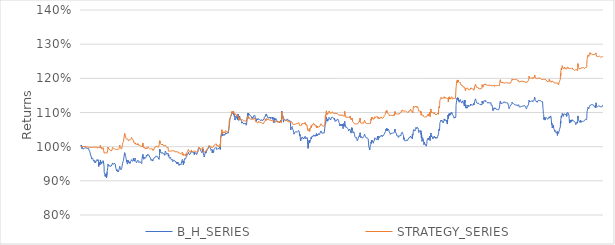
| Category | B_H_SERIES | STRATEGY_SERIES |
|---|---|---|
| 2021-06-01 09:35:00-04:00 | 1 | 1 |
| 2021-06-01 09:40:00-04:00 | 1.005 | 1 |
| 2021-06-01 09:45:00-04:00 | 1.005 | 1 |
| 2021-06-01 09:50:00-04:00 | 1.003 | 1 |
| 2021-06-01 09:55:00-04:00 | 1.004 | 1 |
| 2021-06-01 10:00:00-04:00 | 1.004 | 1 |
| 2021-06-01 10:05:00-04:00 | 1 | 1 |
| 2021-06-01 10:10:00-04:00 | 1.001 | 1 |
| 2021-06-01 10:15:00-04:00 | 0.994 | 1 |
| 2021-06-01 10:20:00-04:00 | 0.997 | 1 |
| 2021-06-01 10:25:00-04:00 | 0.998 | 1 |
| 2021-06-01 10:30:00-04:00 | 0.997 | 1 |
| 2021-06-01 10:35:00-04:00 | 0.999 | 1 |
| 2021-06-01 10:40:00-04:00 | 0.996 | 1 |
| 2021-06-01 10:45:00-04:00 | 0.996 | 1 |
| 2021-06-01 10:50:00-04:00 | 0.994 | 1 |
| 2021-06-01 10:55:00-04:00 | 0.993 | 1 |
| 2021-06-01 11:00:00-04:00 | 0.994 | 1 |
| 2021-06-01 11:05:00-04:00 | 0.993 | 1 |
| 2021-06-01 11:10:00-04:00 | 0.993 | 1 |
| 2021-06-01 11:15:00-04:00 | 0.993 | 1 |
| 2021-06-01 11:20:00-04:00 | 0.993 | 1 |
| 2021-06-01 11:25:00-04:00 | 0.995 | 1 |
| 2021-06-01 11:30:00-04:00 | 0.993 | 1 |
| 2021-06-01 11:35:00-04:00 | 0.993 | 1 |
| 2021-06-01 11:40:00-04:00 | 0.996 | 1 |
| 2021-06-01 11:45:00-04:00 | 0.996 | 1 |
| 2021-06-01 11:50:00-04:00 | 0.995 | 1 |
| 2021-06-01 11:55:00-04:00 | 0.996 | 1 |
| 2021-06-01 12:00:00-04:00 | 0.995 | 1 |
| 2021-06-01 12:05:00-04:00 | 0.995 | 0.999 |
| 2021-06-01 12:10:00-04:00 | 0.995 | 0.999 |
| 2021-06-01 12:15:00-04:00 | 0.995 | 0.999 |
| 2021-06-01 12:20:00-04:00 | 0.996 | 1.001 |
| 2021-06-01 12:25:00-04:00 | 0.997 | 1.001 |
| 2021-06-01 12:30:00-04:00 | 0.997 | 1.001 |
| 2021-06-01 12:35:00-04:00 | 0.997 | 1.002 |
| 2021-06-01 12:40:00-04:00 | 0.996 | 1.001 |
| 2021-06-01 12:45:00-04:00 | 0.998 | 1.003 |
| 2021-06-01 12:50:00-04:00 | 0.998 | 1.003 |
| 2021-06-01 12:55:00-04:00 | 0.998 | 1.002 |
| 2021-06-01 13:00:00-04:00 | 0.997 | 1.002 |
| 2021-06-01 13:05:00-04:00 | 0.996 | 1.001 |
| 2021-06-01 13:10:00-04:00 | 0.996 | 1.001 |
| 2021-06-01 13:15:00-04:00 | 0.995 | 0.999 |
| 2021-06-01 13:20:00-04:00 | 0.994 | 0.999 |
| 2021-06-01 13:25:00-04:00 | 0.995 | 0.999 |
| 2021-06-01 13:30:00-04:00 | 0.996 | 0.999 |
| 2021-06-01 13:35:00-04:00 | 0.995 | 0.999 |
| 2021-06-01 13:40:00-04:00 | 0.996 | 0.999 |
| 2021-06-01 13:45:00-04:00 | 0.996 | 0.999 |
| 2021-06-01 13:50:00-04:00 | 0.996 | 0.999 |
| 2021-06-01 13:55:00-04:00 | 0.995 | 0.999 |
| 2021-06-01 14:00:00-04:00 | 0.994 | 0.999 |
| 2021-06-01 14:05:00-04:00 | 0.994 | 0.999 |
| 2021-06-01 14:10:00-04:00 | 0.995 | 0.999 |
| 2021-06-01 14:15:00-04:00 | 0.995 | 0.999 |
| 2021-06-01 14:20:00-04:00 | 0.994 | 0.999 |
| 2021-06-01 14:25:00-04:00 | 0.995 | 0.999 |
| 2021-06-01 14:30:00-04:00 | 0.995 | 0.999 |
| 2021-06-01 14:35:00-04:00 | 0.994 | 0.999 |
| 2021-06-01 14:40:00-04:00 | 0.995 | 0.999 |
| 2021-06-01 14:45:00-04:00 | 0.996 | 0.999 |
| 2021-06-01 14:50:00-04:00 | 0.997 | 0.999 |
| 2021-06-01 14:55:00-04:00 | 0.995 | 0.999 |
| 2021-06-01 15:00:00-04:00 | 0.995 | 0.999 |
| 2021-06-01 15:05:00-04:00 | 0.994 | 0.999 |
| 2021-06-01 15:10:00-04:00 | 0.994 | 0.998 |
| 2021-06-01 15:15:00-04:00 | 0.995 | 0.999 |
| 2021-06-01 15:20:00-04:00 | 0.994 | 0.998 |
| 2021-06-01 15:25:00-04:00 | 0.994 | 0.998 |
| 2021-06-01 15:30:00-04:00 | 0.99 | 0.998 |
| 2021-06-01 15:35:00-04:00 | 0.99 | 0.998 |
| 2021-06-01 15:40:00-04:00 | 0.989 | 0.998 |
| 2021-06-01 15:45:00-04:00 | 0.989 | 0.998 |
| 2021-06-01 15:50:00-04:00 | 0.991 | 0.998 |
| 2021-06-01 15:55:00-04:00 | 0.992 | 0.998 |
| 2021-06-02 09:30:00-04:00 | 0.993 | 0.998 |
| 2021-06-02 09:35:00-04:00 | 0.988 | 0.998 |
| 2021-06-02 09:40:00-04:00 | 0.985 | 0.998 |
| 2021-06-02 09:45:00-04:00 | 0.986 | 0.998 |
| 2021-06-02 09:50:00-04:00 | 0.983 | 0.998 |
| 2021-06-02 09:55:00-04:00 | 0.981 | 0.998 |
| 2021-06-02 10:00:00-04:00 | 0.978 | 0.998 |
| 2021-06-02 10:05:00-04:00 | 0.976 | 0.998 |
| 2021-06-02 10:10:00-04:00 | 0.977 | 0.998 |
| 2021-06-02 10:15:00-04:00 | 0.977 | 0.998 |
| 2021-06-02 10:20:00-04:00 | 0.978 | 0.998 |
| 2021-06-02 10:25:00-04:00 | 0.978 | 0.998 |
| 2021-06-02 10:30:00-04:00 | 0.977 | 0.998 |
| 2021-06-02 10:35:00-04:00 | 0.973 | 0.998 |
| 2021-06-02 10:40:00-04:00 | 0.971 | 0.998 |
| 2021-06-02 10:45:00-04:00 | 0.972 | 0.998 |
| 2021-06-02 10:50:00-04:00 | 0.97 | 0.998 |
| 2021-06-02 10:55:00-04:00 | 0.964 | 0.998 |
| 2021-06-02 11:00:00-04:00 | 0.962 | 0.998 |
| 2021-06-02 11:05:00-04:00 | 0.963 | 0.998 |
| 2021-06-02 11:10:00-04:00 | 0.964 | 0.998 |
| 2021-06-02 11:15:00-04:00 | 0.965 | 0.998 |
| 2021-06-02 11:20:00-04:00 | 0.963 | 0.998 |
| 2021-06-02 11:25:00-04:00 | 0.965 | 0.998 |
| 2021-06-02 11:30:00-04:00 | 0.966 | 0.998 |
| 2021-06-02 11:35:00-04:00 | 0.964 | 0.998 |
| 2021-06-02 11:40:00-04:00 | 0.967 | 0.998 |
| 2021-06-02 11:45:00-04:00 | 0.966 | 0.998 |
| 2021-06-02 11:50:00-04:00 | 0.965 | 0.998 |
| 2021-06-02 11:55:00-04:00 | 0.965 | 0.998 |
| 2021-06-02 12:00:00-04:00 | 0.963 | 0.998 |
| 2021-06-02 12:05:00-04:00 | 0.962 | 0.998 |
| 2021-06-02 12:10:00-04:00 | 0.964 | 1 |
| 2021-06-02 12:15:00-04:00 | 0.964 | 1 |
| 2021-06-02 12:20:00-04:00 | 0.962 | 0.998 |
| 2021-06-02 12:25:00-04:00 | 0.958 | 0.998 |
| 2021-06-02 12:30:00-04:00 | 0.957 | 0.998 |
| 2021-06-02 12:35:00-04:00 | 0.957 | 0.998 |
| 2021-06-02 12:40:00-04:00 | 0.958 | 0.998 |
| 2021-06-02 12:45:00-04:00 | 0.96 | 0.998 |
| 2021-06-02 12:50:00-04:00 | 0.959 | 0.998 |
| 2021-06-02 12:55:00-04:00 | 0.959 | 0.998 |
| 2021-06-02 13:00:00-04:00 | 0.961 | 0.998 |
| 2021-06-02 13:05:00-04:00 | 0.959 | 0.998 |
| 2021-06-02 13:10:00-04:00 | 0.96 | 0.998 |
| 2021-06-02 13:15:00-04:00 | 0.958 | 0.998 |
| 2021-06-02 13:20:00-04:00 | 0.957 | 0.998 |
| 2021-06-02 13:25:00-04:00 | 0.953 | 0.998 |
| 2021-06-02 13:30:00-04:00 | 0.956 | 0.998 |
| 2021-06-02 13:35:00-04:00 | 0.957 | 0.998 |
| 2021-06-02 13:40:00-04:00 | 0.956 | 0.998 |
| 2021-06-02 13:45:00-04:00 | 0.957 | 0.998 |
| 2021-06-02 13:50:00-04:00 | 0.955 | 0.998 |
| 2021-06-02 13:55:00-04:00 | 0.954 | 0.998 |
| 2021-06-02 14:00:00-04:00 | 0.954 | 0.998 |
| 2021-06-02 14:05:00-04:00 | 0.955 | 0.998 |
| 2021-06-02 14:10:00-04:00 | 0.955 | 0.998 |
| 2021-06-02 14:15:00-04:00 | 0.954 | 0.998 |
| 2021-06-02 14:20:00-04:00 | 0.956 | 0.998 |
| 2021-06-02 14:25:00-04:00 | 0.959 | 0.998 |
| 2021-06-02 14:30:00-04:00 | 0.96 | 0.998 |
| 2021-06-02 14:35:00-04:00 | 0.961 | 0.998 |
| 2021-06-02 14:40:00-04:00 | 0.96 | 0.997 |
| 2021-06-02 14:45:00-04:00 | 0.961 | 0.998 |
| 2021-06-02 14:50:00-04:00 | 0.96 | 0.997 |
| 2021-06-02 14:55:00-04:00 | 0.961 | 0.999 |
| 2021-06-02 15:00:00-04:00 | 0.962 | 1 |
| 2021-06-02 15:05:00-04:00 | 0.962 | 0.999 |
| 2021-06-02 15:10:00-04:00 | 0.963 | 1 |
| 2021-06-02 15:15:00-04:00 | 0.963 | 1 |
| 2021-06-02 15:20:00-04:00 | 0.962 | 0.999 |
| 2021-06-02 15:25:00-04:00 | 0.958 | 0.996 |
| 2021-06-02 15:30:00-04:00 | 0.959 | 0.996 |
| 2021-06-02 15:35:00-04:00 | 0.961 | 0.998 |
| 2021-06-02 15:40:00-04:00 | 0.959 | 0.997 |
| 2021-06-02 15:45:00-04:00 | 0.96 | 0.997 |
| 2021-06-02 15:50:00-04:00 | 0.962 | 0.997 |
| 2021-06-02 15:55:00-04:00 | 0.963 | 0.997 |
| 2021-06-03 09:30:00-04:00 | 0.962 | 0.997 |
| 2021-06-03 09:35:00-04:00 | 0.954 | 0.997 |
| 2021-06-03 09:40:00-04:00 | 0.945 | 0.997 |
| 2021-06-03 09:45:00-04:00 | 0.942 | 0.997 |
| 2021-06-03 09:50:00-04:00 | 0.941 | 0.997 |
| 2021-06-03 09:55:00-04:00 | 0.951 | 0.997 |
| 2021-06-03 10:00:00-04:00 | 0.953 | 0.997 |
| 2021-06-03 10:05:00-04:00 | 0.954 | 0.997 |
| 2021-06-03 10:10:00-04:00 | 0.954 | 0.997 |
| 2021-06-03 10:15:00-04:00 | 0.951 | 0.997 |
| 2021-06-03 10:20:00-04:00 | 0.948 | 0.997 |
| 2021-06-03 10:25:00-04:00 | 0.948 | 0.997 |
| 2021-06-03 10:30:00-04:00 | 0.948 | 0.997 |
| 2021-06-03 10:35:00-04:00 | 0.951 | 0.997 |
| 2021-06-03 10:40:00-04:00 | 0.947 | 0.997 |
| 2021-06-03 10:45:00-04:00 | 0.948 | 0.997 |
| 2021-06-03 10:50:00-04:00 | 0.952 | 0.997 |
| 2021-06-03 10:55:00-04:00 | 0.954 | 0.997 |
| 2021-06-03 11:00:00-04:00 | 0.961 | 1.004 |
| 2021-06-03 11:05:00-04:00 | 0.957 | 1 |
| 2021-06-03 11:10:00-04:00 | 0.957 | 1 |
| 2021-06-03 11:15:00-04:00 | 0.955 | 0.998 |
| 2021-06-03 11:20:00-04:00 | 0.953 | 0.996 |
| 2021-06-03 11:25:00-04:00 | 0.954 | 0.997 |
| 2021-06-03 11:30:00-04:00 | 0.955 | 0.998 |
| 2021-06-03 11:35:00-04:00 | 0.952 | 0.995 |
| 2021-06-03 11:40:00-04:00 | 0.954 | 0.997 |
| 2021-06-03 11:45:00-04:00 | 0.956 | 0.999 |
| 2021-06-03 11:50:00-04:00 | 0.953 | 0.996 |
| 2021-06-03 11:55:00-04:00 | 0.951 | 0.994 |
| 2021-06-03 12:00:00-04:00 | 0.951 | 0.994 |
| 2021-06-03 12:05:00-04:00 | 0.953 | 0.994 |
| 2021-06-03 12:10:00-04:00 | 0.953 | 0.994 |
| 2021-06-03 12:15:00-04:00 | 0.951 | 0.994 |
| 2021-06-03 12:20:00-04:00 | 0.953 | 0.994 |
| 2021-06-03 12:25:00-04:00 | 0.953 | 0.994 |
| 2021-06-03 12:30:00-04:00 | 0.954 | 0.994 |
| 2021-06-03 12:35:00-04:00 | 0.954 | 0.994 |
| 2021-06-03 12:40:00-04:00 | 0.955 | 0.994 |
| 2021-06-03 12:45:00-04:00 | 0.956 | 0.995 |
| 2021-06-03 12:50:00-04:00 | 0.956 | 0.995 |
| 2021-06-03 12:55:00-04:00 | 0.956 | 0.994 |
| 2021-06-03 13:00:00-04:00 | 0.959 | 0.998 |
| 2021-06-03 13:05:00-04:00 | 0.958 | 0.997 |
| 2021-06-03 13:10:00-04:00 | 0.958 | 0.996 |
| 2021-06-03 13:15:00-04:00 | 0.956 | 0.994 |
| 2021-06-03 13:20:00-04:00 | 0.958 | 0.996 |
| 2021-06-03 13:25:00-04:00 | 0.957 | 0.996 |
| 2021-06-03 13:30:00-04:00 | 0.957 | 0.996 |
| 2021-06-03 13:35:00-04:00 | 0.956 | 0.995 |
| 2021-06-03 13:40:00-04:00 | 0.953 | 0.992 |
| 2021-06-03 13:45:00-04:00 | 0.943 | 0.982 |
| 2021-06-03 13:50:00-04:00 | 0.925 | 0.982 |
| 2021-06-03 13:55:00-04:00 | 0.926 | 0.982 |
| 2021-06-03 14:00:00-04:00 | 0.923 | 0.982 |
| 2021-06-03 14:05:00-04:00 | 0.924 | 0.982 |
| 2021-06-03 14:10:00-04:00 | 0.925 | 0.982 |
| 2021-06-03 14:15:00-04:00 | 0.924 | 0.982 |
| 2021-06-03 14:20:00-04:00 | 0.919 | 0.982 |
| 2021-06-03 14:25:00-04:00 | 0.92 | 0.982 |
| 2021-06-03 14:30:00-04:00 | 0.914 | 0.982 |
| 2021-06-03 14:35:00-04:00 | 0.913 | 0.982 |
| 2021-06-03 14:40:00-04:00 | 0.913 | 0.982 |
| 2021-06-03 14:45:00-04:00 | 0.916 | 0.982 |
| 2021-06-03 14:50:00-04:00 | 0.919 | 0.982 |
| 2021-06-03 14:55:00-04:00 | 0.919 | 0.982 |
| 2021-06-03 15:00:00-04:00 | 0.913 | 0.982 |
| 2021-06-03 15:05:00-04:00 | 0.916 | 0.982 |
| 2021-06-03 15:10:00-04:00 | 0.921 | 0.982 |
| 2021-06-03 15:15:00-04:00 | 0.918 | 0.982 |
| 2021-06-03 15:20:00-04:00 | 0.914 | 0.982 |
| 2021-06-03 15:25:00-04:00 | 0.915 | 0.982 |
| 2021-06-03 15:30:00-04:00 | 0.914 | 0.982 |
| 2021-06-03 15:35:00-04:00 | 0.909 | 0.982 |
| 2021-06-03 15:40:00-04:00 | 0.908 | 0.982 |
| 2021-06-03 15:45:00-04:00 | 0.906 | 0.982 |
| 2021-06-03 15:50:00-04:00 | 0.906 | 0.982 |
| 2021-06-03 15:55:00-04:00 | 0.909 | 0.982 |
| 2021-06-04 09:30:00-04:00 | 0.907 | 0.982 |
| 2021-06-04 09:35:00-04:00 | 0.927 | 0.982 |
| 2021-06-04 09:40:00-04:00 | 0.929 | 0.982 |
| 2021-06-04 09:45:00-04:00 | 0.931 | 0.982 |
| 2021-06-04 09:50:00-04:00 | 0.931 | 0.981 |
| 2021-06-04 09:55:00-04:00 | 0.933 | 0.983 |
| 2021-06-04 10:00:00-04:00 | 0.94 | 0.99 |
| 2021-06-04 10:05:00-04:00 | 0.944 | 0.995 |
| 2021-06-04 10:10:00-04:00 | 0.949 | 0.999 |
| 2021-06-04 10:15:00-04:00 | 0.946 | 0.996 |
| 2021-06-04 10:20:00-04:00 | 0.945 | 0.996 |
| 2021-06-04 10:25:00-04:00 | 0.948 | 0.998 |
| 2021-06-04 10:30:00-04:00 | 0.945 | 0.996 |
| 2021-06-04 10:35:00-04:00 | 0.944 | 0.994 |
| 2021-06-04 10:40:00-04:00 | 0.945 | 0.995 |
| 2021-06-04 10:45:00-04:00 | 0.946 | 0.996 |
| 2021-06-04 10:50:00-04:00 | 0.945 | 0.995 |
| 2021-06-04 10:55:00-04:00 | 0.943 | 0.993 |
| 2021-06-04 11:00:00-04:00 | 0.942 | 0.992 |
| 2021-06-04 11:05:00-04:00 | 0.941 | 0.992 |
| 2021-06-04 11:10:00-04:00 | 0.941 | 0.991 |
| 2021-06-04 11:15:00-04:00 | 0.94 | 0.991 |
| 2021-06-04 11:20:00-04:00 | 0.941 | 0.991 |
| 2021-06-04 11:25:00-04:00 | 0.944 | 0.991 |
| 2021-06-04 11:30:00-04:00 | 0.945 | 0.991 |
| 2021-06-04 11:35:00-04:00 | 0.944 | 0.991 |
| 2021-06-04 11:40:00-04:00 | 0.946 | 0.991 |
| 2021-06-04 11:45:00-04:00 | 0.946 | 0.991 |
| 2021-06-04 11:50:00-04:00 | 0.943 | 0.991 |
| 2021-06-04 11:55:00-04:00 | 0.942 | 0.99 |
| 2021-06-04 12:00:00-04:00 | 0.942 | 0.99 |
| 2021-06-04 12:05:00-04:00 | 0.941 | 0.988 |
| 2021-06-04 12:10:00-04:00 | 0.942 | 0.989 |
| 2021-06-04 12:15:00-04:00 | 0.942 | 0.99 |
| 2021-06-04 12:20:00-04:00 | 0.94 | 0.988 |
| 2021-06-04 12:25:00-04:00 | 0.942 | 0.988 |
| 2021-06-04 12:30:00-04:00 | 0.943 | 0.988 |
| 2021-06-04 12:35:00-04:00 | 0.943 | 0.988 |
| 2021-06-04 12:40:00-04:00 | 0.943 | 0.988 |
| 2021-06-04 12:45:00-04:00 | 0.942 | 0.988 |
| 2021-06-04 12:50:00-04:00 | 0.942 | 0.988 |
| 2021-06-04 12:55:00-04:00 | 0.942 | 0.988 |
| 2021-06-04 13:00:00-04:00 | 0.942 | 0.988 |
| 2021-06-04 13:05:00-04:00 | 0.943 | 0.989 |
| 2021-06-04 13:10:00-04:00 | 0.944 | 0.99 |
| 2021-06-04 13:15:00-04:00 | 0.946 | 0.992 |
| 2021-06-04 13:20:00-04:00 | 0.949 | 0.995 |
| 2021-06-04 13:25:00-04:00 | 0.948 | 0.994 |
| 2021-06-04 13:30:00-04:00 | 0.95 | 0.995 |
| 2021-06-04 13:35:00-04:00 | 0.952 | 0.998 |
| 2021-06-04 13:40:00-04:00 | 0.952 | 0.998 |
| 2021-06-04 13:45:00-04:00 | 0.953 | 0.999 |
| 2021-06-04 13:50:00-04:00 | 0.952 | 0.997 |
| 2021-06-04 13:55:00-04:00 | 0.953 | 0.999 |
| 2021-06-04 14:00:00-04:00 | 0.953 | 0.999 |
| 2021-06-04 14:05:00-04:00 | 0.951 | 0.997 |
| 2021-06-04 14:10:00-04:00 | 0.95 | 0.995 |
| 2021-06-04 14:15:00-04:00 | 0.948 | 0.994 |
| 2021-06-04 14:20:00-04:00 | 0.949 | 0.995 |
| 2021-06-04 14:25:00-04:00 | 0.949 | 0.995 |
| 2021-06-04 14:30:00-04:00 | 0.948 | 0.993 |
| 2021-06-04 14:35:00-04:00 | 0.95 | 0.993 |
| 2021-06-04 14:40:00-04:00 | 0.951 | 0.993 |
| 2021-06-04 14:45:00-04:00 | 0.951 | 0.993 |
| 2021-06-04 14:50:00-04:00 | 0.953 | 0.993 |
| 2021-06-04 14:55:00-04:00 | 0.952 | 0.993 |
| 2021-06-04 15:00:00-04:00 | 0.952 | 0.993 |
| 2021-06-04 15:05:00-04:00 | 0.951 | 0.993 |
| 2021-06-04 15:10:00-04:00 | 0.95 | 0.992 |
| 2021-06-04 15:15:00-04:00 | 0.949 | 0.992 |
| 2021-06-04 15:20:00-04:00 | 0.95 | 0.992 |
| 2021-06-04 15:25:00-04:00 | 0.95 | 0.992 |
| 2021-06-04 15:30:00-04:00 | 0.95 | 0.992 |
| 2021-06-04 15:35:00-04:00 | 0.949 | 0.992 |
| 2021-06-04 15:40:00-04:00 | 0.948 | 0.992 |
| 2021-06-04 15:45:00-04:00 | 0.947 | 0.992 |
| 2021-06-04 15:50:00-04:00 | 0.95 | 0.992 |
| 2021-06-04 15:55:00-04:00 | 0.951 | 0.992 |
| 2021-06-07 09:30:00-04:00 | 0.952 | 0.992 |
| 2021-06-07 09:35:00-04:00 | 0.937 | 0.992 |
| 2021-06-07 09:40:00-04:00 | 0.937 | 0.992 |
| 2021-06-07 09:45:00-04:00 | 0.937 | 0.992 |
| 2021-06-07 09:50:00-04:00 | 0.939 | 0.992 |
| 2021-06-07 09:55:00-04:00 | 0.932 | 0.992 |
| 2021-06-07 10:00:00-04:00 | 0.934 | 0.992 |
| 2021-06-07 10:05:00-04:00 | 0.929 | 0.992 |
| 2021-06-07 10:10:00-04:00 | 0.93 | 0.992 |
| 2021-06-07 10:15:00-04:00 | 0.93 | 0.992 |
| 2021-06-07 10:20:00-04:00 | 0.928 | 0.992 |
| 2021-06-07 10:25:00-04:00 | 0.93 | 0.992 |
| 2021-06-07 10:30:00-04:00 | 0.933 | 0.992 |
| 2021-06-07 10:35:00-04:00 | 0.932 | 0.992 |
| 2021-06-07 10:40:00-04:00 | 0.931 | 0.992 |
| 2021-06-07 10:45:00-04:00 | 0.93 | 0.992 |
| 2021-06-07 10:50:00-04:00 | 0.926 | 0.992 |
| 2021-06-07 10:55:00-04:00 | 0.926 | 0.992 |
| 2021-06-07 11:00:00-04:00 | 0.928 | 0.992 |
| 2021-06-07 11:05:00-04:00 | 0.926 | 0.992 |
| 2021-06-07 11:10:00-04:00 | 0.93 | 0.992 |
| 2021-06-07 11:15:00-04:00 | 0.93 | 0.992 |
| 2021-06-07 11:20:00-04:00 | 0.931 | 0.992 |
| 2021-06-07 11:25:00-04:00 | 0.929 | 0.992 |
| 2021-06-07 11:30:00-04:00 | 0.926 | 0.992 |
| 2021-06-07 11:35:00-04:00 | 0.927 | 0.992 |
| 2021-06-07 11:40:00-04:00 | 0.93 | 0.992 |
| 2021-06-07 11:45:00-04:00 | 0.929 | 0.992 |
| 2021-06-07 11:50:00-04:00 | 0.93 | 0.992 |
| 2021-06-07 11:55:00-04:00 | 0.933 | 0.995 |
| 2021-06-07 12:00:00-04:00 | 0.933 | 0.996 |
| 2021-06-07 12:05:00-04:00 | 0.933 | 0.995 |
| 2021-06-07 12:10:00-04:00 | 0.938 | 1 |
| 2021-06-07 12:15:00-04:00 | 0.938 | 1 |
| 2021-06-07 12:20:00-04:00 | 0.938 | 1 |
| 2021-06-07 12:25:00-04:00 | 0.942 | 1.004 |
| 2021-06-07 12:30:00-04:00 | 0.94 | 1.002 |
| 2021-06-07 12:35:00-04:00 | 0.939 | 1.001 |
| 2021-06-07 12:40:00-04:00 | 0.939 | 1.001 |
| 2021-06-07 12:45:00-04:00 | 0.939 | 1.001 |
| 2021-06-07 12:50:00-04:00 | 0.939 | 1.001 |
| 2021-06-07 12:55:00-04:00 | 0.936 | 0.998 |
| 2021-06-07 13:00:00-04:00 | 0.936 | 0.998 |
| 2021-06-07 13:05:00-04:00 | 0.936 | 0.998 |
| 2021-06-07 13:10:00-04:00 | 0.934 | 0.997 |
| 2021-06-07 13:15:00-04:00 | 0.932 | 0.994 |
| 2021-06-07 13:20:00-04:00 | 0.932 | 0.994 |
| 2021-06-07 13:25:00-04:00 | 0.932 | 0.994 |
| 2021-06-07 13:30:00-04:00 | 0.931 | 0.994 |
| 2021-06-07 13:35:00-04:00 | 0.932 | 0.994 |
| 2021-06-07 13:40:00-04:00 | 0.934 | 0.994 |
| 2021-06-07 13:45:00-04:00 | 0.936 | 0.994 |
| 2021-06-07 13:50:00-04:00 | 0.937 | 0.994 |
| 2021-06-07 13:55:00-04:00 | 0.938 | 0.994 |
| 2021-06-07 14:00:00-04:00 | 0.936 | 0.994 |
| 2021-06-07 14:05:00-04:00 | 0.938 | 0.994 |
| 2021-06-07 14:10:00-04:00 | 0.942 | 0.998 |
| 2021-06-07 14:15:00-04:00 | 0.941 | 0.997 |
| 2021-06-07 14:20:00-04:00 | 0.941 | 0.997 |
| 2021-06-07 14:25:00-04:00 | 0.95 | 1.006 |
| 2021-06-07 14:30:00-04:00 | 0.949 | 1.005 |
| 2021-06-07 14:35:00-04:00 | 0.949 | 1.005 |
| 2021-06-07 14:40:00-04:00 | 0.948 | 1.004 |
| 2021-06-07 14:45:00-04:00 | 0.947 | 1.003 |
| 2021-06-07 14:50:00-04:00 | 0.948 | 1.004 |
| 2021-06-07 14:55:00-04:00 | 0.956 | 1.013 |
| 2021-06-07 15:00:00-04:00 | 0.957 | 1.013 |
| 2021-06-07 15:05:00-04:00 | 0.958 | 1.014 |
| 2021-06-07 15:10:00-04:00 | 0.959 | 1.015 |
| 2021-06-07 15:15:00-04:00 | 0.96 | 1.016 |
| 2021-06-07 15:20:00-04:00 | 0.964 | 1.02 |
| 2021-06-07 15:25:00-04:00 | 0.966 | 1.022 |
| 2021-06-07 15:30:00-04:00 | 0.964 | 1.02 |
| 2021-06-07 15:35:00-04:00 | 0.965 | 1.021 |
| 2021-06-07 15:40:00-04:00 | 0.962 | 1.018 |
| 2021-06-07 15:45:00-04:00 | 0.963 | 1.019 |
| 2021-06-07 15:50:00-04:00 | 0.963 | 1.019 |
| 2021-06-07 15:55:00-04:00 | 0.964 | 1.02 |
| 2021-06-08 09:30:00-04:00 | 0.962 | 1.018 |
| 2021-06-08 09:35:00-04:00 | 0.982 | 1.038 |
| 2021-06-08 09:40:00-04:00 | 0.981 | 1.037 |
| 2021-06-08 09:45:00-04:00 | 0.984 | 1.04 |
| 2021-06-08 09:50:00-04:00 | 0.981 | 1.037 |
| 2021-06-08 09:55:00-04:00 | 0.976 | 1.032 |
| 2021-06-08 10:00:00-04:00 | 0.978 | 1.034 |
| 2021-06-08 10:05:00-04:00 | 0.976 | 1.032 |
| 2021-06-08 10:10:00-04:00 | 0.973 | 1.03 |
| 2021-06-08 10:15:00-04:00 | 0.976 | 1.032 |
| 2021-06-08 10:20:00-04:00 | 0.975 | 1.031 |
| 2021-06-08 10:25:00-04:00 | 0.971 | 1.027 |
| 2021-06-08 10:30:00-04:00 | 0.968 | 1.024 |
| 2021-06-08 10:35:00-04:00 | 0.966 | 1.022 |
| 2021-06-08 10:40:00-04:00 | 0.964 | 1.022 |
| 2021-06-08 10:45:00-04:00 | 0.964 | 1.022 |
| 2021-06-08 10:50:00-04:00 | 0.964 | 1.022 |
| 2021-06-08 10:55:00-04:00 | 0.959 | 1.022 |
| 2021-06-08 11:00:00-04:00 | 0.959 | 1.022 |
| 2021-06-08 11:05:00-04:00 | 0.956 | 1.022 |
| 2021-06-08 11:10:00-04:00 | 0.961 | 1.022 |
| 2021-06-08 11:15:00-04:00 | 0.957 | 1.022 |
| 2021-06-08 11:20:00-04:00 | 0.952 | 1.022 |
| 2021-06-08 11:25:00-04:00 | 0.95 | 1.022 |
| 2021-06-08 11:30:00-04:00 | 0.951 | 1.022 |
| 2021-06-08 11:35:00-04:00 | 0.953 | 1.022 |
| 2021-06-08 11:40:00-04:00 | 0.949 | 1.022 |
| 2021-06-08 11:45:00-04:00 | 0.951 | 1.022 |
| 2021-06-08 11:50:00-04:00 | 0.951 | 1.022 |
| 2021-06-08 11:55:00-04:00 | 0.954 | 1.022 |
| 2021-06-08 12:00:00-04:00 | 0.955 | 1.022 |
| 2021-06-08 12:05:00-04:00 | 0.96 | 1.022 |
| 2021-06-08 12:10:00-04:00 | 0.958 | 1.022 |
| 2021-06-08 12:15:00-04:00 | 0.958 | 1.022 |
| 2021-06-08 12:20:00-04:00 | 0.959 | 1.022 |
| 2021-06-08 12:25:00-04:00 | 0.954 | 1.017 |
| 2021-06-08 12:30:00-04:00 | 0.954 | 1.017 |
| 2021-06-08 12:35:00-04:00 | 0.955 | 1.018 |
| 2021-06-08 12:40:00-04:00 | 0.956 | 1.019 |
| 2021-06-08 12:45:00-04:00 | 0.954 | 1.017 |
| 2021-06-08 12:50:00-04:00 | 0.955 | 1.018 |
| 2021-06-08 12:55:00-04:00 | 0.955 | 1.018 |
| 2021-06-08 13:00:00-04:00 | 0.957 | 1.02 |
| 2021-06-08 13:05:00-04:00 | 0.956 | 1.02 |
| 2021-06-08 13:10:00-04:00 | 0.955 | 1.02 |
| 2021-06-08 13:15:00-04:00 | 0.952 | 1.02 |
| 2021-06-08 13:20:00-04:00 | 0.952 | 1.02 |
| 2021-06-08 13:25:00-04:00 | 0.952 | 1.02 |
| 2021-06-08 13:30:00-04:00 | 0.951 | 1.02 |
| 2021-06-08 13:35:00-04:00 | 0.952 | 1.02 |
| 2021-06-08 13:40:00-04:00 | 0.953 | 1.02 |
| 2021-06-08 13:45:00-04:00 | 0.957 | 1.02 |
| 2021-06-08 13:50:00-04:00 | 0.957 | 1.02 |
| 2021-06-08 13:55:00-04:00 | 0.957 | 1.02 |
| 2021-06-08 14:00:00-04:00 | 0.955 | 1.02 |
| 2021-06-08 14:05:00-04:00 | 0.955 | 1.02 |
| 2021-06-08 14:10:00-04:00 | 0.955 | 1.02 |
| 2021-06-08 14:15:00-04:00 | 0.954 | 1.019 |
| 2021-06-08 14:20:00-04:00 | 0.957 | 1.022 |
| 2021-06-08 14:25:00-04:00 | 0.956 | 1.021 |
| 2021-06-08 14:30:00-04:00 | 0.959 | 1.024 |
| 2021-06-08 14:35:00-04:00 | 0.962 | 1.027 |
| 2021-06-08 14:40:00-04:00 | 0.96 | 1.025 |
| 2021-06-08 14:45:00-04:00 | 0.961 | 1.026 |
| 2021-06-08 14:50:00-04:00 | 0.963 | 1.028 |
| 2021-06-08 14:55:00-04:00 | 0.96 | 1.025 |
| 2021-06-08 15:00:00-04:00 | 0.96 | 1.025 |
| 2021-06-08 15:05:00-04:00 | 0.96 | 1.025 |
| 2021-06-08 15:10:00-04:00 | 0.957 | 1.022 |
| 2021-06-08 15:15:00-04:00 | 0.957 | 1.022 |
| 2021-06-08 15:20:00-04:00 | 0.957 | 1.022 |
| 2021-06-08 15:25:00-04:00 | 0.955 | 1.019 |
| 2021-06-08 15:30:00-04:00 | 0.955 | 1.02 |
| 2021-06-08 15:35:00-04:00 | 0.957 | 1.02 |
| 2021-06-08 15:40:00-04:00 | 0.956 | 1.02 |
| 2021-06-08 15:45:00-04:00 | 0.958 | 1.02 |
| 2021-06-08 15:50:00-04:00 | 0.955 | 1.02 |
| 2021-06-08 15:55:00-04:00 | 0.959 | 1.02 |
| 2021-06-09 09:30:00-04:00 | 0.959 | 1.02 |
| 2021-06-09 09:35:00-04:00 | 0.966 | 1.02 |
| 2021-06-09 09:40:00-04:00 | 0.968 | 1.02 |
| 2021-06-09 09:45:00-04:00 | 0.967 | 1.019 |
| 2021-06-09 09:50:00-04:00 | 0.968 | 1.02 |
| 2021-06-09 09:55:00-04:00 | 0.96 | 1.013 |
| 2021-06-09 10:00:00-04:00 | 0.959 | 1.012 |
| 2021-06-09 10:05:00-04:00 | 0.958 | 1.01 |
| 2021-06-09 10:10:00-04:00 | 0.961 | 1.013 |
| 2021-06-09 10:15:00-04:00 | 0.957 | 1.01 |
| 2021-06-09 10:20:00-04:00 | 0.956 | 1.009 |
| 2021-06-09 10:25:00-04:00 | 0.959 | 1.011 |
| 2021-06-09 10:30:00-04:00 | 0.96 | 1.011 |
| 2021-06-09 10:35:00-04:00 | 0.962 | 1.011 |
| 2021-06-09 10:40:00-04:00 | 0.961 | 1.011 |
| 2021-06-09 10:45:00-04:00 | 0.964 | 1.011 |
| 2021-06-09 10:50:00-04:00 | 0.965 | 1.011 |
| 2021-06-09 10:55:00-04:00 | 0.966 | 1.011 |
| 2021-06-09 11:00:00-04:00 | 0.963 | 1.011 |
| 2021-06-09 11:05:00-04:00 | 0.965 | 1.013 |
| 2021-06-09 11:10:00-04:00 | 0.963 | 1.012 |
| 2021-06-09 11:15:00-04:00 | 0.96 | 1.009 |
| 2021-06-09 11:20:00-04:00 | 0.959 | 1.007 |
| 2021-06-09 11:25:00-04:00 | 0.959 | 1.007 |
| 2021-06-09 11:30:00-04:00 | 0.959 | 1.008 |
| 2021-06-09 11:35:00-04:00 | 0.958 | 1.007 |
| 2021-06-09 11:40:00-04:00 | 0.958 | 1.007 |
| 2021-06-09 11:45:00-04:00 | 0.956 | 1.007 |
| 2021-06-09 11:50:00-04:00 | 0.957 | 1.007 |
| 2021-06-09 11:55:00-04:00 | 0.953 | 1.007 |
| 2021-06-09 12:00:00-04:00 | 0.953 | 1.007 |
| 2021-06-09 12:05:00-04:00 | 0.955 | 1.007 |
| 2021-06-09 12:10:00-04:00 | 0.954 | 1.007 |
| 2021-06-09 12:15:00-04:00 | 0.955 | 1.007 |
| 2021-06-09 12:20:00-04:00 | 0.954 | 1.007 |
| 2021-06-09 12:25:00-04:00 | 0.956 | 1.007 |
| 2021-06-09 12:30:00-04:00 | 0.957 | 1.007 |
| 2021-06-09 12:35:00-04:00 | 0.958 | 1.007 |
| 2021-06-09 12:40:00-04:00 | 0.958 | 1.007 |
| 2021-06-09 12:45:00-04:00 | 0.958 | 1.007 |
| 2021-06-09 12:50:00-04:00 | 0.957 | 1.006 |
| 2021-06-09 12:55:00-04:00 | 0.958 | 1.007 |
| 2021-06-09 13:00:00-04:00 | 0.96 | 1.009 |
| 2021-06-09 13:05:00-04:00 | 0.96 | 1.009 |
| 2021-06-09 13:10:00-04:00 | 0.959 | 1.007 |
| 2021-06-09 13:15:00-04:00 | 0.956 | 1.005 |
| 2021-06-09 13:20:00-04:00 | 0.956 | 1.004 |
| 2021-06-09 13:25:00-04:00 | 0.956 | 1.004 |
| 2021-06-09 13:30:00-04:00 | 0.954 | 1.003 |
| 2021-06-09 13:35:00-04:00 | 0.956 | 1.004 |
| 2021-06-09 13:40:00-04:00 | 0.955 | 1.004 |
| 2021-06-09 13:45:00-04:00 | 0.953 | 1.004 |
| 2021-06-09 13:50:00-04:00 | 0.955 | 1.004 |
| 2021-06-09 13:55:00-04:00 | 0.955 | 1.004 |
| 2021-06-09 14:00:00-04:00 | 0.955 | 1.004 |
| 2021-06-09 14:05:00-04:00 | 0.955 | 1.004 |
| 2021-06-09 14:10:00-04:00 | 0.954 | 1.004 |
| 2021-06-09 14:15:00-04:00 | 0.955 | 1.004 |
| 2021-06-09 14:20:00-04:00 | 0.955 | 1.004 |
| 2021-06-09 14:25:00-04:00 | 0.956 | 1.004 |
| 2021-06-09 14:30:00-04:00 | 0.957 | 1.004 |
| 2021-06-09 14:35:00-04:00 | 0.956 | 1.004 |
| 2021-06-09 14:40:00-04:00 | 0.956 | 1.003 |
| 2021-06-09 14:45:00-04:00 | 0.955 | 1.002 |
| 2021-06-09 14:50:00-04:00 | 0.954 | 1.002 |
| 2021-06-09 14:55:00-04:00 | 0.955 | 1.002 |
| 2021-06-09 15:00:00-04:00 | 0.953 | 1.001 |
| 2021-06-09 15:05:00-04:00 | 0.953 | 1 |
| 2021-06-09 15:10:00-04:00 | 0.953 | 1 |
| 2021-06-09 15:15:00-04:00 | 0.954 | 1 |
| 2021-06-09 15:20:00-04:00 | 0.953 | 1 |
| 2021-06-09 15:25:00-04:00 | 0.951 | 1 |
| 2021-06-09 15:30:00-04:00 | 0.951 | 1 |
| 2021-06-09 15:35:00-04:00 | 0.953 | 1 |
| 2021-06-09 15:40:00-04:00 | 0.951 | 1 |
| 2021-06-09 15:45:00-04:00 | 0.95 | 1 |
| 2021-06-09 15:50:00-04:00 | 0.951 | 1 |
| 2021-06-09 15:55:00-04:00 | 0.953 | 1 |
| 2021-06-10 09:30:00-04:00 | 0.952 | 1 |
| 2021-06-10 09:35:00-04:00 | 0.965 | 1 |
| 2021-06-10 09:40:00-04:00 | 0.967 | 1 |
| 2021-06-10 09:45:00-04:00 | 0.968 | 1.001 |
| 2021-06-10 09:50:00-04:00 | 0.972 | 1.005 |
| 2021-06-10 09:55:00-04:00 | 0.969 | 1.003 |
| 2021-06-10 10:00:00-04:00 | 0.967 | 1.001 |
| 2021-06-10 10:05:00-04:00 | 0.974 | 1.007 |
| 2021-06-10 10:10:00-04:00 | 0.977 | 1.011 |
| 2021-06-10 10:15:00-04:00 | 0.974 | 1.007 |
| 2021-06-10 10:20:00-04:00 | 0.974 | 1.007 |
| 2021-06-10 10:25:00-04:00 | 0.973 | 1.006 |
| 2021-06-10 10:30:00-04:00 | 0.971 | 1.004 |
| 2021-06-10 10:35:00-04:00 | 0.973 | 1.006 |
| 2021-06-10 10:40:00-04:00 | 0.968 | 1.001 |
| 2021-06-10 10:45:00-04:00 | 0.967 | 1.001 |
| 2021-06-10 10:50:00-04:00 | 0.963 | 0.997 |
| 2021-06-10 10:55:00-04:00 | 0.965 | 0.998 |
| 2021-06-10 11:00:00-04:00 | 0.968 | 0.998 |
| 2021-06-10 11:05:00-04:00 | 0.967 | 0.998 |
| 2021-06-10 11:10:00-04:00 | 0.969 | 0.998 |
| 2021-06-10 11:15:00-04:00 | 0.968 | 0.998 |
| 2021-06-10 11:20:00-04:00 | 0.968 | 0.998 |
| 2021-06-10 11:25:00-04:00 | 0.969 | 0.998 |
| 2021-06-10 11:30:00-04:00 | 0.969 | 0.998 |
| 2021-06-10 11:35:00-04:00 | 0.969 | 0.998 |
| 2021-06-10 11:40:00-04:00 | 0.97 | 0.998 |
| 2021-06-10 11:45:00-04:00 | 0.966 | 0.994 |
| 2021-06-10 11:50:00-04:00 | 0.966 | 0.994 |
| 2021-06-10 11:55:00-04:00 | 0.966 | 0.994 |
| 2021-06-10 12:00:00-04:00 | 0.967 | 0.994 |
| 2021-06-10 12:05:00-04:00 | 0.966 | 0.994 |
| 2021-06-10 12:10:00-04:00 | 0.966 | 0.994 |
| 2021-06-10 12:15:00-04:00 | 0.965 | 0.994 |
| 2021-06-10 12:20:00-04:00 | 0.967 | 0.994 |
| 2021-06-10 12:25:00-04:00 | 0.969 | 0.994 |
| 2021-06-10 12:30:00-04:00 | 0.968 | 0.994 |
| 2021-06-10 12:35:00-04:00 | 0.97 | 0.994 |
| 2021-06-10 12:40:00-04:00 | 0.972 | 0.994 |
| 2021-06-10 12:45:00-04:00 | 0.971 | 0.992 |
| 2021-06-10 12:50:00-04:00 | 0.975 | 0.997 |
| 2021-06-10 12:55:00-04:00 | 0.977 | 0.999 |
| 2021-06-10 13:00:00-04:00 | 0.975 | 0.996 |
| 2021-06-10 13:05:00-04:00 | 0.975 | 0.996 |
| 2021-06-10 13:10:00-04:00 | 0.973 | 0.995 |
| 2021-06-10 13:15:00-04:00 | 0.972 | 0.994 |
| 2021-06-10 13:20:00-04:00 | 0.976 | 0.997 |
| 2021-06-10 13:25:00-04:00 | 0.978 | 1 |
| 2021-06-10 13:30:00-04:00 | 0.976 | 0.998 |
| 2021-06-10 13:35:00-04:00 | 0.976 | 0.998 |
| 2021-06-10 13:40:00-04:00 | 0.977 | 0.998 |
| 2021-06-10 13:45:00-04:00 | 0.977 | 0.998 |
| 2021-06-10 13:50:00-04:00 | 0.978 | 0.999 |
| 2021-06-10 13:55:00-04:00 | 0.979 | 1 |
| 2021-06-10 14:00:00-04:00 | 0.979 | 1 |
| 2021-06-10 14:05:00-04:00 | 0.978 | 1 |
| 2021-06-10 14:10:00-04:00 | 0.976 | 0.998 |
| 2021-06-10 14:15:00-04:00 | 0.975 | 0.997 |
| 2021-06-10 14:20:00-04:00 | 0.974 | 0.996 |
| 2021-06-10 14:25:00-04:00 | 0.973 | 0.994 |
| 2021-06-10 14:30:00-04:00 | 0.972 | 0.994 |
| 2021-06-10 14:35:00-04:00 | 0.974 | 0.994 |
| 2021-06-10 14:40:00-04:00 | 0.975 | 0.994 |
| 2021-06-10 14:45:00-04:00 | 0.974 | 0.994 |
| 2021-06-10 14:50:00-04:00 | 0.973 | 0.994 |
| 2021-06-10 14:55:00-04:00 | 0.975 | 0.994 |
| 2021-06-10 15:00:00-04:00 | 0.974 | 0.994 |
| 2021-06-10 15:05:00-04:00 | 0.969 | 0.994 |
| 2021-06-10 15:10:00-04:00 | 0.971 | 0.994 |
| 2021-06-10 15:15:00-04:00 | 0.969 | 0.994 |
| 2021-06-10 15:20:00-04:00 | 0.969 | 0.994 |
| 2021-06-10 15:25:00-04:00 | 0.97 | 0.994 |
| 2021-06-10 15:30:00-04:00 | 0.968 | 0.994 |
| 2021-06-10 15:35:00-04:00 | 0.968 | 0.994 |
| 2021-06-10 15:40:00-04:00 | 0.969 | 0.994 |
| 2021-06-10 15:45:00-04:00 | 0.969 | 0.994 |
| 2021-06-10 15:50:00-04:00 | 0.968 | 0.994 |
| 2021-06-10 15:55:00-04:00 | 0.97 | 0.994 |
| 2021-06-11 09:30:00-04:00 | 0.97 | 0.994 |
| 2021-06-11 09:35:00-04:00 | 0.963 | 0.994 |
| 2021-06-11 09:40:00-04:00 | 0.961 | 0.994 |
| 2021-06-11 09:45:00-04:00 | 0.964 | 0.994 |
| 2021-06-11 09:50:00-04:00 | 0.959 | 0.994 |
| 2021-06-11 09:55:00-04:00 | 0.959 | 0.994 |
| 2021-06-11 10:00:00-04:00 | 0.961 | 0.994 |
| 2021-06-11 10:05:00-04:00 | 0.959 | 0.994 |
| 2021-06-11 10:10:00-04:00 | 0.96 | 0.994 |
| 2021-06-11 10:15:00-04:00 | 0.96 | 0.994 |
| 2021-06-11 10:20:00-04:00 | 0.961 | 0.994 |
| 2021-06-11 10:25:00-04:00 | 0.963 | 0.994 |
| 2021-06-11 10:30:00-04:00 | 0.965 | 0.994 |
| 2021-06-11 10:35:00-04:00 | 0.965 | 0.994 |
| 2021-06-11 10:40:00-04:00 | 0.963 | 0.994 |
| 2021-06-11 10:45:00-04:00 | 0.963 | 0.994 |
| 2021-06-11 10:50:00-04:00 | 0.961 | 0.992 |
| 2021-06-11 10:55:00-04:00 | 0.961 | 0.992 |
| 2021-06-11 11:00:00-04:00 | 0.961 | 0.992 |
| 2021-06-11 11:05:00-04:00 | 0.958 | 0.989 |
| 2021-06-11 11:10:00-04:00 | 0.959 | 0.99 |
| 2021-06-11 11:15:00-04:00 | 0.96 | 0.991 |
| 2021-06-11 11:20:00-04:00 | 0.96 | 0.991 |
| 2021-06-11 11:25:00-04:00 | 0.962 | 0.991 |
| 2021-06-11 11:30:00-04:00 | 0.963 | 0.991 |
| 2021-06-11 11:35:00-04:00 | 0.963 | 0.991 |
| 2021-06-11 11:40:00-04:00 | 0.964 | 0.991 |
| 2021-06-11 11:45:00-04:00 | 0.961 | 0.991 |
| 2021-06-11 11:50:00-04:00 | 0.962 | 0.991 |
| 2021-06-11 11:55:00-04:00 | 0.961 | 0.99 |
| 2021-06-11 12:00:00-04:00 | 0.963 | 0.992 |
| 2021-06-11 12:05:00-04:00 | 0.964 | 0.993 |
| 2021-06-11 12:10:00-04:00 | 0.968 | 0.997 |
| 2021-06-11 12:15:00-04:00 | 0.97 | 0.999 |
| 2021-06-11 12:20:00-04:00 | 0.968 | 0.997 |
| 2021-06-11 12:25:00-04:00 | 0.969 | 0.998 |
| 2021-06-11 12:30:00-04:00 | 0.968 | 0.997 |
| 2021-06-11 12:35:00-04:00 | 0.969 | 0.998 |
| 2021-06-11 12:40:00-04:00 | 0.97 | 0.999 |
| 2021-06-11 12:45:00-04:00 | 0.969 | 0.998 |
| 2021-06-11 12:50:00-04:00 | 0.969 | 0.998 |
| 2021-06-11 12:55:00-04:00 | 0.969 | 0.998 |
| 2021-06-11 13:00:00-04:00 | 0.971 | 1 |
| 2021-06-11 13:05:00-04:00 | 0.97 | 0.999 |
| 2021-06-11 13:10:00-04:00 | 0.97 | 0.999 |
| 2021-06-11 13:15:00-04:00 | 0.972 | 1.001 |
| 2021-06-11 13:20:00-04:00 | 0.974 | 1.003 |
| 2021-06-11 13:25:00-04:00 | 0.973 | 1.002 |
| 2021-06-11 13:30:00-04:00 | 0.973 | 1.002 |
| 2021-06-11 13:35:00-04:00 | 0.972 | 1.001 |
| 2021-06-11 13:40:00-04:00 | 0.971 | 1 |
| 2021-06-11 13:45:00-04:00 | 0.972 | 1.001 |
| 2021-06-11 13:50:00-04:00 | 0.972 | 1.001 |
| 2021-06-11 13:55:00-04:00 | 0.972 | 1.001 |
| 2021-06-11 14:00:00-04:00 | 0.972 | 1.001 |
| 2021-06-11 14:05:00-04:00 | 0.971 | 1 |
| 2021-06-11 14:10:00-04:00 | 0.97 | 0.999 |
| 2021-06-11 14:15:00-04:00 | 0.97 | 0.999 |
| 2021-06-11 14:20:00-04:00 | 0.97 | 0.999 |
| 2021-06-11 14:25:00-04:00 | 0.969 | 0.999 |
| 2021-06-11 14:30:00-04:00 | 0.969 | 0.999 |
| 2021-06-11 14:35:00-04:00 | 0.97 | 0.999 |
| 2021-06-11 14:40:00-04:00 | 0.97 | 0.999 |
| 2021-06-11 14:45:00-04:00 | 0.97 | 0.999 |
| 2021-06-11 14:50:00-04:00 | 0.969 | 0.999 |
| 2021-06-11 14:55:00-04:00 | 0.968 | 0.999 |
| 2021-06-11 15:00:00-04:00 | 0.967 | 0.999 |
| 2021-06-11 15:05:00-04:00 | 0.966 | 0.999 |
| 2021-06-11 15:10:00-04:00 | 0.966 | 0.999 |
| 2021-06-11 15:15:00-04:00 | 0.964 | 0.999 |
| 2021-06-11 15:20:00-04:00 | 0.967 | 0.999 |
| 2021-06-11 15:25:00-04:00 | 0.966 | 0.999 |
| 2021-06-11 15:30:00-04:00 | 0.967 | 0.999 |
| 2021-06-11 15:35:00-04:00 | 0.966 | 0.999 |
| 2021-06-11 15:40:00-04:00 | 0.966 | 0.999 |
| 2021-06-11 15:45:00-04:00 | 0.963 | 0.999 |
| 2021-06-11 15:50:00-04:00 | 0.966 | 0.999 |
| 2021-06-11 15:55:00-04:00 | 0.97 | 0.999 |
| 2021-06-14 09:30:00-04:00 | 0.97 | 0.999 |
| 2021-06-14 09:35:00-04:00 | 0.974 | 0.999 |
| 2021-06-14 09:40:00-04:00 | 0.993 | 1.017 |
| 2021-06-14 09:45:00-04:00 | 0.988 | 1.012 |
| 2021-06-14 09:50:00-04:00 | 0.991 | 1.016 |
| 2021-06-14 09:55:00-04:00 | 0.989 | 1.014 |
| 2021-06-14 10:00:00-04:00 | 0.99 | 1.015 |
| 2021-06-14 10:05:00-04:00 | 0.985 | 1.01 |
| 2021-06-14 10:10:00-04:00 | 0.986 | 1.011 |
| 2021-06-14 10:15:00-04:00 | 0.987 | 1.012 |
| 2021-06-14 10:20:00-04:00 | 0.984 | 1.009 |
| 2021-06-14 10:25:00-04:00 | 0.986 | 1.01 |
| 2021-06-14 10:30:00-04:00 | 0.984 | 1.009 |
| 2021-06-14 10:35:00-04:00 | 0.983 | 1.008 |
| 2021-06-14 10:40:00-04:00 | 0.982 | 1.006 |
| 2021-06-14 10:45:00-04:00 | 0.981 | 1.006 |
| 2021-06-14 10:50:00-04:00 | 0.984 | 1.006 |
| 2021-06-14 10:55:00-04:00 | 0.984 | 1.006 |
| 2021-06-14 11:00:00-04:00 | 0.983 | 1.006 |
| 2021-06-14 11:05:00-04:00 | 0.979 | 1.006 |
| 2021-06-14 11:10:00-04:00 | 0.98 | 1.006 |
| 2021-06-14 11:15:00-04:00 | 0.981 | 1.006 |
| 2021-06-14 11:20:00-04:00 | 0.982 | 1.006 |
| 2021-06-14 11:25:00-04:00 | 0.982 | 1.006 |
| 2021-06-14 11:30:00-04:00 | 0.982 | 1.006 |
| 2021-06-14 11:35:00-04:00 | 0.981 | 1.006 |
| 2021-06-14 11:40:00-04:00 | 0.981 | 1.006 |
| 2021-06-14 11:45:00-04:00 | 0.98 | 1.006 |
| 2021-06-14 11:50:00-04:00 | 0.981 | 1.006 |
| 2021-06-14 11:55:00-04:00 | 0.983 | 1.006 |
| 2021-06-14 12:00:00-04:00 | 0.983 | 1.006 |
| 2021-06-14 12:05:00-04:00 | 0.984 | 1.006 |
| 2021-06-14 12:10:00-04:00 | 0.982 | 1.006 |
| 2021-06-14 12:15:00-04:00 | 0.982 | 1.006 |
| 2021-06-14 12:20:00-04:00 | 0.98 | 1.004 |
| 2021-06-14 12:25:00-04:00 | 0.979 | 1.003 |
| 2021-06-14 12:30:00-04:00 | 0.978 | 1.003 |
| 2021-06-14 12:35:00-04:00 | 0.977 | 1.002 |
| 2021-06-14 12:40:00-04:00 | 0.978 | 1.002 |
| 2021-06-14 12:45:00-04:00 | 0.978 | 1.002 |
| 2021-06-14 12:50:00-04:00 | 0.978 | 1.002 |
| 2021-06-14 12:55:00-04:00 | 0.978 | 1.002 |
| 2021-06-14 13:00:00-04:00 | 0.979 | 1.002 |
| 2021-06-14 13:05:00-04:00 | 0.979 | 1.002 |
| 2021-06-14 13:10:00-04:00 | 0.979 | 1.002 |
| 2021-06-14 13:15:00-04:00 | 0.978 | 1.002 |
| 2021-06-14 13:20:00-04:00 | 0.977 | 1.002 |
| 2021-06-14 13:25:00-04:00 | 0.975 | 1.002 |
| 2021-06-14 13:30:00-04:00 | 0.975 | 1.002 |
| 2021-06-14 13:35:00-04:00 | 0.978 | 1.002 |
| 2021-06-14 13:40:00-04:00 | 0.979 | 1.002 |
| 2021-06-14 13:45:00-04:00 | 0.984 | 1.002 |
| 2021-06-14 13:50:00-04:00 | 0.984 | 1.002 |
| 2021-06-14 13:55:00-04:00 | 0.987 | 1.005 |
| 2021-06-14 14:00:00-04:00 | 0.988 | 1.006 |
| 2021-06-14 14:05:00-04:00 | 0.987 | 1.005 |
| 2021-06-14 14:10:00-04:00 | 0.986 | 1.004 |
| 2021-06-14 14:15:00-04:00 | 0.988 | 1.005 |
| 2021-06-14 14:20:00-04:00 | 0.986 | 1.004 |
| 2021-06-14 14:25:00-04:00 | 0.984 | 1.002 |
| 2021-06-14 14:30:00-04:00 | 0.983 | 1 |
| 2021-06-14 14:35:00-04:00 | 0.984 | 1.001 |
| 2021-06-14 14:40:00-04:00 | 0.982 | 1 |
| 2021-06-14 14:45:00-04:00 | 0.981 | 0.999 |
| 2021-06-14 14:50:00-04:00 | 0.98 | 0.997 |
| 2021-06-14 14:55:00-04:00 | 0.981 | 0.997 |
| 2021-06-14 15:00:00-04:00 | 0.98 | 0.997 |
| 2021-06-14 15:05:00-04:00 | 0.98 | 0.997 |
| 2021-06-14 15:10:00-04:00 | 0.978 | 0.997 |
| 2021-06-14 15:15:00-04:00 | 0.977 | 0.997 |
| 2021-06-14 15:20:00-04:00 | 0.978 | 0.997 |
| 2021-06-14 15:25:00-04:00 | 0.979 | 0.997 |
| 2021-06-14 15:30:00-04:00 | 0.979 | 0.997 |
| 2021-06-14 15:35:00-04:00 | 0.98 | 0.997 |
| 2021-06-14 15:40:00-04:00 | 0.979 | 0.997 |
| 2021-06-14 15:45:00-04:00 | 0.979 | 0.997 |
| 2021-06-14 15:50:00-04:00 | 0.98 | 0.997 |
| 2021-06-14 15:55:00-04:00 | 0.981 | 0.997 |
| 2021-06-15 09:30:00-04:00 | 0.983 | 0.997 |
| 2021-06-15 09:35:00-04:00 | 0.975 | 0.99 |
| 2021-06-15 09:40:00-04:00 | 0.972 | 0.987 |
| 2021-06-15 09:45:00-04:00 | 0.973 | 0.987 |
| 2021-06-15 09:50:00-04:00 | 0.974 | 0.987 |
| 2021-06-15 09:55:00-04:00 | 0.976 | 0.987 |
| 2021-06-15 10:00:00-04:00 | 0.972 | 0.987 |
| 2021-06-15 10:05:00-04:00 | 0.972 | 0.987 |
| 2021-06-15 10:10:00-04:00 | 0.971 | 0.987 |
| 2021-06-15 10:15:00-04:00 | 0.969 | 0.987 |
| 2021-06-15 10:20:00-04:00 | 0.971 | 0.987 |
| 2021-06-15 10:25:00-04:00 | 0.97 | 0.987 |
| 2021-06-15 10:30:00-04:00 | 0.966 | 0.987 |
| 2021-06-15 10:35:00-04:00 | 0.966 | 0.987 |
| 2021-06-15 10:40:00-04:00 | 0.968 | 0.987 |
| 2021-06-15 10:45:00-04:00 | 0.966 | 0.987 |
| 2021-06-15 10:50:00-04:00 | 0.966 | 0.987 |
| 2021-06-15 10:55:00-04:00 | 0.967 | 0.987 |
| 2021-06-15 11:00:00-04:00 | 0.966 | 0.987 |
| 2021-06-15 11:05:00-04:00 | 0.967 | 0.987 |
| 2021-06-15 11:10:00-04:00 | 0.969 | 0.987 |
| 2021-06-15 11:15:00-04:00 | 0.97 | 0.987 |
| 2021-06-15 11:20:00-04:00 | 0.97 | 0.987 |
| 2021-06-15 11:25:00-04:00 | 0.968 | 0.987 |
| 2021-06-15 11:30:00-04:00 | 0.965 | 0.987 |
| 2021-06-15 11:35:00-04:00 | 0.965 | 0.987 |
| 2021-06-15 11:40:00-04:00 | 0.963 | 0.987 |
| 2021-06-15 11:45:00-04:00 | 0.963 | 0.987 |
| 2021-06-15 11:50:00-04:00 | 0.964 | 0.988 |
| 2021-06-15 11:55:00-04:00 | 0.961 | 0.988 |
| 2021-06-15 12:00:00-04:00 | 0.963 | 0.988 |
| 2021-06-15 12:05:00-04:00 | 0.963 | 0.988 |
| 2021-06-15 12:10:00-04:00 | 0.962 | 0.988 |
| 2021-06-15 12:15:00-04:00 | 0.963 | 0.988 |
| 2021-06-15 12:20:00-04:00 | 0.961 | 0.988 |
| 2021-06-15 12:25:00-04:00 | 0.962 | 0.988 |
| 2021-06-15 12:30:00-04:00 | 0.964 | 0.988 |
| 2021-06-15 12:35:00-04:00 | 0.963 | 0.988 |
| 2021-06-15 12:40:00-04:00 | 0.962 | 0.988 |
| 2021-06-15 12:45:00-04:00 | 0.959 | 0.988 |
| 2021-06-15 12:50:00-04:00 | 0.958 | 0.988 |
| 2021-06-15 12:55:00-04:00 | 0.958 | 0.988 |
| 2021-06-15 13:00:00-04:00 | 0.956 | 0.988 |
| 2021-06-15 13:05:00-04:00 | 0.956 | 0.988 |
| 2021-06-15 13:10:00-04:00 | 0.959 | 0.988 |
| 2021-06-15 13:15:00-04:00 | 0.96 | 0.988 |
| 2021-06-15 13:20:00-04:00 | 0.96 | 0.988 |
| 2021-06-15 13:25:00-04:00 | 0.96 | 0.988 |
| 2021-06-15 13:30:00-04:00 | 0.96 | 0.988 |
| 2021-06-15 13:35:00-04:00 | 0.96 | 0.988 |
| 2021-06-15 13:40:00-04:00 | 0.959 | 0.988 |
| 2021-06-15 13:45:00-04:00 | 0.959 | 0.988 |
| 2021-06-15 13:50:00-04:00 | 0.961 | 0.988 |
| 2021-06-15 13:55:00-04:00 | 0.96 | 0.987 |
| 2021-06-15 14:00:00-04:00 | 0.961 | 0.988 |
| 2021-06-15 14:05:00-04:00 | 0.962 | 0.989 |
| 2021-06-15 14:10:00-04:00 | 0.961 | 0.988 |
| 2021-06-15 14:15:00-04:00 | 0.958 | 0.985 |
| 2021-06-15 14:20:00-04:00 | 0.959 | 0.986 |
| 2021-06-15 14:25:00-04:00 | 0.959 | 0.986 |
| 2021-06-15 14:30:00-04:00 | 0.958 | 0.985 |
| 2021-06-15 14:35:00-04:00 | 0.957 | 0.985 |
| 2021-06-15 14:40:00-04:00 | 0.955 | 0.985 |
| 2021-06-15 14:45:00-04:00 | 0.956 | 0.985 |
| 2021-06-15 14:50:00-04:00 | 0.957 | 0.985 |
| 2021-06-15 14:55:00-04:00 | 0.957 | 0.985 |
| 2021-06-15 15:00:00-04:00 | 0.956 | 0.985 |
| 2021-06-15 15:05:00-04:00 | 0.954 | 0.985 |
| 2021-06-15 15:10:00-04:00 | 0.955 | 0.985 |
| 2021-06-15 15:15:00-04:00 | 0.955 | 0.985 |
| 2021-06-15 15:20:00-04:00 | 0.956 | 0.985 |
| 2021-06-15 15:25:00-04:00 | 0.955 | 0.985 |
| 2021-06-15 15:30:00-04:00 | 0.955 | 0.985 |
| 2021-06-15 15:35:00-04:00 | 0.954 | 0.985 |
| 2021-06-15 15:40:00-04:00 | 0.951 | 0.985 |
| 2021-06-15 15:45:00-04:00 | 0.952 | 0.985 |
| 2021-06-15 15:50:00-04:00 | 0.954 | 0.985 |
| 2021-06-15 15:55:00-04:00 | 0.952 | 0.985 |
| 2021-06-16 09:30:00-04:00 | 0.952 | 0.985 |
| 2021-06-16 09:35:00-04:00 | 0.957 | 0.985 |
| 2021-06-16 09:40:00-04:00 | 0.951 | 0.985 |
| 2021-06-16 09:45:00-04:00 | 0.954 | 0.985 |
| 2021-06-16 09:50:00-04:00 | 0.954 | 0.985 |
| 2021-06-16 09:55:00-04:00 | 0.951 | 0.985 |
| 2021-06-16 10:00:00-04:00 | 0.95 | 0.985 |
| 2021-06-16 10:05:00-04:00 | 0.949 | 0.985 |
| 2021-06-16 10:10:00-04:00 | 0.95 | 0.985 |
| 2021-06-16 10:15:00-04:00 | 0.954 | 0.985 |
| 2021-06-16 10:20:00-04:00 | 0.955 | 0.985 |
| 2021-06-16 10:25:00-04:00 | 0.953 | 0.985 |
| 2021-06-16 10:30:00-04:00 | 0.952 | 0.985 |
| 2021-06-16 10:35:00-04:00 | 0.951 | 0.985 |
| 2021-06-16 10:40:00-04:00 | 0.952 | 0.985 |
| 2021-06-16 10:45:00-04:00 | 0.952 | 0.985 |
| 2021-06-16 10:50:00-04:00 | 0.949 | 0.981 |
| 2021-06-16 10:55:00-04:00 | 0.949 | 0.982 |
| 2021-06-16 11:00:00-04:00 | 0.949 | 0.982 |
| 2021-06-16 11:05:00-04:00 | 0.949 | 0.982 |
| 2021-06-16 11:10:00-04:00 | 0.945 | 0.982 |
| 2021-06-16 11:15:00-04:00 | 0.945 | 0.982 |
| 2021-06-16 11:20:00-04:00 | 0.946 | 0.982 |
| 2021-06-16 11:25:00-04:00 | 0.945 | 0.982 |
| 2021-06-16 11:30:00-04:00 | 0.946 | 0.982 |
| 2021-06-16 11:35:00-04:00 | 0.946 | 0.982 |
| 2021-06-16 11:40:00-04:00 | 0.946 | 0.982 |
| 2021-06-16 11:45:00-04:00 | 0.95 | 0.982 |
| 2021-06-16 11:50:00-04:00 | 0.951 | 0.982 |
| 2021-06-16 11:55:00-04:00 | 0.952 | 0.982 |
| 2021-06-16 12:00:00-04:00 | 0.952 | 0.982 |
| 2021-06-16 12:05:00-04:00 | 0.953 | 0.983 |
| 2021-06-16 12:10:00-04:00 | 0.952 | 0.982 |
| 2021-06-16 12:15:00-04:00 | 0.949 | 0.979 |
| 2021-06-16 12:20:00-04:00 | 0.95 | 0.98 |
| 2021-06-16 12:25:00-04:00 | 0.948 | 0.978 |
| 2021-06-16 12:30:00-04:00 | 0.947 | 0.977 |
| 2021-06-16 12:35:00-04:00 | 0.948 | 0.978 |
| 2021-06-16 12:40:00-04:00 | 0.949 | 0.979 |
| 2021-06-16 12:45:00-04:00 | 0.949 | 0.979 |
| 2021-06-16 12:50:00-04:00 | 0.95 | 0.979 |
| 2021-06-16 12:55:00-04:00 | 0.953 | 0.979 |
| 2021-06-16 13:00:00-04:00 | 0.956 | 0.979 |
| 2021-06-16 13:05:00-04:00 | 0.958 | 0.979 |
| 2021-06-16 13:10:00-04:00 | 0.958 | 0.979 |
| 2021-06-16 13:15:00-04:00 | 0.959 | 0.981 |
| 2021-06-16 13:20:00-04:00 | 0.96 | 0.981 |
| 2021-06-16 13:25:00-04:00 | 0.96 | 0.982 |
| 2021-06-16 13:30:00-04:00 | 0.96 | 0.982 |
| 2021-06-16 13:35:00-04:00 | 0.963 | 0.984 |
| 2021-06-16 13:40:00-04:00 | 0.963 | 0.985 |
| 2021-06-16 13:45:00-04:00 | 0.963 | 0.984 |
| 2021-06-16 13:50:00-04:00 | 0.961 | 0.982 |
| 2021-06-16 13:55:00-04:00 | 0.961 | 0.983 |
| 2021-06-16 14:00:00-04:00 | 0.959 | 0.98 |
| 2021-06-16 14:05:00-04:00 | 0.953 | 0.975 |
| 2021-06-16 14:10:00-04:00 | 0.957 | 0.979 |
| 2021-06-16 14:15:00-04:00 | 0.954 | 0.976 |
| 2021-06-16 14:20:00-04:00 | 0.947 | 0.976 |
| 2021-06-16 14:25:00-04:00 | 0.951 | 0.976 |
| 2021-06-16 14:30:00-04:00 | 0.952 | 0.976 |
| 2021-06-16 14:35:00-04:00 | 0.953 | 0.976 |
| 2021-06-16 14:40:00-04:00 | 0.955 | 0.976 |
| 2021-06-16 14:45:00-04:00 | 0.952 | 0.976 |
| 2021-06-16 14:50:00-04:00 | 0.954 | 0.976 |
| 2021-06-16 14:55:00-04:00 | 0.955 | 0.976 |
| 2021-06-16 15:00:00-04:00 | 0.959 | 0.976 |
| 2021-06-16 15:05:00-04:00 | 0.959 | 0.976 |
| 2021-06-16 15:10:00-04:00 | 0.965 | 0.976 |
| 2021-06-16 15:15:00-04:00 | 0.965 | 0.975 |
| 2021-06-16 15:20:00-04:00 | 0.966 | 0.977 |
| 2021-06-16 15:25:00-04:00 | 0.966 | 0.977 |
| 2021-06-16 15:30:00-04:00 | 0.963 | 0.974 |
| 2021-06-16 15:35:00-04:00 | 0.963 | 0.974 |
| 2021-06-16 15:40:00-04:00 | 0.965 | 0.976 |
| 2021-06-16 15:45:00-04:00 | 0.965 | 0.976 |
| 2021-06-16 15:50:00-04:00 | 0.964 | 0.975 |
| 2021-06-16 15:55:00-04:00 | 0.964 | 0.975 |
| 2021-06-17 09:30:00-04:00 | 0.961 | 0.972 |
| 2021-06-17 09:35:00-04:00 | 0.961 | 0.972 |
| 2021-06-17 09:40:00-04:00 | 0.965 | 0.976 |
| 2021-06-17 09:45:00-04:00 | 0.962 | 0.973 |
| 2021-06-17 09:50:00-04:00 | 0.968 | 0.979 |
| 2021-06-17 09:55:00-04:00 | 0.97 | 0.979 |
| 2021-06-17 10:00:00-04:00 | 0.97 | 0.979 |
| 2021-06-17 10:05:00-04:00 | 0.968 | 0.977 |
| 2021-06-17 10:10:00-04:00 | 0.967 | 0.976 |
| 2021-06-17 10:15:00-04:00 | 0.97 | 0.979 |
| 2021-06-17 10:20:00-04:00 | 0.971 | 0.98 |
| 2021-06-17 10:25:00-04:00 | 0.975 | 0.984 |
| 2021-06-17 10:30:00-04:00 | 0.974 | 0.983 |
| 2021-06-17 10:35:00-04:00 | 0.973 | 0.982 |
| 2021-06-17 10:40:00-04:00 | 0.975 | 0.983 |
| 2021-06-17 10:45:00-04:00 | 0.975 | 0.983 |
| 2021-06-17 10:50:00-04:00 | 0.975 | 0.984 |
| 2021-06-17 10:55:00-04:00 | 0.974 | 0.983 |
| 2021-06-17 11:00:00-04:00 | 0.974 | 0.982 |
| 2021-06-17 11:05:00-04:00 | 0.975 | 0.984 |
| 2021-06-17 11:10:00-04:00 | 0.978 | 0.986 |
| 2021-06-17 11:15:00-04:00 | 0.978 | 0.987 |
| 2021-06-17 11:20:00-04:00 | 0.977 | 0.986 |
| 2021-06-17 11:25:00-04:00 | 0.978 | 0.986 |
| 2021-06-17 11:30:00-04:00 | 0.98 | 0.989 |
| 2021-06-17 11:35:00-04:00 | 0.983 | 0.992 |
| 2021-06-17 11:40:00-04:00 | 0.983 | 0.991 |
| 2021-06-17 11:45:00-04:00 | 0.984 | 0.993 |
| 2021-06-17 11:50:00-04:00 | 0.984 | 0.992 |
| 2021-06-17 11:55:00-04:00 | 0.98 | 0.989 |
| 2021-06-17 12:00:00-04:00 | 0.978 | 0.987 |
| 2021-06-17 12:05:00-04:00 | 0.98 | 0.988 |
| 2021-06-17 12:10:00-04:00 | 0.981 | 0.989 |
| 2021-06-17 12:15:00-04:00 | 0.982 | 0.99 |
| 2021-06-17 12:20:00-04:00 | 0.977 | 0.985 |
| 2021-06-17 12:25:00-04:00 | 0.974 | 0.982 |
| 2021-06-17 12:30:00-04:00 | 0.975 | 0.982 |
| 2021-06-17 12:35:00-04:00 | 0.976 | 0.982 |
| 2021-06-17 12:40:00-04:00 | 0.978 | 0.982 |
| 2021-06-17 12:45:00-04:00 | 0.978 | 0.982 |
| 2021-06-17 12:50:00-04:00 | 0.977 | 0.982 |
| 2021-06-17 12:55:00-04:00 | 0.977 | 0.982 |
| 2021-06-17 13:00:00-04:00 | 0.978 | 0.982 |
| 2021-06-17 13:05:00-04:00 | 0.979 | 0.982 |
| 2021-06-17 13:10:00-04:00 | 0.981 | 0.982 |
| 2021-06-17 13:15:00-04:00 | 0.981 | 0.982 |
| 2021-06-17 13:20:00-04:00 | 0.98 | 0.982 |
| 2021-06-17 13:25:00-04:00 | 0.981 | 0.983 |
| 2021-06-17 13:30:00-04:00 | 0.982 | 0.984 |
| 2021-06-17 13:35:00-04:00 | 0.985 | 0.986 |
| 2021-06-17 13:40:00-04:00 | 0.985 | 0.986 |
| 2021-06-17 13:45:00-04:00 | 0.988 | 0.99 |
| 2021-06-17 13:50:00-04:00 | 0.988 | 0.989 |
| 2021-06-17 13:55:00-04:00 | 0.986 | 0.987 |
| 2021-06-17 14:00:00-04:00 | 0.986 | 0.988 |
| 2021-06-17 14:05:00-04:00 | 0.985 | 0.987 |
| 2021-06-17 14:10:00-04:00 | 0.984 | 0.985 |
| 2021-06-17 14:15:00-04:00 | 0.985 | 0.987 |
| 2021-06-17 14:20:00-04:00 | 0.987 | 0.989 |
| 2021-06-17 14:25:00-04:00 | 0.988 | 0.989 |
| 2021-06-17 14:30:00-04:00 | 0.986 | 0.988 |
| 2021-06-17 14:35:00-04:00 | 0.986 | 0.988 |
| 2021-06-17 14:40:00-04:00 | 0.985 | 0.987 |
| 2021-06-17 14:45:00-04:00 | 0.984 | 0.986 |
| 2021-06-17 14:50:00-04:00 | 0.984 | 0.986 |
| 2021-06-17 14:55:00-04:00 | 0.985 | 0.987 |
| 2021-06-17 15:00:00-04:00 | 0.984 | 0.987 |
| 2021-06-17 15:05:00-04:00 | 0.985 | 0.987 |
| 2021-06-17 15:10:00-04:00 | 0.984 | 0.987 |
| 2021-06-17 15:15:00-04:00 | 0.986 | 0.987 |
| 2021-06-17 15:20:00-04:00 | 0.985 | 0.987 |
| 2021-06-17 15:25:00-04:00 | 0.984 | 0.987 |
| 2021-06-17 15:30:00-04:00 | 0.982 | 0.987 |
| 2021-06-17 15:35:00-04:00 | 0.983 | 0.987 |
| 2021-06-17 15:40:00-04:00 | 0.983 | 0.987 |
| 2021-06-17 15:45:00-04:00 | 0.984 | 0.987 |
| 2021-06-17 15:50:00-04:00 | 0.985 | 0.987 |
| 2021-06-17 15:55:00-04:00 | 0.983 | 0.987 |
| 2021-06-18 09:30:00-04:00 | 0.981 | 0.987 |
| 2021-06-18 09:35:00-04:00 | 0.976 | 0.987 |
| 2021-06-18 09:40:00-04:00 | 0.983 | 0.987 |
| 2021-06-18 09:45:00-04:00 | 0.982 | 0.987 |
| 2021-06-18 09:50:00-04:00 | 0.983 | 0.987 |
| 2021-06-18 09:55:00-04:00 | 0.98 | 0.987 |
| 2021-06-18 10:00:00-04:00 | 0.981 | 0.987 |
| 2021-06-18 10:05:00-04:00 | 0.979 | 0.987 |
| 2021-06-18 10:10:00-04:00 | 0.981 | 0.987 |
| 2021-06-18 10:15:00-04:00 | 0.979 | 0.987 |
| 2021-06-18 10:20:00-04:00 | 0.977 | 0.987 |
| 2021-06-18 10:25:00-04:00 | 0.979 | 0.987 |
| 2021-06-18 10:30:00-04:00 | 0.979 | 0.987 |
| 2021-06-18 10:35:00-04:00 | 0.98 | 0.987 |
| 2021-06-18 10:40:00-04:00 | 0.982 | 0.987 |
| 2021-06-18 10:45:00-04:00 | 0.982 | 0.987 |
| 2021-06-18 10:50:00-04:00 | 0.982 | 0.987 |
| 2021-06-18 10:55:00-04:00 | 0.98 | 0.987 |
| 2021-06-18 11:00:00-04:00 | 0.98 | 0.987 |
| 2021-06-18 11:05:00-04:00 | 0.982 | 0.989 |
| 2021-06-18 11:10:00-04:00 | 0.98 | 0.987 |
| 2021-06-18 11:15:00-04:00 | 0.977 | 0.983 |
| 2021-06-18 11:20:00-04:00 | 0.977 | 0.984 |
| 2021-06-18 11:25:00-04:00 | 0.978 | 0.984 |
| 2021-06-18 11:30:00-04:00 | 0.977 | 0.984 |
| 2021-06-18 11:35:00-04:00 | 0.979 | 0.984 |
| 2021-06-18 11:40:00-04:00 | 0.981 | 0.984 |
| 2021-06-18 11:45:00-04:00 | 0.98 | 0.984 |
| 2021-06-18 11:50:00-04:00 | 0.98 | 0.984 |
| 2021-06-18 11:55:00-04:00 | 0.981 | 0.984 |
| 2021-06-18 12:00:00-04:00 | 0.983 | 0.984 |
| 2021-06-18 12:05:00-04:00 | 0.985 | 0.986 |
| 2021-06-18 12:10:00-04:00 | 0.986 | 0.987 |
| 2021-06-18 12:15:00-04:00 | 0.986 | 0.987 |
| 2021-06-18 12:20:00-04:00 | 0.987 | 0.988 |
| 2021-06-18 12:25:00-04:00 | 0.992 | 0.993 |
| 2021-06-18 12:30:00-04:00 | 0.994 | 0.995 |
| 2021-06-18 12:35:00-04:00 | 0.993 | 0.994 |
| 2021-06-18 12:40:00-04:00 | 0.991 | 0.992 |
| 2021-06-18 12:45:00-04:00 | 0.993 | 0.994 |
| 2021-06-18 12:50:00-04:00 | 0.992 | 0.994 |
| 2021-06-18 12:55:00-04:00 | 0.997 | 0.998 |
| 2021-06-18 13:00:00-04:00 | 0.997 | 0.998 |
| 2021-06-18 13:05:00-04:00 | 0.998 | 0.999 |
| 2021-06-18 13:10:00-04:00 | 0.997 | 0.998 |
| 2021-06-18 13:15:00-04:00 | 0.999 | 1 |
| 2021-06-18 13:20:00-04:00 | 0.998 | 0.999 |
| 2021-06-18 13:25:00-04:00 | 0.995 | 0.996 |
| 2021-06-18 13:30:00-04:00 | 0.994 | 0.996 |
| 2021-06-18 13:35:00-04:00 | 0.994 | 0.995 |
| 2021-06-18 13:40:00-04:00 | 0.994 | 0.995 |
| 2021-06-18 13:45:00-04:00 | 0.993 | 0.995 |
| 2021-06-18 13:50:00-04:00 | 0.991 | 0.993 |
| 2021-06-18 13:55:00-04:00 | 0.991 | 0.992 |
| 2021-06-18 14:00:00-04:00 | 0.991 | 0.992 |
| 2021-06-18 14:05:00-04:00 | 0.992 | 0.992 |
| 2021-06-18 14:10:00-04:00 | 0.993 | 0.992 |
| 2021-06-18 14:15:00-04:00 | 0.993 | 0.992 |
| 2021-06-18 14:20:00-04:00 | 0.992 | 0.992 |
| 2021-06-18 14:25:00-04:00 | 0.99 | 0.992 |
| 2021-06-18 14:30:00-04:00 | 0.99 | 0.992 |
| 2021-06-18 14:35:00-04:00 | 0.989 | 0.992 |
| 2021-06-18 14:40:00-04:00 | 0.989 | 0.992 |
| 2021-06-18 14:45:00-04:00 | 0.985 | 0.992 |
| 2021-06-18 14:50:00-04:00 | 0.986 | 0.992 |
| 2021-06-18 14:55:00-04:00 | 0.985 | 0.992 |
| 2021-06-18 15:00:00-04:00 | 0.983 | 0.992 |
| 2021-06-18 15:05:00-04:00 | 0.984 | 0.992 |
| 2021-06-18 15:10:00-04:00 | 0.982 | 0.992 |
| 2021-06-18 15:15:00-04:00 | 0.984 | 0.992 |
| 2021-06-18 15:20:00-04:00 | 0.985 | 0.992 |
| 2021-06-18 15:25:00-04:00 | 0.987 | 0.992 |
| 2021-06-18 15:30:00-04:00 | 0.987 | 0.992 |
| 2021-06-18 15:35:00-04:00 | 0.986 | 0.992 |
| 2021-06-18 15:40:00-04:00 | 0.988 | 0.992 |
| 2021-06-18 15:45:00-04:00 | 0.99 | 0.992 |
| 2021-06-18 15:50:00-04:00 | 0.987 | 0.992 |
| 2021-06-18 15:55:00-04:00 | 0.993 | 0.999 |
| 2021-06-21 09:30:00-04:00 | 0.992 | 0.998 |
| 2021-06-21 09:35:00-04:00 | 0.986 | 0.992 |
| 2021-06-21 09:40:00-04:00 | 0.982 | 0.988 |
| 2021-06-21 09:45:00-04:00 | 0.979 | 0.985 |
| 2021-06-21 09:50:00-04:00 | 0.978 | 0.984 |
| 2021-06-21 09:55:00-04:00 | 0.978 | 0.984 |
| 2021-06-21 10:00:00-04:00 | 0.979 | 0.984 |
| 2021-06-21 10:05:00-04:00 | 0.981 | 0.984 |
| 2021-06-21 10:10:00-04:00 | 0.978 | 0.984 |
| 2021-06-21 10:15:00-04:00 | 0.974 | 0.984 |
| 2021-06-21 10:20:00-04:00 | 0.97 | 0.984 |
| 2021-06-21 10:25:00-04:00 | 0.971 | 0.984 |
| 2021-06-21 10:30:00-04:00 | 0.971 | 0.984 |
| 2021-06-21 10:35:00-04:00 | 0.974 | 0.984 |
| 2021-06-21 10:40:00-04:00 | 0.975 | 0.984 |
| 2021-06-21 10:45:00-04:00 | 0.976 | 0.984 |
| 2021-06-21 10:50:00-04:00 | 0.975 | 0.984 |
| 2021-06-21 10:55:00-04:00 | 0.979 | 0.984 |
| 2021-06-21 11:00:00-04:00 | 0.978 | 0.984 |
| 2021-06-21 11:05:00-04:00 | 0.982 | 0.984 |
| 2021-06-21 11:10:00-04:00 | 0.984 | 0.986 |
| 2021-06-21 11:15:00-04:00 | 0.983 | 0.985 |
| 2021-06-21 11:20:00-04:00 | 0.984 | 0.986 |
| 2021-06-21 11:25:00-04:00 | 0.986 | 0.988 |
| 2021-06-21 11:30:00-04:00 | 0.984 | 0.987 |
| 2021-06-21 11:35:00-04:00 | 0.981 | 0.983 |
| 2021-06-21 11:40:00-04:00 | 0.983 | 0.985 |
| 2021-06-21 11:45:00-04:00 | 0.986 | 0.989 |
| 2021-06-21 11:50:00-04:00 | 0.988 | 0.99 |
| 2021-06-21 11:55:00-04:00 | 0.985 | 0.987 |
| 2021-06-21 12:00:00-04:00 | 0.985 | 0.988 |
| 2021-06-21 12:05:00-04:00 | 0.987 | 0.989 |
| 2021-06-21 12:10:00-04:00 | 0.986 | 0.989 |
| 2021-06-21 12:15:00-04:00 | 0.986 | 0.988 |
| 2021-06-21 12:20:00-04:00 | 0.988 | 0.991 |
| 2021-06-21 12:25:00-04:00 | 0.987 | 0.989 |
| 2021-06-21 12:30:00-04:00 | 0.988 | 0.99 |
| 2021-06-21 12:35:00-04:00 | 0.988 | 0.99 |
| 2021-06-21 12:40:00-04:00 | 0.992 | 0.994 |
| 2021-06-21 12:45:00-04:00 | 0.993 | 0.996 |
| 2021-06-21 12:50:00-04:00 | 0.991 | 0.994 |
| 2021-06-21 12:55:00-04:00 | 0.991 | 0.994 |
| 2021-06-21 13:00:00-04:00 | 0.991 | 0.993 |
| 2021-06-21 13:05:00-04:00 | 0.989 | 0.991 |
| 2021-06-21 13:10:00-04:00 | 0.99 | 0.992 |
| 2021-06-21 13:15:00-04:00 | 0.989 | 0.992 |
| 2021-06-21 13:20:00-04:00 | 0.995 | 0.997 |
| 2021-06-21 13:25:00-04:00 | 0.995 | 0.997 |
| 2021-06-21 13:30:00-04:00 | 0.995 | 0.998 |
| 2021-06-21 13:35:00-04:00 | 0.996 | 0.998 |
| 2021-06-21 13:40:00-04:00 | 1 | 1.003 |
| 2021-06-21 13:45:00-04:00 | 0.998 | 1.001 |
| 2021-06-21 13:50:00-04:00 | 0.998 | 1 |
| 2021-06-21 13:55:00-04:00 | 0.999 | 1.002 |
| 2021-06-21 14:00:00-04:00 | 0.999 | 1.002 |
| 2021-06-21 14:05:00-04:00 | 1 | 1.003 |
| 2021-06-21 14:10:00-04:00 | 1.003 | 1.005 |
| 2021-06-21 14:15:00-04:00 | 1.001 | 1.003 |
| 2021-06-21 14:20:00-04:00 | 1.001 | 1.003 |
| 2021-06-21 14:25:00-04:00 | 1.001 | 1.003 |
| 2021-06-21 14:30:00-04:00 | 1.002 | 1.004 |
| 2021-06-21 14:35:00-04:00 | 1.002 | 1.004 |
| 2021-06-21 14:40:00-04:00 | 0.997 | 1 |
| 2021-06-21 14:45:00-04:00 | 0.998 | 1 |
| 2021-06-21 14:50:00-04:00 | 0.995 | 0.997 |
| 2021-06-21 14:55:00-04:00 | 0.996 | 0.998 |
| 2021-06-21 15:00:00-04:00 | 1 | 0.998 |
| 2021-06-21 15:05:00-04:00 | 0.999 | 0.998 |
| 2021-06-21 15:10:00-04:00 | 0.998 | 0.998 |
| 2021-06-21 15:15:00-04:00 | 0.995 | 0.998 |
| 2021-06-21 15:20:00-04:00 | 0.992 | 0.998 |
| 2021-06-21 15:25:00-04:00 | 0.989 | 0.998 |
| 2021-06-21 15:30:00-04:00 | 0.991 | 0.998 |
| 2021-06-21 15:35:00-04:00 | 0.991 | 0.998 |
| 2021-06-21 15:40:00-04:00 | 0.991 | 0.998 |
| 2021-06-21 15:45:00-04:00 | 0.989 | 0.998 |
| 2021-06-21 15:50:00-04:00 | 0.988 | 0.998 |
| 2021-06-21 15:55:00-04:00 | 0.989 | 0.998 |
| 2021-06-22 09:30:00-04:00 | 0.988 | 0.998 |
| 2021-06-22 09:35:00-04:00 | 0.987 | 0.998 |
| 2021-06-22 09:40:00-04:00 | 0.993 | 0.998 |
| 2021-06-22 09:45:00-04:00 | 0.985 | 0.998 |
| 2021-06-22 09:50:00-04:00 | 0.982 | 0.998 |
| 2021-06-22 09:55:00-04:00 | 0.981 | 0.998 |
| 2021-06-22 10:00:00-04:00 | 0.986 | 0.998 |
| 2021-06-22 10:05:00-04:00 | 0.989 | 0.998 |
| 2021-06-22 10:10:00-04:00 | 0.987 | 0.998 |
| 2021-06-22 10:15:00-04:00 | 0.983 | 0.998 |
| 2021-06-22 10:20:00-04:00 | 0.985 | 0.998 |
| 2021-06-22 10:25:00-04:00 | 0.985 | 0.998 |
| 2021-06-22 10:30:00-04:00 | 0.987 | 0.998 |
| 2021-06-22 10:35:00-04:00 | 0.985 | 0.998 |
| 2021-06-22 10:40:00-04:00 | 0.985 | 0.998 |
| 2021-06-22 10:45:00-04:00 | 0.983 | 0.998 |
| 2021-06-22 10:50:00-04:00 | 0.983 | 0.998 |
| 2021-06-22 10:55:00-04:00 | 0.986 | 0.998 |
| 2021-06-22 11:00:00-04:00 | 0.988 | 0.998 |
| 2021-06-22 11:05:00-04:00 | 0.991 | 1.002 |
| 2021-06-22 11:10:00-04:00 | 0.992 | 1.003 |
| 2021-06-22 11:15:00-04:00 | 0.991 | 1.002 |
| 2021-06-22 11:20:00-04:00 | 0.99 | 1 |
| 2021-06-22 11:25:00-04:00 | 0.993 | 1.004 |
| 2021-06-22 11:30:00-04:00 | 0.995 | 1.005 |
| 2021-06-22 11:35:00-04:00 | 0.995 | 1.005 |
| 2021-06-22 11:40:00-04:00 | 0.995 | 1.006 |
| 2021-06-22 11:45:00-04:00 | 0.993 | 1.004 |
| 2021-06-22 11:50:00-04:00 | 0.995 | 1.006 |
| 2021-06-22 11:55:00-04:00 | 0.996 | 1.007 |
| 2021-06-22 12:00:00-04:00 | 0.993 | 1.004 |
| 2021-06-22 12:05:00-04:00 | 0.994 | 1.004 |
| 2021-06-22 12:10:00-04:00 | 0.995 | 1.005 |
| 2021-06-22 12:15:00-04:00 | 0.997 | 1.007 |
| 2021-06-22 12:20:00-04:00 | 0.996 | 1.006 |
| 2021-06-22 12:25:00-04:00 | 0.998 | 1.008 |
| 2021-06-22 12:30:00-04:00 | 0.999 | 1.009 |
| 2021-06-22 12:35:00-04:00 | 0.998 | 1.008 |
| 2021-06-22 12:40:00-04:00 | 0.996 | 1.007 |
| 2021-06-22 12:45:00-04:00 | 0.997 | 1.008 |
| 2021-06-22 12:50:00-04:00 | 0.998 | 1.008 |
| 2021-06-22 12:55:00-04:00 | 0.998 | 1.009 |
| 2021-06-22 13:00:00-04:00 | 0.997 | 1.008 |
| 2021-06-22 13:05:00-04:00 | 0.997 | 1.007 |
| 2021-06-22 13:10:00-04:00 | 0.997 | 1.008 |
| 2021-06-22 13:15:00-04:00 | 0.996 | 1.006 |
| 2021-06-22 13:20:00-04:00 | 0.991 | 1.002 |
| 2021-06-22 13:25:00-04:00 | 0.992 | 1.003 |
| 2021-06-22 13:30:00-04:00 | 0.992 | 1.003 |
| 2021-06-22 13:35:00-04:00 | 0.991 | 1.003 |
| 2021-06-22 13:40:00-04:00 | 0.993 | 1.003 |
| 2021-06-22 13:45:00-04:00 | 0.992 | 1.003 |
| 2021-06-22 13:50:00-04:00 | 0.993 | 1.003 |
| 2021-06-22 13:55:00-04:00 | 0.994 | 1.003 |
| 2021-06-22 14:00:00-04:00 | 0.994 | 1.003 |
| 2021-06-22 14:05:00-04:00 | 0.995 | 1.003 |
| 2021-06-22 14:10:00-04:00 | 0.994 | 1.003 |
| 2021-06-22 14:15:00-04:00 | 0.995 | 1.003 |
| 2021-06-22 14:20:00-04:00 | 0.996 | 1.003 |
| 2021-06-22 14:25:00-04:00 | 0.995 | 1.002 |
| 2021-06-22 14:30:00-04:00 | 0.994 | 1.001 |
| 2021-06-22 14:35:00-04:00 | 0.992 | 0.999 |
| 2021-06-22 14:40:00-04:00 | 0.992 | 0.999 |
| 2021-06-22 14:45:00-04:00 | 0.994 | 1.001 |
| 2021-06-22 14:50:00-04:00 | 0.994 | 1.001 |
| 2021-06-22 14:55:00-04:00 | 0.995 | 1.002 |
| 2021-06-22 15:00:00-04:00 | 0.996 | 1.003 |
| 2021-06-22 15:05:00-04:00 | 0.995 | 1.003 |
| 2021-06-22 15:10:00-04:00 | 0.995 | 1.003 |
| 2021-06-22 15:15:00-04:00 | 0.996 | 1.003 |
| 2021-06-22 15:20:00-04:00 | 0.995 | 1.002 |
| 2021-06-22 15:25:00-04:00 | 0.996 | 1.003 |
| 2021-06-22 15:30:00-04:00 | 0.996 | 1.004 |
| 2021-06-22 15:35:00-04:00 | 0.999 | 1.006 |
| 2021-06-22 15:40:00-04:00 | 0.998 | 1.006 |
| 2021-06-22 15:45:00-04:00 | 0.995 | 1.002 |
| 2021-06-22 15:50:00-04:00 | 0.993 | 1 |
| 2021-06-22 15:55:00-04:00 | 0.992 | 0.999 |
| 2021-06-23 09:30:00-04:00 | 0.992 | 0.999 |
| 2021-06-23 09:35:00-04:00 | 1.016 | 1.023 |
| 2021-06-23 09:40:00-04:00 | 1.024 | 1.032 |
| 2021-06-23 09:45:00-04:00 | 1.023 | 1.03 |
| 2021-06-23 09:50:00-04:00 | 1.028 | 1.035 |
| 2021-06-23 09:55:00-04:00 | 1.028 | 1.035 |
| 2021-06-23 10:00:00-04:00 | 1.029 | 1.037 |
| 2021-06-23 10:05:00-04:00 | 1.028 | 1.035 |
| 2021-06-23 10:10:00-04:00 | 1.028 | 1.035 |
| 2021-06-23 10:15:00-04:00 | 1.032 | 1.039 |
| 2021-06-23 10:20:00-04:00 | 1.037 | 1.044 |
| 2021-06-23 10:25:00-04:00 | 1.037 | 1.044 |
| 2021-06-23 10:30:00-04:00 | 1.039 | 1.046 |
| 2021-06-23 10:35:00-04:00 | 1.043 | 1.05 |
| 2021-06-23 10:40:00-04:00 | 1.04 | 1.047 |
| 2021-06-23 10:45:00-04:00 | 1.037 | 1.044 |
| 2021-06-23 10:50:00-04:00 | 1.036 | 1.043 |
| 2021-06-23 10:55:00-04:00 | 1.035 | 1.042 |
| 2021-06-23 11:00:00-04:00 | 1.037 | 1.044 |
| 2021-06-23 11:05:00-04:00 | 1.032 | 1.039 |
| 2021-06-23 11:10:00-04:00 | 1.03 | 1.038 |
| 2021-06-23 11:15:00-04:00 | 1.033 | 1.041 |
| 2021-06-23 11:20:00-04:00 | 1.036 | 1.043 |
| 2021-06-23 11:25:00-04:00 | 1.035 | 1.043 |
| 2021-06-23 11:30:00-04:00 | 1.037 | 1.043 |
| 2021-06-23 11:35:00-04:00 | 1.034 | 1.043 |
| 2021-06-23 11:40:00-04:00 | 1.037 | 1.043 |
| 2021-06-23 11:45:00-04:00 | 1.036 | 1.043 |
| 2021-06-23 11:50:00-04:00 | 1.034 | 1.043 |
| 2021-06-23 11:55:00-04:00 | 1.036 | 1.043 |
| 2021-06-23 12:00:00-04:00 | 1.033 | 1.04 |
| 2021-06-23 12:05:00-04:00 | 1.033 | 1.04 |
| 2021-06-23 12:10:00-04:00 | 1.037 | 1.044 |
| 2021-06-23 12:15:00-04:00 | 1.037 | 1.044 |
| 2021-06-23 12:20:00-04:00 | 1.039 | 1.046 |
| 2021-06-23 12:25:00-04:00 | 1.038 | 1.045 |
| 2021-06-23 12:30:00-04:00 | 1.038 | 1.045 |
| 2021-06-23 12:35:00-04:00 | 1.038 | 1.045 |
| 2021-06-23 12:40:00-04:00 | 1.034 | 1.041 |
| 2021-06-23 12:45:00-04:00 | 1.035 | 1.043 |
| 2021-06-23 12:50:00-04:00 | 1.036 | 1.043 |
| 2021-06-23 12:55:00-04:00 | 1.036 | 1.043 |
| 2021-06-23 13:00:00-04:00 | 1.036 | 1.043 |
| 2021-06-23 13:05:00-04:00 | 1.037 | 1.044 |
| 2021-06-23 13:10:00-04:00 | 1.038 | 1.045 |
| 2021-06-23 13:15:00-04:00 | 1.038 | 1.045 |
| 2021-06-23 13:20:00-04:00 | 1.039 | 1.045 |
| 2021-06-23 13:25:00-04:00 | 1.041 | 1.047 |
| 2021-06-23 13:30:00-04:00 | 1.04 | 1.046 |
| 2021-06-23 13:35:00-04:00 | 1.04 | 1.046 |
| 2021-06-23 13:40:00-04:00 | 1.041 | 1.047 |
| 2021-06-23 13:45:00-04:00 | 1.039 | 1.045 |
| 2021-06-23 13:50:00-04:00 | 1.039 | 1.045 |
| 2021-06-23 13:55:00-04:00 | 1.039 | 1.045 |
| 2021-06-23 14:00:00-04:00 | 1.039 | 1.045 |
| 2021-06-23 14:05:00-04:00 | 1.037 | 1.043 |
| 2021-06-23 14:10:00-04:00 | 1.039 | 1.045 |
| 2021-06-23 14:15:00-04:00 | 1.038 | 1.044 |
| 2021-06-23 14:20:00-04:00 | 1.036 | 1.042 |
| 2021-06-23 14:25:00-04:00 | 1.036 | 1.042 |
| 2021-06-23 14:30:00-04:00 | 1.039 | 1.042 |
| 2021-06-23 14:35:00-04:00 | 1.039 | 1.042 |
| 2021-06-23 14:40:00-04:00 | 1.041 | 1.042 |
| 2021-06-23 14:45:00-04:00 | 1.041 | 1.042 |
| 2021-06-23 14:50:00-04:00 | 1.039 | 1.042 |
| 2021-06-23 14:55:00-04:00 | 1.04 | 1.042 |
| 2021-06-23 15:00:00-04:00 | 1.041 | 1.043 |
| 2021-06-23 15:05:00-04:00 | 1.04 | 1.043 |
| 2021-06-23 15:10:00-04:00 | 1.04 | 1.042 |
| 2021-06-23 15:15:00-04:00 | 1.04 | 1.042 |
| 2021-06-23 15:20:00-04:00 | 1.04 | 1.042 |
| 2021-06-23 15:25:00-04:00 | 1.04 | 1.043 |
| 2021-06-23 15:30:00-04:00 | 1.044 | 1.046 |
| 2021-06-23 15:35:00-04:00 | 1.043 | 1.045 |
| 2021-06-23 15:40:00-04:00 | 1.043 | 1.046 |
| 2021-06-23 15:45:00-04:00 | 1.041 | 1.044 |
| 2021-06-23 15:50:00-04:00 | 1.041 | 1.043 |
| 2021-06-23 15:55:00-04:00 | 1.044 | 1.046 |
| 2021-06-24 09:30:00-04:00 | 1.044 | 1.046 |
| 2021-06-24 09:35:00-04:00 | 1.064 | 1.066 |
| 2021-06-24 09:40:00-04:00 | 1.073 | 1.075 |
| 2021-06-24 09:45:00-04:00 | 1.068 | 1.07 |
| 2021-06-24 09:50:00-04:00 | 1.078 | 1.08 |
| 2021-06-24 09:55:00-04:00 | 1.078 | 1.081 |
| 2021-06-24 10:00:00-04:00 | 1.08 | 1.083 |
| 2021-06-24 10:05:00-04:00 | 1.079 | 1.082 |
| 2021-06-24 10:10:00-04:00 | 1.079 | 1.081 |
| 2021-06-24 10:15:00-04:00 | 1.082 | 1.085 |
| 2021-06-24 10:20:00-04:00 | 1.083 | 1.085 |
| 2021-06-24 10:25:00-04:00 | 1.085 | 1.088 |
| 2021-06-24 10:30:00-04:00 | 1.086 | 1.089 |
| 2021-06-24 10:35:00-04:00 | 1.083 | 1.086 |
| 2021-06-24 10:40:00-04:00 | 1.088 | 1.091 |
| 2021-06-24 10:45:00-04:00 | 1.087 | 1.09 |
| 2021-06-24 10:50:00-04:00 | 1.086 | 1.089 |
| 2021-06-24 10:55:00-04:00 | 1.086 | 1.089 |
| 2021-06-24 11:00:00-04:00 | 1.087 | 1.09 |
| 2021-06-24 11:05:00-04:00 | 1.091 | 1.093 |
| 2021-06-24 11:10:00-04:00 | 1.093 | 1.096 |
| 2021-06-24 11:15:00-04:00 | 1.092 | 1.094 |
| 2021-06-24 11:20:00-04:00 | 1.096 | 1.098 |
| 2021-06-24 11:25:00-04:00 | 1.096 | 1.099 |
| 2021-06-24 11:30:00-04:00 | 1.1 | 1.103 |
| 2021-06-24 11:35:00-04:00 | 1.099 | 1.102 |
| 2021-06-24 11:40:00-04:00 | 1.097 | 1.099 |
| 2021-06-24 11:45:00-04:00 | 1.096 | 1.099 |
| 2021-06-24 11:50:00-04:00 | 1.099 | 1.102 |
| 2021-06-24 11:55:00-04:00 | 1.096 | 1.099 |
| 2021-06-24 12:00:00-04:00 | 1.099 | 1.101 |
| 2021-06-24 12:05:00-04:00 | 1.098 | 1.101 |
| 2021-06-24 12:10:00-04:00 | 1.101 | 1.103 |
| 2021-06-24 12:15:00-04:00 | 1.102 | 1.104 |
| 2021-06-24 12:20:00-04:00 | 1.103 | 1.105 |
| 2021-06-24 12:25:00-04:00 | 1.102 | 1.104 |
| 2021-06-24 12:30:00-04:00 | 1.102 | 1.104 |
| 2021-06-24 12:35:00-04:00 | 1.1 | 1.102 |
| 2021-06-24 12:40:00-04:00 | 1.097 | 1.1 |
| 2021-06-24 12:45:00-04:00 | 1.101 | 1.103 |
| 2021-06-24 12:50:00-04:00 | 1.096 | 1.099 |
| 2021-06-24 12:55:00-04:00 | 1.095 | 1.098 |
| 2021-06-24 13:00:00-04:00 | 1.093 | 1.095 |
| 2021-06-24 13:05:00-04:00 | 1.096 | 1.095 |
| 2021-06-24 13:10:00-04:00 | 1.092 | 1.095 |
| 2021-06-24 13:15:00-04:00 | 1.093 | 1.095 |
| 2021-06-24 13:20:00-04:00 | 1.088 | 1.095 |
| 2021-06-24 13:25:00-04:00 | 1.091 | 1.095 |
| 2021-06-24 13:30:00-04:00 | 1.091 | 1.095 |
| 2021-06-24 13:35:00-04:00 | 1.089 | 1.095 |
| 2021-06-24 13:40:00-04:00 | 1.086 | 1.095 |
| 2021-06-24 13:45:00-04:00 | 1.083 | 1.095 |
| 2021-06-24 13:50:00-04:00 | 1.078 | 1.095 |
| 2021-06-24 13:55:00-04:00 | 1.081 | 1.095 |
| 2021-06-24 14:00:00-04:00 | 1.085 | 1.095 |
| 2021-06-24 14:05:00-04:00 | 1.085 | 1.095 |
| 2021-06-24 14:10:00-04:00 | 1.082 | 1.095 |
| 2021-06-24 14:15:00-04:00 | 1.088 | 1.095 |
| 2021-06-24 14:20:00-04:00 | 1.088 | 1.095 |
| 2021-06-24 14:25:00-04:00 | 1.089 | 1.095 |
| 2021-06-24 14:30:00-04:00 | 1.09 | 1.095 |
| 2021-06-24 14:35:00-04:00 | 1.09 | 1.095 |
| 2021-06-24 14:40:00-04:00 | 1.09 | 1.095 |
| 2021-06-24 14:45:00-04:00 | 1.09 | 1.095 |
| 2021-06-24 14:50:00-04:00 | 1.087 | 1.092 |
| 2021-06-24 14:55:00-04:00 | 1.088 | 1.093 |
| 2021-06-24 15:00:00-04:00 | 1.087 | 1.092 |
| 2021-06-24 15:05:00-04:00 | 1.084 | 1.089 |
| 2021-06-24 15:10:00-04:00 | 1.085 | 1.09 |
| 2021-06-24 15:15:00-04:00 | 1.088 | 1.093 |
| 2021-06-24 15:20:00-04:00 | 1.086 | 1.091 |
| 2021-06-24 15:25:00-04:00 | 1.085 | 1.091 |
| 2021-06-24 15:30:00-04:00 | 1.084 | 1.091 |
| 2021-06-24 15:35:00-04:00 | 1.082 | 1.091 |
| 2021-06-24 15:40:00-04:00 | 1.079 | 1.091 |
| 2021-06-24 15:45:00-04:00 | 1.081 | 1.091 |
| 2021-06-24 15:50:00-04:00 | 1.08 | 1.091 |
| 2021-06-24 15:55:00-04:00 | 1.081 | 1.091 |
| 2021-06-25 09:30:00-04:00 | 1.078 | 1.091 |
| 2021-06-25 09:35:00-04:00 | 1.095 | 1.091 |
| 2021-06-25 09:40:00-04:00 | 1.091 | 1.091 |
| 2021-06-25 09:45:00-04:00 | 1.091 | 1.091 |
| 2021-06-25 09:50:00-04:00 | 1.09 | 1.091 |
| 2021-06-25 09:55:00-04:00 | 1.085 | 1.086 |
| 2021-06-25 10:00:00-04:00 | 1.083 | 1.084 |
| 2021-06-25 10:05:00-04:00 | 1.081 | 1.082 |
| 2021-06-25 10:10:00-04:00 | 1.077 | 1.078 |
| 2021-06-25 10:15:00-04:00 | 1.08 | 1.081 |
| 2021-06-25 10:20:00-04:00 | 1.083 | 1.084 |
| 2021-06-25 10:25:00-04:00 | 1.083 | 1.084 |
| 2021-06-25 10:30:00-04:00 | 1.088 | 1.084 |
| 2021-06-25 10:35:00-04:00 | 1.087 | 1.084 |
| 2021-06-25 10:40:00-04:00 | 1.085 | 1.084 |
| 2021-06-25 10:45:00-04:00 | 1.089 | 1.084 |
| 2021-06-25 10:50:00-04:00 | 1.088 | 1.084 |
| 2021-06-25 10:55:00-04:00 | 1.086 | 1.084 |
| 2021-06-25 11:00:00-04:00 | 1.084 | 1.083 |
| 2021-06-25 11:05:00-04:00 | 1.084 | 1.083 |
| 2021-06-25 11:10:00-04:00 | 1.083 | 1.082 |
| 2021-06-25 11:15:00-04:00 | 1.084 | 1.083 |
| 2021-06-25 11:20:00-04:00 | 1.082 | 1.081 |
| 2021-06-25 11:25:00-04:00 | 1.08 | 1.079 |
| 2021-06-25 11:30:00-04:00 | 1.079 | 1.079 |
| 2021-06-25 11:35:00-04:00 | 1.083 | 1.079 |
| 2021-06-25 11:40:00-04:00 | 1.082 | 1.079 |
| 2021-06-25 11:45:00-04:00 | 1.081 | 1.079 |
| 2021-06-25 11:50:00-04:00 | 1.08 | 1.079 |
| 2021-06-25 11:55:00-04:00 | 1.079 | 1.079 |
| 2021-06-25 12:00:00-04:00 | 1.078 | 1.079 |
| 2021-06-25 12:05:00-04:00 | 1.076 | 1.079 |
| 2021-06-25 12:10:00-04:00 | 1.076 | 1.079 |
| 2021-06-25 12:15:00-04:00 | 1.073 | 1.079 |
| 2021-06-25 12:20:00-04:00 | 1.073 | 1.079 |
| 2021-06-25 12:25:00-04:00 | 1.069 | 1.079 |
| 2021-06-25 12:30:00-04:00 | 1.066 | 1.079 |
| 2021-06-25 12:35:00-04:00 | 1.071 | 1.079 |
| 2021-06-25 12:40:00-04:00 | 1.071 | 1.079 |
| 2021-06-25 12:45:00-04:00 | 1.072 | 1.079 |
| 2021-06-25 12:50:00-04:00 | 1.071 | 1.079 |
| 2021-06-25 12:55:00-04:00 | 1.072 | 1.079 |
| 2021-06-25 13:00:00-04:00 | 1.074 | 1.079 |
| 2021-06-25 13:05:00-04:00 | 1.073 | 1.079 |
| 2021-06-25 13:10:00-04:00 | 1.071 | 1.079 |
| 2021-06-25 13:15:00-04:00 | 1.069 | 1.079 |
| 2021-06-25 13:20:00-04:00 | 1.069 | 1.079 |
| 2021-06-25 13:25:00-04:00 | 1.071 | 1.079 |
| 2021-06-25 13:30:00-04:00 | 1.07 | 1.079 |
| 2021-06-25 13:35:00-04:00 | 1.067 | 1.076 |
| 2021-06-25 13:40:00-04:00 | 1.068 | 1.076 |
| 2021-06-25 13:45:00-04:00 | 1.068 | 1.076 |
| 2021-06-25 13:50:00-04:00 | 1.067 | 1.076 |
| 2021-06-25 13:55:00-04:00 | 1.066 | 1.076 |
| 2021-06-25 14:00:00-04:00 | 1.067 | 1.076 |
| 2021-06-25 14:05:00-04:00 | 1.067 | 1.076 |
| 2021-06-25 14:10:00-04:00 | 1.069 | 1.076 |
| 2021-06-25 14:15:00-04:00 | 1.069 | 1.076 |
| 2021-06-25 14:20:00-04:00 | 1.069 | 1.076 |
| 2021-06-25 14:25:00-04:00 | 1.069 | 1.076 |
| 2021-06-25 14:30:00-04:00 | 1.067 | 1.076 |
| 2021-06-25 14:35:00-04:00 | 1.067 | 1.076 |
| 2021-06-25 14:40:00-04:00 | 1.068 | 1.076 |
| 2021-06-25 14:45:00-04:00 | 1.069 | 1.076 |
| 2021-06-25 14:50:00-04:00 | 1.069 | 1.076 |
| 2021-06-25 14:55:00-04:00 | 1.071 | 1.078 |
| 2021-06-25 15:00:00-04:00 | 1.071 | 1.078 |
| 2021-06-25 15:05:00-04:00 | 1.071 | 1.078 |
| 2021-06-25 15:10:00-04:00 | 1.068 | 1.075 |
| 2021-06-25 15:15:00-04:00 | 1.066 | 1.074 |
| 2021-06-25 15:20:00-04:00 | 1.068 | 1.075 |
| 2021-06-25 15:25:00-04:00 | 1.067 | 1.074 |
| 2021-06-25 15:30:00-04:00 | 1.068 | 1.075 |
| 2021-06-25 15:35:00-04:00 | 1.065 | 1.072 |
| 2021-06-25 15:40:00-04:00 | 1.063 | 1.072 |
| 2021-06-25 15:45:00-04:00 | 1.062 | 1.072 |
| 2021-06-25 15:50:00-04:00 | 1.064 | 1.072 |
| 2021-06-25 15:55:00-04:00 | 1.066 | 1.072 |
| 2021-06-28 09:30:00-04:00 | 1.066 | 1.072 |
| 2021-06-28 09:35:00-04:00 | 1.072 | 1.072 |
| 2021-06-28 09:40:00-04:00 | 1.081 | 1.072 |
| 2021-06-28 09:45:00-04:00 | 1.081 | 1.072 |
| 2021-06-28 09:50:00-04:00 | 1.085 | 1.076 |
| 2021-06-28 09:55:00-04:00 | 1.083 | 1.075 |
| 2021-06-28 10:00:00-04:00 | 1.087 | 1.078 |
| 2021-06-28 10:05:00-04:00 | 1.09 | 1.081 |
| 2021-06-28 10:10:00-04:00 | 1.093 | 1.085 |
| 2021-06-28 10:15:00-04:00 | 1.093 | 1.084 |
| 2021-06-28 10:20:00-04:00 | 1.09 | 1.081 |
| 2021-06-28 10:25:00-04:00 | 1.091 | 1.083 |
| 2021-06-28 10:30:00-04:00 | 1.091 | 1.082 |
| 2021-06-28 10:35:00-04:00 | 1.099 | 1.09 |
| 2021-06-28 10:40:00-04:00 | 1.096 | 1.087 |
| 2021-06-28 10:45:00-04:00 | 1.093 | 1.084 |
| 2021-06-28 10:50:00-04:00 | 1.092 | 1.083 |
| 2021-06-28 10:55:00-04:00 | 1.095 | 1.086 |
| 2021-06-28 11:00:00-04:00 | 1.091 | 1.082 |
| 2021-06-28 11:05:00-04:00 | 1.091 | 1.082 |
| 2021-06-28 11:10:00-04:00 | 1.092 | 1.084 |
| 2021-06-28 11:15:00-04:00 | 1.095 | 1.087 |
| 2021-06-28 11:20:00-04:00 | 1.094 | 1.085 |
| 2021-06-28 11:25:00-04:00 | 1.096 | 1.085 |
| 2021-06-28 11:30:00-04:00 | 1.096 | 1.085 |
| 2021-06-28 11:35:00-04:00 | 1.096 | 1.086 |
| 2021-06-28 11:40:00-04:00 | 1.093 | 1.082 |
| 2021-06-28 11:45:00-04:00 | 1.092 | 1.082 |
| 2021-06-28 11:50:00-04:00 | 1.091 | 1.081 |
| 2021-06-28 11:55:00-04:00 | 1.092 | 1.081 |
| 2021-06-28 12:00:00-04:00 | 1.09 | 1.08 |
| 2021-06-28 12:05:00-04:00 | 1.091 | 1.08 |
| 2021-06-28 12:10:00-04:00 | 1.091 | 1.08 |
| 2021-06-28 12:15:00-04:00 | 1.09 | 1.08 |
| 2021-06-28 12:20:00-04:00 | 1.09 | 1.08 |
| 2021-06-28 12:25:00-04:00 | 1.091 | 1.08 |
| 2021-06-28 12:30:00-04:00 | 1.091 | 1.08 |
| 2021-06-28 12:35:00-04:00 | 1.09 | 1.08 |
| 2021-06-28 12:40:00-04:00 | 1.091 | 1.08 |
| 2021-06-28 12:45:00-04:00 | 1.093 | 1.08 |
| 2021-06-28 12:50:00-04:00 | 1.09 | 1.08 |
| 2021-06-28 12:55:00-04:00 | 1.09 | 1.08 |
| 2021-06-28 13:00:00-04:00 | 1.09 | 1.08 |
| 2021-06-28 13:05:00-04:00 | 1.089 | 1.08 |
| 2021-06-28 13:10:00-04:00 | 1.087 | 1.08 |
| 2021-06-28 13:15:00-04:00 | 1.086 | 1.08 |
| 2021-06-28 13:20:00-04:00 | 1.085 | 1.08 |
| 2021-06-28 13:25:00-04:00 | 1.086 | 1.08 |
| 2021-06-28 13:30:00-04:00 | 1.082 | 1.08 |
| 2021-06-28 13:35:00-04:00 | 1.083 | 1.08 |
| 2021-06-28 13:40:00-04:00 | 1.085 | 1.08 |
| 2021-06-28 13:45:00-04:00 | 1.086 | 1.08 |
| 2021-06-28 13:50:00-04:00 | 1.087 | 1.08 |
| 2021-06-28 13:55:00-04:00 | 1.086 | 1.08 |
| 2021-06-28 14:00:00-04:00 | 1.084 | 1.08 |
| 2021-06-28 14:05:00-04:00 | 1.083 | 1.08 |
| 2021-06-28 14:10:00-04:00 | 1.082 | 1.08 |
| 2021-06-28 14:15:00-04:00 | 1.083 | 1.08 |
| 2021-06-28 14:20:00-04:00 | 1.085 | 1.08 |
| 2021-06-28 14:25:00-04:00 | 1.085 | 1.08 |
| 2021-06-28 14:30:00-04:00 | 1.086 | 1.08 |
| 2021-06-28 14:35:00-04:00 | 1.085 | 1.08 |
| 2021-06-28 14:40:00-04:00 | 1.087 | 1.08 |
| 2021-06-28 14:45:00-04:00 | 1.088 | 1.08 |
| 2021-06-28 14:50:00-04:00 | 1.091 | 1.083 |
| 2021-06-28 14:55:00-04:00 | 1.091 | 1.083 |
| 2021-06-28 15:00:00-04:00 | 1.091 | 1.083 |
| 2021-06-28 15:05:00-04:00 | 1.092 | 1.084 |
| 2021-06-28 15:10:00-04:00 | 1.091 | 1.083 |
| 2021-06-28 15:15:00-04:00 | 1.09 | 1.082 |
| 2021-06-28 15:20:00-04:00 | 1.092 | 1.084 |
| 2021-06-28 15:25:00-04:00 | 1.093 | 1.085 |
| 2021-06-28 15:30:00-04:00 | 1.092 | 1.084 |
| 2021-06-28 15:35:00-04:00 | 1.092 | 1.084 |
| 2021-06-28 15:40:00-04:00 | 1.092 | 1.084 |
| 2021-06-28 15:45:00-04:00 | 1.093 | 1.085 |
| 2021-06-28 15:50:00-04:00 | 1.091 | 1.083 |
| 2021-06-28 15:55:00-04:00 | 1.092 | 1.084 |
| 2021-06-29 09:30:00-04:00 | 1.091 | 1.083 |
| 2021-06-29 09:35:00-04:00 | 1.082 | 1.073 |
| 2021-06-29 09:40:00-04:00 | 1.083 | 1.073 |
| 2021-06-29 09:45:00-04:00 | 1.083 | 1.073 |
| 2021-06-29 09:50:00-04:00 | 1.079 | 1.073 |
| 2021-06-29 09:55:00-04:00 | 1.084 | 1.073 |
| 2021-06-29 10:00:00-04:00 | 1.082 | 1.073 |
| 2021-06-29 10:05:00-04:00 | 1.078 | 1.073 |
| 2021-06-29 10:10:00-04:00 | 1.076 | 1.073 |
| 2021-06-29 10:15:00-04:00 | 1.075 | 1.073 |
| 2021-06-29 10:20:00-04:00 | 1.077 | 1.073 |
| 2021-06-29 10:25:00-04:00 | 1.079 | 1.073 |
| 2021-06-29 10:30:00-04:00 | 1.08 | 1.073 |
| 2021-06-29 10:35:00-04:00 | 1.082 | 1.073 |
| 2021-06-29 10:40:00-04:00 | 1.082 | 1.073 |
| 2021-06-29 10:45:00-04:00 | 1.082 | 1.073 |
| 2021-06-29 10:50:00-04:00 | 1.082 | 1.073 |
| 2021-06-29 10:55:00-04:00 | 1.081 | 1.073 |
| 2021-06-29 11:00:00-04:00 | 1.078 | 1.071 |
| 2021-06-29 11:05:00-04:00 | 1.076 | 1.069 |
| 2021-06-29 11:10:00-04:00 | 1.075 | 1.068 |
| 2021-06-29 11:15:00-04:00 | 1.076 | 1.069 |
| 2021-06-29 11:20:00-04:00 | 1.077 | 1.07 |
| 2021-06-29 11:25:00-04:00 | 1.079 | 1.071 |
| 2021-06-29 11:30:00-04:00 | 1.082 | 1.071 |
| 2021-06-29 11:35:00-04:00 | 1.081 | 1.071 |
| 2021-06-29 11:40:00-04:00 | 1.081 | 1.071 |
| 2021-06-29 11:45:00-04:00 | 1.081 | 1.071 |
| 2021-06-29 11:50:00-04:00 | 1.082 | 1.071 |
| 2021-06-29 11:55:00-04:00 | 1.079 | 1.071 |
| 2021-06-29 12:00:00-04:00 | 1.082 | 1.075 |
| 2021-06-29 12:05:00-04:00 | 1.081 | 1.074 |
| 2021-06-29 12:10:00-04:00 | 1.08 | 1.073 |
| 2021-06-29 12:15:00-04:00 | 1.081 | 1.073 |
| 2021-06-29 12:20:00-04:00 | 1.083 | 1.076 |
| 2021-06-29 12:25:00-04:00 | 1.082 | 1.074 |
| 2021-06-29 12:30:00-04:00 | 1.08 | 1.073 |
| 2021-06-29 12:35:00-04:00 | 1.079 | 1.072 |
| 2021-06-29 12:40:00-04:00 | 1.078 | 1.071 |
| 2021-06-29 12:45:00-04:00 | 1.078 | 1.071 |
| 2021-06-29 12:50:00-04:00 | 1.078 | 1.071 |
| 2021-06-29 12:55:00-04:00 | 1.077 | 1.071 |
| 2021-06-29 13:00:00-04:00 | 1.079 | 1.071 |
| 2021-06-29 13:05:00-04:00 | 1.08 | 1.071 |
| 2021-06-29 13:10:00-04:00 | 1.079 | 1.071 |
| 2021-06-29 13:15:00-04:00 | 1.077 | 1.071 |
| 2021-06-29 13:20:00-04:00 | 1.077 | 1.071 |
| 2021-06-29 13:25:00-04:00 | 1.077 | 1.071 |
| 2021-06-29 13:30:00-04:00 | 1.077 | 1.071 |
| 2021-06-29 13:35:00-04:00 | 1.078 | 1.071 |
| 2021-06-29 13:40:00-04:00 | 1.077 | 1.071 |
| 2021-06-29 13:45:00-04:00 | 1.078 | 1.071 |
| 2021-06-29 13:50:00-04:00 | 1.08 | 1.071 |
| 2021-06-29 13:55:00-04:00 | 1.079 | 1.071 |
| 2021-06-29 14:00:00-04:00 | 1.079 | 1.071 |
| 2021-06-29 14:05:00-04:00 | 1.078 | 1.069 |
| 2021-06-29 14:10:00-04:00 | 1.078 | 1.07 |
| 2021-06-29 14:15:00-04:00 | 1.079 | 1.071 |
| 2021-06-29 14:20:00-04:00 | 1.079 | 1.07 |
| 2021-06-29 14:25:00-04:00 | 1.079 | 1.07 |
| 2021-06-29 14:30:00-04:00 | 1.078 | 1.069 |
| 2021-06-29 14:35:00-04:00 | 1.077 | 1.069 |
| 2021-06-29 14:40:00-04:00 | 1.078 | 1.069 |
| 2021-06-29 14:45:00-04:00 | 1.076 | 1.068 |
| 2021-06-29 14:50:00-04:00 | 1.075 | 1.068 |
| 2021-06-29 14:55:00-04:00 | 1.076 | 1.068 |
| 2021-06-29 15:00:00-04:00 | 1.077 | 1.068 |
| 2021-06-29 15:05:00-04:00 | 1.078 | 1.068 |
| 2021-06-29 15:10:00-04:00 | 1.077 | 1.068 |
| 2021-06-29 15:15:00-04:00 | 1.079 | 1.068 |
| 2021-06-29 15:20:00-04:00 | 1.081 | 1.068 |
| 2021-06-29 15:25:00-04:00 | 1.081 | 1.068 |
| 2021-06-29 15:30:00-04:00 | 1.08 | 1.067 |
| 2021-06-29 15:35:00-04:00 | 1.081 | 1.068 |
| 2021-06-29 15:40:00-04:00 | 1.081 | 1.068 |
| 2021-06-29 15:45:00-04:00 | 1.082 | 1.069 |
| 2021-06-29 15:50:00-04:00 | 1.08 | 1.067 |
| 2021-06-29 15:55:00-04:00 | 1.079 | 1.066 |
| 2021-06-30 09:30:00-04:00 | 1.08 | 1.067 |
| 2021-06-30 09:35:00-04:00 | 1.08 | 1.067 |
| 2021-06-30 09:40:00-04:00 | 1.086 | 1.074 |
| 2021-06-30 09:45:00-04:00 | 1.088 | 1.075 |
| 2021-06-30 09:50:00-04:00 | 1.089 | 1.076 |
| 2021-06-30 09:55:00-04:00 | 1.085 | 1.072 |
| 2021-06-30 10:00:00-04:00 | 1.085 | 1.072 |
| 2021-06-30 10:05:00-04:00 | 1.087 | 1.074 |
| 2021-06-30 10:10:00-04:00 | 1.088 | 1.075 |
| 2021-06-30 10:15:00-04:00 | 1.086 | 1.073 |
| 2021-06-30 10:20:00-04:00 | 1.085 | 1.072 |
| 2021-06-30 10:25:00-04:00 | 1.088 | 1.075 |
| 2021-06-30 10:30:00-04:00 | 1.086 | 1.074 |
| 2021-06-30 10:35:00-04:00 | 1.093 | 1.08 |
| 2021-06-30 10:40:00-04:00 | 1.092 | 1.079 |
| 2021-06-30 10:45:00-04:00 | 1.092 | 1.079 |
| 2021-06-30 10:50:00-04:00 | 1.089 | 1.076 |
| 2021-06-30 10:55:00-04:00 | 1.091 | 1.078 |
| 2021-06-30 11:00:00-04:00 | 1.093 | 1.08 |
| 2021-06-30 11:05:00-04:00 | 1.094 | 1.081 |
| 2021-06-30 11:10:00-04:00 | 1.096 | 1.083 |
| 2021-06-30 11:15:00-04:00 | 1.095 | 1.082 |
| 2021-06-30 11:20:00-04:00 | 1.095 | 1.082 |
| 2021-06-30 11:25:00-04:00 | 1.094 | 1.081 |
| 2021-06-30 11:30:00-04:00 | 1.095 | 1.082 |
| 2021-06-30 11:35:00-04:00 | 1.092 | 1.079 |
| 2021-06-30 11:40:00-04:00 | 1.094 | 1.081 |
| 2021-06-30 11:45:00-04:00 | 1.091 | 1.078 |
| 2021-06-30 11:50:00-04:00 | 1.091 | 1.078 |
| 2021-06-30 11:55:00-04:00 | 1.091 | 1.078 |
| 2021-06-30 12:00:00-04:00 | 1.092 | 1.079 |
| 2021-06-30 12:05:00-04:00 | 1.088 | 1.079 |
| 2021-06-30 12:10:00-04:00 | 1.089 | 1.079 |
| 2021-06-30 12:15:00-04:00 | 1.089 | 1.079 |
| 2021-06-30 12:20:00-04:00 | 1.086 | 1.079 |
| 2021-06-30 12:25:00-04:00 | 1.083 | 1.079 |
| 2021-06-30 12:30:00-04:00 | 1.083 | 1.079 |
| 2021-06-30 12:35:00-04:00 | 1.084 | 1.079 |
| 2021-06-30 12:40:00-04:00 | 1.084 | 1.079 |
| 2021-06-30 12:45:00-04:00 | 1.084 | 1.079 |
| 2021-06-30 12:50:00-04:00 | 1.085 | 1.079 |
| 2021-06-30 12:55:00-04:00 | 1.085 | 1.079 |
| 2021-06-30 13:00:00-04:00 | 1.085 | 1.079 |
| 2021-06-30 13:05:00-04:00 | 1.086 | 1.079 |
| 2021-06-30 13:10:00-04:00 | 1.086 | 1.079 |
| 2021-06-30 13:15:00-04:00 | 1.087 | 1.079 |
| 2021-06-30 13:20:00-04:00 | 1.086 | 1.079 |
| 2021-06-30 13:25:00-04:00 | 1.086 | 1.079 |
| 2021-06-30 13:30:00-04:00 | 1.085 | 1.078 |
| 2021-06-30 13:35:00-04:00 | 1.085 | 1.077 |
| 2021-06-30 13:40:00-04:00 | 1.084 | 1.077 |
| 2021-06-30 13:45:00-04:00 | 1.084 | 1.077 |
| 2021-06-30 13:50:00-04:00 | 1.084 | 1.077 |
| 2021-06-30 13:55:00-04:00 | 1.085 | 1.078 |
| 2021-06-30 14:00:00-04:00 | 1.085 | 1.078 |
| 2021-06-30 14:05:00-04:00 | 1.084 | 1.078 |
| 2021-06-30 14:10:00-04:00 | 1.082 | 1.078 |
| 2021-06-30 14:15:00-04:00 | 1.083 | 1.078 |
| 2021-06-30 14:20:00-04:00 | 1.084 | 1.078 |
| 2021-06-30 14:25:00-04:00 | 1.084 | 1.078 |
| 2021-06-30 14:30:00-04:00 | 1.084 | 1.078 |
| 2021-06-30 14:35:00-04:00 | 1.087 | 1.078 |
| 2021-06-30 14:40:00-04:00 | 1.086 | 1.078 |
| 2021-06-30 14:45:00-04:00 | 1.086 | 1.078 |
| 2021-06-30 14:50:00-04:00 | 1.085 | 1.078 |
| 2021-06-30 14:55:00-04:00 | 1.085 | 1.078 |
| 2021-06-30 15:00:00-04:00 | 1.085 | 1.078 |
| 2021-06-30 15:05:00-04:00 | 1.085 | 1.078 |
| 2021-06-30 15:10:00-04:00 | 1.085 | 1.078 |
| 2021-06-30 15:15:00-04:00 | 1.084 | 1.077 |
| 2021-06-30 15:20:00-04:00 | 1.083 | 1.076 |
| 2021-06-30 15:25:00-04:00 | 1.082 | 1.075 |
| 2021-06-30 15:30:00-04:00 | 1.083 | 1.075 |
| 2021-06-30 15:35:00-04:00 | 1.081 | 1.075 |
| 2021-06-30 15:40:00-04:00 | 1.08 | 1.075 |
| 2021-06-30 15:45:00-04:00 | 1.08 | 1.075 |
| 2021-06-30 15:50:00-04:00 | 1.078 | 1.075 |
| 2021-06-30 15:55:00-04:00 | 1.081 | 1.075 |
| 2021-07-01 09:30:00-04:00 | 1.079 | 1.075 |
| 2021-07-01 09:35:00-04:00 | 1.087 | 1.075 |
| 2021-07-01 09:40:00-04:00 | 1.085 | 1.075 |
| 2021-07-01 09:45:00-04:00 | 1.08 | 1.075 |
| 2021-07-01 09:50:00-04:00 | 1.077 | 1.075 |
| 2021-07-01 09:55:00-04:00 | 1.077 | 1.075 |
| 2021-07-01 10:00:00-04:00 | 1.077 | 1.075 |
| 2021-07-01 10:05:00-04:00 | 1.079 | 1.075 |
| 2021-07-01 10:10:00-04:00 | 1.077 | 1.075 |
| 2021-07-01 10:15:00-04:00 | 1.075 | 1.075 |
| 2021-07-01 10:20:00-04:00 | 1.07 | 1.075 |
| 2021-07-01 10:25:00-04:00 | 1.076 | 1.075 |
| 2021-07-01 10:30:00-04:00 | 1.079 | 1.075 |
| 2021-07-01 10:35:00-04:00 | 1.08 | 1.075 |
| 2021-07-01 10:40:00-04:00 | 1.08 | 1.075 |
| 2021-07-01 10:45:00-04:00 | 1.084 | 1.075 |
| 2021-07-01 10:50:00-04:00 | 1.079 | 1.075 |
| 2021-07-01 10:55:00-04:00 | 1.08 | 1.075 |
| 2021-07-01 11:00:00-04:00 | 1.083 | 1.078 |
| 2021-07-01 11:05:00-04:00 | 1.08 | 1.075 |
| 2021-07-01 11:10:00-04:00 | 1.077 | 1.072 |
| 2021-07-01 11:15:00-04:00 | 1.076 | 1.071 |
| 2021-07-01 11:20:00-04:00 | 1.076 | 1.071 |
| 2021-07-01 11:25:00-04:00 | 1.076 | 1.071 |
| 2021-07-01 11:30:00-04:00 | 1.077 | 1.072 |
| 2021-07-01 11:35:00-04:00 | 1.079 | 1.074 |
| 2021-07-01 11:40:00-04:00 | 1.078 | 1.074 |
| 2021-07-01 11:45:00-04:00 | 1.079 | 1.074 |
| 2021-07-01 11:50:00-04:00 | 1.082 | 1.074 |
| 2021-07-01 11:55:00-04:00 | 1.082 | 1.074 |
| 2021-07-01 12:00:00-04:00 | 1.081 | 1.074 |
| 2021-07-01 12:05:00-04:00 | 1.079 | 1.074 |
| 2021-07-01 12:10:00-04:00 | 1.079 | 1.074 |
| 2021-07-01 12:15:00-04:00 | 1.079 | 1.074 |
| 2021-07-01 12:20:00-04:00 | 1.077 | 1.071 |
| 2021-07-01 12:25:00-04:00 | 1.077 | 1.072 |
| 2021-07-01 12:30:00-04:00 | 1.078 | 1.072 |
| 2021-07-01 12:35:00-04:00 | 1.078 | 1.072 |
| 2021-07-01 12:40:00-04:00 | 1.076 | 1.072 |
| 2021-07-01 12:45:00-04:00 | 1.076 | 1.072 |
| 2021-07-01 12:50:00-04:00 | 1.076 | 1.072 |
| 2021-07-01 12:55:00-04:00 | 1.074 | 1.072 |
| 2021-07-01 13:00:00-04:00 | 1.073 | 1.072 |
| 2021-07-01 13:05:00-04:00 | 1.074 | 1.072 |
| 2021-07-01 13:10:00-04:00 | 1.075 | 1.072 |
| 2021-07-01 13:15:00-04:00 | 1.073 | 1.072 |
| 2021-07-01 13:20:00-04:00 | 1.073 | 1.072 |
| 2021-07-01 13:25:00-04:00 | 1.075 | 1.072 |
| 2021-07-01 13:30:00-04:00 | 1.074 | 1.072 |
| 2021-07-01 13:35:00-04:00 | 1.075 | 1.072 |
| 2021-07-01 13:40:00-04:00 | 1.075 | 1.072 |
| 2021-07-01 13:45:00-04:00 | 1.073 | 1.072 |
| 2021-07-01 13:50:00-04:00 | 1.071 | 1.072 |
| 2021-07-01 13:55:00-04:00 | 1.071 | 1.072 |
| 2021-07-01 14:00:00-04:00 | 1.072 | 1.072 |
| 2021-07-01 14:05:00-04:00 | 1.072 | 1.072 |
| 2021-07-01 14:10:00-04:00 | 1.074 | 1.072 |
| 2021-07-01 14:15:00-04:00 | 1.074 | 1.072 |
| 2021-07-01 14:20:00-04:00 | 1.073 | 1.072 |
| 2021-07-01 14:25:00-04:00 | 1.074 | 1.072 |
| 2021-07-01 14:30:00-04:00 | 1.074 | 1.072 |
| 2021-07-01 14:35:00-04:00 | 1.073 | 1.072 |
| 2021-07-01 14:40:00-04:00 | 1.071 | 1.072 |
| 2021-07-01 14:45:00-04:00 | 1.071 | 1.072 |
| 2021-07-01 14:50:00-04:00 | 1.073 | 1.074 |
| 2021-07-01 14:55:00-04:00 | 1.073 | 1.074 |
| 2021-07-01 15:00:00-04:00 | 1.072 | 1.074 |
| 2021-07-01 15:05:00-04:00 | 1.074 | 1.074 |
| 2021-07-01 15:10:00-04:00 | 1.076 | 1.074 |
| 2021-07-01 15:15:00-04:00 | 1.077 | 1.074 |
| 2021-07-01 15:20:00-04:00 | 1.077 | 1.074 |
| 2021-07-01 15:25:00-04:00 | 1.076 | 1.073 |
| 2021-07-01 15:30:00-04:00 | 1.075 | 1.073 |
| 2021-07-01 15:35:00-04:00 | 1.078 | 1.075 |
| 2021-07-01 15:40:00-04:00 | 1.076 | 1.074 |
| 2021-07-01 15:45:00-04:00 | 1.072 | 1.07 |
| 2021-07-01 15:50:00-04:00 | 1.072 | 1.07 |
| 2021-07-01 15:55:00-04:00 | 1.073 | 1.071 |
| 2021-07-02 09:30:00-04:00 | 1.076 | 1.073 |
| 2021-07-02 09:35:00-04:00 | 1.089 | 1.086 |
| 2021-07-02 09:40:00-04:00 | 1.104 | 1.102 |
| 2021-07-02 09:45:00-04:00 | 1.1 | 1.098 |
| 2021-07-02 09:50:00-04:00 | 1.103 | 1.1 |
| 2021-07-02 09:55:00-04:00 | 1.094 | 1.092 |
| 2021-07-02 10:00:00-04:00 | 1.092 | 1.089 |
| 2021-07-02 10:05:00-04:00 | 1.089 | 1.087 |
| 2021-07-02 10:10:00-04:00 | 1.086 | 1.083 |
| 2021-07-02 10:15:00-04:00 | 1.085 | 1.083 |
| 2021-07-02 10:20:00-04:00 | 1.089 | 1.086 |
| 2021-07-02 10:25:00-04:00 | 1.09 | 1.087 |
| 2021-07-02 10:30:00-04:00 | 1.089 | 1.086 |
| 2021-07-02 10:35:00-04:00 | 1.084 | 1.081 |
| 2021-07-02 10:40:00-04:00 | 1.084 | 1.081 |
| 2021-07-02 10:45:00-04:00 | 1.079 | 1.081 |
| 2021-07-02 10:50:00-04:00 | 1.079 | 1.081 |
| 2021-07-02 10:55:00-04:00 | 1.075 | 1.081 |
| 2021-07-02 11:00:00-04:00 | 1.072 | 1.081 |
| 2021-07-02 11:05:00-04:00 | 1.077 | 1.081 |
| 2021-07-02 11:10:00-04:00 | 1.079 | 1.081 |
| 2021-07-02 11:15:00-04:00 | 1.078 | 1.081 |
| 2021-07-02 11:20:00-04:00 | 1.077 | 1.081 |
| 2021-07-02 11:25:00-04:00 | 1.076 | 1.081 |
| 2021-07-02 11:30:00-04:00 | 1.075 | 1.081 |
| 2021-07-02 11:35:00-04:00 | 1.076 | 1.081 |
| 2021-07-02 11:40:00-04:00 | 1.079 | 1.081 |
| 2021-07-02 11:45:00-04:00 | 1.081 | 1.081 |
| 2021-07-02 11:50:00-04:00 | 1.081 | 1.081 |
| 2021-07-02 11:55:00-04:00 | 1.08 | 1.081 |
| 2021-07-02 12:00:00-04:00 | 1.078 | 1.079 |
| 2021-07-02 12:05:00-04:00 | 1.078 | 1.079 |
| 2021-07-02 12:10:00-04:00 | 1.077 | 1.079 |
| 2021-07-02 12:15:00-04:00 | 1.078 | 1.08 |
| 2021-07-02 12:20:00-04:00 | 1.077 | 1.078 |
| 2021-07-02 12:25:00-04:00 | 1.075 | 1.076 |
| 2021-07-02 12:30:00-04:00 | 1.075 | 1.076 |
| 2021-07-02 12:35:00-04:00 | 1.075 | 1.076 |
| 2021-07-02 12:40:00-04:00 | 1.075 | 1.076 |
| 2021-07-02 12:45:00-04:00 | 1.074 | 1.076 |
| 2021-07-02 12:50:00-04:00 | 1.073 | 1.076 |
| 2021-07-02 12:55:00-04:00 | 1.073 | 1.076 |
| 2021-07-02 13:00:00-04:00 | 1.074 | 1.076 |
| 2021-07-02 13:05:00-04:00 | 1.076 | 1.076 |
| 2021-07-02 13:10:00-04:00 | 1.079 | 1.076 |
| 2021-07-02 13:15:00-04:00 | 1.08 | 1.076 |
| 2021-07-02 13:20:00-04:00 | 1.079 | 1.076 |
| 2021-07-02 13:25:00-04:00 | 1.081 | 1.076 |
| 2021-07-02 13:30:00-04:00 | 1.081 | 1.077 |
| 2021-07-02 13:35:00-04:00 | 1.08 | 1.076 |
| 2021-07-02 13:40:00-04:00 | 1.08 | 1.076 |
| 2021-07-02 13:45:00-04:00 | 1.081 | 1.077 |
| 2021-07-02 13:50:00-04:00 | 1.081 | 1.077 |
| 2021-07-02 13:55:00-04:00 | 1.08 | 1.076 |
| 2021-07-02 14:00:00-04:00 | 1.078 | 1.074 |
| 2021-07-02 14:05:00-04:00 | 1.078 | 1.073 |
| 2021-07-02 14:10:00-04:00 | 1.078 | 1.074 |
| 2021-07-02 14:15:00-04:00 | 1.077 | 1.073 |
| 2021-07-02 14:20:00-04:00 | 1.077 | 1.073 |
| 2021-07-02 14:25:00-04:00 | 1.076 | 1.073 |
| 2021-07-02 14:30:00-04:00 | 1.077 | 1.073 |
| 2021-07-02 14:35:00-04:00 | 1.074 | 1.073 |
| 2021-07-02 14:40:00-04:00 | 1.077 | 1.073 |
| 2021-07-02 14:45:00-04:00 | 1.077 | 1.073 |
| 2021-07-02 14:50:00-04:00 | 1.079 | 1.073 |
| 2021-07-02 14:55:00-04:00 | 1.077 | 1.073 |
| 2021-07-02 15:00:00-04:00 | 1.078 | 1.073 |
| 2021-07-02 15:05:00-04:00 | 1.076 | 1.073 |
| 2021-07-02 15:10:00-04:00 | 1.076 | 1.073 |
| 2021-07-02 15:15:00-04:00 | 1.076 | 1.073 |
| 2021-07-02 15:20:00-04:00 | 1.075 | 1.073 |
| 2021-07-02 15:25:00-04:00 | 1.075 | 1.073 |
| 2021-07-02 15:30:00-04:00 | 1.076 | 1.073 |
| 2021-07-02 15:35:00-04:00 | 1.078 | 1.073 |
| 2021-07-02 15:40:00-04:00 | 1.077 | 1.073 |
| 2021-07-02 15:45:00-04:00 | 1.074 | 1.073 |
| 2021-07-02 15:50:00-04:00 | 1.074 | 1.073 |
| 2021-07-02 15:55:00-04:00 | 1.076 | 1.073 |
| 2021-07-06 09:30:00-04:00 | 1.077 | 1.073 |
| 2021-07-06 09:35:00-04:00 | 1.075 | 1.073 |
| 2021-07-06 09:40:00-04:00 | 1.071 | 1.073 |
| 2021-07-06 09:45:00-04:00 | 1.058 | 1.073 |
| 2021-07-06 09:50:00-04:00 | 1.055 | 1.073 |
| 2021-07-06 09:55:00-04:00 | 1.049 | 1.073 |
| 2021-07-06 10:00:00-04:00 | 1.053 | 1.073 |
| 2021-07-06 10:05:00-04:00 | 1.051 | 1.073 |
| 2021-07-06 10:10:00-04:00 | 1.053 | 1.073 |
| 2021-07-06 10:15:00-04:00 | 1.053 | 1.073 |
| 2021-07-06 10:20:00-04:00 | 1.055 | 1.073 |
| 2021-07-06 10:25:00-04:00 | 1.056 | 1.073 |
| 2021-07-06 10:30:00-04:00 | 1.057 | 1.073 |
| 2021-07-06 10:35:00-04:00 | 1.053 | 1.073 |
| 2021-07-06 10:40:00-04:00 | 1.053 | 1.073 |
| 2021-07-06 10:45:00-04:00 | 1.056 | 1.073 |
| 2021-07-06 10:50:00-04:00 | 1.057 | 1.073 |
| 2021-07-06 10:55:00-04:00 | 1.059 | 1.073 |
| 2021-07-06 11:00:00-04:00 | 1.055 | 1.068 |
| 2021-07-06 11:05:00-04:00 | 1.054 | 1.068 |
| 2021-07-06 11:10:00-04:00 | 1.055 | 1.069 |
| 2021-07-06 11:15:00-04:00 | 1.053 | 1.066 |
| 2021-07-06 11:20:00-04:00 | 1.052 | 1.065 |
| 2021-07-06 11:25:00-04:00 | 1.053 | 1.066 |
| 2021-07-06 11:30:00-04:00 | 1.052 | 1.065 |
| 2021-07-06 11:35:00-04:00 | 1.052 | 1.065 |
| 2021-07-06 11:40:00-04:00 | 1.052 | 1.065 |
| 2021-07-06 11:45:00-04:00 | 1.048 | 1.065 |
| 2021-07-06 11:50:00-04:00 | 1.048 | 1.065 |
| 2021-07-06 11:55:00-04:00 | 1.045 | 1.065 |
| 2021-07-06 12:00:00-04:00 | 1.046 | 1.065 |
| 2021-07-06 12:05:00-04:00 | 1.041 | 1.065 |
| 2021-07-06 12:10:00-04:00 | 1.039 | 1.065 |
| 2021-07-06 12:15:00-04:00 | 1.04 | 1.065 |
| 2021-07-06 12:20:00-04:00 | 1.037 | 1.065 |
| 2021-07-06 12:25:00-04:00 | 1.04 | 1.065 |
| 2021-07-06 12:30:00-04:00 | 1.041 | 1.065 |
| 2021-07-06 12:35:00-04:00 | 1.042 | 1.065 |
| 2021-07-06 12:40:00-04:00 | 1.039 | 1.065 |
| 2021-07-06 12:45:00-04:00 | 1.039 | 1.065 |
| 2021-07-06 12:50:00-04:00 | 1.04 | 1.065 |
| 2021-07-06 12:55:00-04:00 | 1.041 | 1.065 |
| 2021-07-06 13:00:00-04:00 | 1.041 | 1.065 |
| 2021-07-06 13:05:00-04:00 | 1.04 | 1.065 |
| 2021-07-06 13:10:00-04:00 | 1.043 | 1.065 |
| 2021-07-06 13:15:00-04:00 | 1.042 | 1.065 |
| 2021-07-06 13:20:00-04:00 | 1.044 | 1.067 |
| 2021-07-06 13:25:00-04:00 | 1.043 | 1.066 |
| 2021-07-06 13:30:00-04:00 | 1.045 | 1.068 |
| 2021-07-06 13:35:00-04:00 | 1.043 | 1.066 |
| 2021-07-06 13:40:00-04:00 | 1.042 | 1.065 |
| 2021-07-06 13:45:00-04:00 | 1.046 | 1.069 |
| 2021-07-06 13:50:00-04:00 | 1.045 | 1.068 |
| 2021-07-06 13:55:00-04:00 | 1.045 | 1.068 |
| 2021-07-06 14:00:00-04:00 | 1.044 | 1.067 |
| 2021-07-06 14:05:00-04:00 | 1.043 | 1.066 |
| 2021-07-06 14:10:00-04:00 | 1.042 | 1.065 |
| 2021-07-06 14:15:00-04:00 | 1.042 | 1.066 |
| 2021-07-06 14:20:00-04:00 | 1.044 | 1.068 |
| 2021-07-06 14:25:00-04:00 | 1.045 | 1.069 |
| 2021-07-06 14:30:00-04:00 | 1.043 | 1.067 |
| 2021-07-06 14:35:00-04:00 | 1.044 | 1.067 |
| 2021-07-06 14:40:00-04:00 | 1.042 | 1.067 |
| 2021-07-06 14:45:00-04:00 | 1.042 | 1.067 |
| 2021-07-06 14:50:00-04:00 | 1.041 | 1.067 |
| 2021-07-06 14:55:00-04:00 | 1.04 | 1.067 |
| 2021-07-06 15:00:00-04:00 | 1.041 | 1.067 |
| 2021-07-06 15:05:00-04:00 | 1.041 | 1.067 |
| 2021-07-06 15:10:00-04:00 | 1.041 | 1.067 |
| 2021-07-06 15:15:00-04:00 | 1.045 | 1.067 |
| 2021-07-06 15:20:00-04:00 | 1.046 | 1.067 |
| 2021-07-06 15:25:00-04:00 | 1.044 | 1.067 |
| 2021-07-06 15:30:00-04:00 | 1.045 | 1.067 |
| 2021-07-06 15:35:00-04:00 | 1.045 | 1.067 |
| 2021-07-06 15:40:00-04:00 | 1.046 | 1.068 |
| 2021-07-06 15:45:00-04:00 | 1.048 | 1.07 |
| 2021-07-06 15:50:00-04:00 | 1.048 | 1.071 |
| 2021-07-06 15:55:00-04:00 | 1.049 | 1.071 |
| 2021-07-07 09:30:00-04:00 | 1.048 | 1.071 |
| 2021-07-07 09:35:00-04:00 | 1.046 | 1.068 |
| 2021-07-07 09:40:00-04:00 | 1.044 | 1.066 |
| 2021-07-07 09:45:00-04:00 | 1.046 | 1.069 |
| 2021-07-07 09:50:00-04:00 | 1.04 | 1.063 |
| 2021-07-07 09:55:00-04:00 | 1.042 | 1.065 |
| 2021-07-07 10:00:00-04:00 | 1.039 | 1.062 |
| 2021-07-07 10:05:00-04:00 | 1.032 | 1.062 |
| 2021-07-07 10:10:00-04:00 | 1.033 | 1.062 |
| 2021-07-07 10:15:00-04:00 | 1.035 | 1.062 |
| 2021-07-07 10:20:00-04:00 | 1.033 | 1.062 |
| 2021-07-07 10:25:00-04:00 | 1.03 | 1.062 |
| 2021-07-07 10:30:00-04:00 | 1.024 | 1.062 |
| 2021-07-07 10:35:00-04:00 | 1.026 | 1.062 |
| 2021-07-07 10:40:00-04:00 | 1.02 | 1.062 |
| 2021-07-07 10:45:00-04:00 | 1.017 | 1.062 |
| 2021-07-07 10:50:00-04:00 | 1.022 | 1.062 |
| 2021-07-07 10:55:00-04:00 | 1.023 | 1.062 |
| 2021-07-07 11:00:00-04:00 | 1.024 | 1.062 |
| 2021-07-07 11:05:00-04:00 | 1.025 | 1.062 |
| 2021-07-07 11:10:00-04:00 | 1.022 | 1.062 |
| 2021-07-07 11:15:00-04:00 | 1.025 | 1.062 |
| 2021-07-07 11:20:00-04:00 | 1.027 | 1.062 |
| 2021-07-07 11:25:00-04:00 | 1.024 | 1.062 |
| 2021-07-07 11:30:00-04:00 | 1.025 | 1.062 |
| 2021-07-07 11:35:00-04:00 | 1.022 | 1.062 |
| 2021-07-07 11:40:00-04:00 | 1.024 | 1.064 |
| 2021-07-07 11:45:00-04:00 | 1.028 | 1.068 |
| 2021-07-07 11:50:00-04:00 | 1.03 | 1.071 |
| 2021-07-07 11:55:00-04:00 | 1.03 | 1.07 |
| 2021-07-07 12:00:00-04:00 | 1.029 | 1.07 |
| 2021-07-07 12:05:00-04:00 | 1.029 | 1.069 |
| 2021-07-07 12:10:00-04:00 | 1.027 | 1.067 |
| 2021-07-07 12:15:00-04:00 | 1.027 | 1.067 |
| 2021-07-07 12:20:00-04:00 | 1.026 | 1.066 |
| 2021-07-07 12:25:00-04:00 | 1.026 | 1.066 |
| 2021-07-07 12:30:00-04:00 | 1.027 | 1.067 |
| 2021-07-07 12:35:00-04:00 | 1.025 | 1.065 |
| 2021-07-07 12:40:00-04:00 | 1.028 | 1.068 |
| 2021-07-07 12:45:00-04:00 | 1.027 | 1.067 |
| 2021-07-07 12:50:00-04:00 | 1.026 | 1.067 |
| 2021-07-07 12:55:00-04:00 | 1.024 | 1.067 |
| 2021-07-07 13:00:00-04:00 | 1.025 | 1.067 |
| 2021-07-07 13:05:00-04:00 | 1.022 | 1.067 |
| 2021-07-07 13:10:00-04:00 | 1.023 | 1.067 |
| 2021-07-07 13:15:00-04:00 | 1.023 | 1.067 |
| 2021-07-07 13:20:00-04:00 | 1.024 | 1.067 |
| 2021-07-07 13:25:00-04:00 | 1.025 | 1.067 |
| 2021-07-07 13:30:00-04:00 | 1.025 | 1.067 |
| 2021-07-07 13:35:00-04:00 | 1.024 | 1.067 |
| 2021-07-07 13:40:00-04:00 | 1.024 | 1.067 |
| 2021-07-07 13:45:00-04:00 | 1.025 | 1.067 |
| 2021-07-07 13:50:00-04:00 | 1.024 | 1.067 |
| 2021-07-07 13:55:00-04:00 | 1.025 | 1.067 |
| 2021-07-07 14:00:00-04:00 | 1.027 | 1.067 |
| 2021-07-07 14:05:00-04:00 | 1.03 | 1.07 |
| 2021-07-07 14:10:00-04:00 | 1.031 | 1.072 |
| 2021-07-07 14:15:00-04:00 | 1.028 | 1.068 |
| 2021-07-07 14:20:00-04:00 | 1.028 | 1.068 |
| 2021-07-07 14:25:00-04:00 | 1.026 | 1.067 |
| 2021-07-07 14:30:00-04:00 | 1.027 | 1.067 |
| 2021-07-07 14:35:00-04:00 | 1.025 | 1.065 |
| 2021-07-07 14:40:00-04:00 | 1.023 | 1.063 |
| 2021-07-07 14:45:00-04:00 | 1.024 | 1.064 |
| 2021-07-07 14:50:00-04:00 | 1.024 | 1.064 |
| 2021-07-07 14:55:00-04:00 | 1.024 | 1.064 |
| 2021-07-07 15:00:00-04:00 | 1.026 | 1.064 |
| 2021-07-07 15:05:00-04:00 | 1.027 | 1.064 |
| 2021-07-07 15:10:00-04:00 | 1.027 | 1.064 |
| 2021-07-07 15:15:00-04:00 | 1.027 | 1.064 |
| 2021-07-07 15:20:00-04:00 | 1.028 | 1.064 |
| 2021-07-07 15:25:00-04:00 | 1.025 | 1.064 |
| 2021-07-07 15:30:00-04:00 | 1.025 | 1.064 |
| 2021-07-07 15:35:00-04:00 | 1.026 | 1.065 |
| 2021-07-07 15:40:00-04:00 | 1.025 | 1.064 |
| 2021-07-07 15:45:00-04:00 | 1.026 | 1.065 |
| 2021-07-07 15:50:00-04:00 | 1.027 | 1.066 |
| 2021-07-07 15:55:00-04:00 | 1.027 | 1.066 |
| 2021-07-08 09:30:00-04:00 | 1.026 | 1.065 |
| 2021-07-08 09:35:00-04:00 | 1.008 | 1.047 |
| 2021-07-08 09:40:00-04:00 | 1.011 | 1.047 |
| 2021-07-08 09:45:00-04:00 | 1.009 | 1.047 |
| 2021-07-08 09:50:00-04:00 | 0.995 | 1.047 |
| 2021-07-08 09:55:00-04:00 | 1 | 1.047 |
| 2021-07-08 10:00:00-04:00 | 1.004 | 1.047 |
| 2021-07-08 10:05:00-04:00 | 1.005 | 1.047 |
| 2021-07-08 10:10:00-04:00 | 1.004 | 1.047 |
| 2021-07-08 10:15:00-04:00 | 1.008 | 1.047 |
| 2021-07-08 10:20:00-04:00 | 1.012 | 1.047 |
| 2021-07-08 10:25:00-04:00 | 1.01 | 1.047 |
| 2021-07-08 10:30:00-04:00 | 1.017 | 1.047 |
| 2021-07-08 10:35:00-04:00 | 1.015 | 1.047 |
| 2021-07-08 10:40:00-04:00 | 1.013 | 1.047 |
| 2021-07-08 10:45:00-04:00 | 1.019 | 1.053 |
| 2021-07-08 10:50:00-04:00 | 1.014 | 1.048 |
| 2021-07-08 10:55:00-04:00 | 1.015 | 1.049 |
| 2021-07-08 11:00:00-04:00 | 1.011 | 1.045 |
| 2021-07-08 11:05:00-04:00 | 1.012 | 1.046 |
| 2021-07-08 11:10:00-04:00 | 1.016 | 1.05 |
| 2021-07-08 11:15:00-04:00 | 1.017 | 1.05 |
| 2021-07-08 11:20:00-04:00 | 1.014 | 1.048 |
| 2021-07-08 11:25:00-04:00 | 1.015 | 1.049 |
| 2021-07-08 11:30:00-04:00 | 1.017 | 1.05 |
| 2021-07-08 11:35:00-04:00 | 1.015 | 1.049 |
| 2021-07-08 11:40:00-04:00 | 1.02 | 1.054 |
| 2021-07-08 11:45:00-04:00 | 1.02 | 1.053 |
| 2021-07-08 11:50:00-04:00 | 1.02 | 1.054 |
| 2021-07-08 11:55:00-04:00 | 1.023 | 1.057 |
| 2021-07-08 12:00:00-04:00 | 1.023 | 1.057 |
| 2021-07-08 12:05:00-04:00 | 1.027 | 1.061 |
| 2021-07-08 12:10:00-04:00 | 1.026 | 1.06 |
| 2021-07-08 12:15:00-04:00 | 1.022 | 1.056 |
| 2021-07-08 12:20:00-04:00 | 1.024 | 1.058 |
| 2021-07-08 12:25:00-04:00 | 1.024 | 1.058 |
| 2021-07-08 12:30:00-04:00 | 1.026 | 1.06 |
| 2021-07-08 12:35:00-04:00 | 1.03 | 1.064 |
| 2021-07-08 12:40:00-04:00 | 1.03 | 1.064 |
| 2021-07-08 12:45:00-04:00 | 1.031 | 1.065 |
| 2021-07-08 12:50:00-04:00 | 1.027 | 1.061 |
| 2021-07-08 12:55:00-04:00 | 1.03 | 1.064 |
| 2021-07-08 13:00:00-04:00 | 1.028 | 1.062 |
| 2021-07-08 13:05:00-04:00 | 1.029 | 1.063 |
| 2021-07-08 13:10:00-04:00 | 1.032 | 1.066 |
| 2021-07-08 13:15:00-04:00 | 1.03 | 1.064 |
| 2021-07-08 13:20:00-04:00 | 1.03 | 1.064 |
| 2021-07-08 13:25:00-04:00 | 1.032 | 1.065 |
| 2021-07-08 13:30:00-04:00 | 1.033 | 1.067 |
| 2021-07-08 13:35:00-04:00 | 1.035 | 1.069 |
| 2021-07-08 13:40:00-04:00 | 1.035 | 1.069 |
| 2021-07-08 13:45:00-04:00 | 1.033 | 1.067 |
| 2021-07-08 13:50:00-04:00 | 1.033 | 1.066 |
| 2021-07-08 13:55:00-04:00 | 1.031 | 1.065 |
| 2021-07-08 14:00:00-04:00 | 1.031 | 1.065 |
| 2021-07-08 14:05:00-04:00 | 1.03 | 1.064 |
| 2021-07-08 14:10:00-04:00 | 1.03 | 1.064 |
| 2021-07-08 14:15:00-04:00 | 1.033 | 1.067 |
| 2021-07-08 14:20:00-04:00 | 1.03 | 1.064 |
| 2021-07-08 14:25:00-04:00 | 1.029 | 1.064 |
| 2021-07-08 14:30:00-04:00 | 1.03 | 1.064 |
| 2021-07-08 14:35:00-04:00 | 1.031 | 1.064 |
| 2021-07-08 14:40:00-04:00 | 1.031 | 1.064 |
| 2021-07-08 14:45:00-04:00 | 1.033 | 1.064 |
| 2021-07-08 14:50:00-04:00 | 1.031 | 1.064 |
| 2021-07-08 14:55:00-04:00 | 1.03 | 1.064 |
| 2021-07-08 15:00:00-04:00 | 1.033 | 1.064 |
| 2021-07-08 15:05:00-04:00 | 1.034 | 1.064 |
| 2021-07-08 15:10:00-04:00 | 1.033 | 1.062 |
| 2021-07-08 15:15:00-04:00 | 1.03 | 1.06 |
| 2021-07-08 15:20:00-04:00 | 1.03 | 1.059 |
| 2021-07-08 15:25:00-04:00 | 1.029 | 1.059 |
| 2021-07-08 15:30:00-04:00 | 1.03 | 1.06 |
| 2021-07-08 15:35:00-04:00 | 1.031 | 1.061 |
| 2021-07-08 15:40:00-04:00 | 1.033 | 1.063 |
| 2021-07-08 15:45:00-04:00 | 1.032 | 1.062 |
| 2021-07-08 15:50:00-04:00 | 1.031 | 1.062 |
| 2021-07-08 15:55:00-04:00 | 1.035 | 1.062 |
| 2021-07-09 09:30:00-04:00 | 1.039 | 1.062 |
| 2021-07-09 09:35:00-04:00 | 1.033 | 1.056 |
| 2021-07-09 09:40:00-04:00 | 1.037 | 1.06 |
| 2021-07-09 09:45:00-04:00 | 1.039 | 1.062 |
| 2021-07-09 09:50:00-04:00 | 1.034 | 1.057 |
| 2021-07-09 09:55:00-04:00 | 1.032 | 1.055 |
| 2021-07-09 10:00:00-04:00 | 1.035 | 1.059 |
| 2021-07-09 10:05:00-04:00 | 1.035 | 1.058 |
| 2021-07-09 10:10:00-04:00 | 1.037 | 1.06 |
| 2021-07-09 10:15:00-04:00 | 1.037 | 1.06 |
| 2021-07-09 10:20:00-04:00 | 1.035 | 1.058 |
| 2021-07-09 10:25:00-04:00 | 1.037 | 1.06 |
| 2021-07-09 10:30:00-04:00 | 1.035 | 1.058 |
| 2021-07-09 10:35:00-04:00 | 1.034 | 1.057 |
| 2021-07-09 10:40:00-04:00 | 1.035 | 1.058 |
| 2021-07-09 10:45:00-04:00 | 1.035 | 1.058 |
| 2021-07-09 10:50:00-04:00 | 1.033 | 1.058 |
| 2021-07-09 10:55:00-04:00 | 1.034 | 1.058 |
| 2021-07-09 11:00:00-04:00 | 1.035 | 1.058 |
| 2021-07-09 11:05:00-04:00 | 1.035 | 1.058 |
| 2021-07-09 11:10:00-04:00 | 1.034 | 1.058 |
| 2021-07-09 11:15:00-04:00 | 1.037 | 1.058 |
| 2021-07-09 11:20:00-04:00 | 1.039 | 1.058 |
| 2021-07-09 11:25:00-04:00 | 1.037 | 1.058 |
| 2021-07-09 11:30:00-04:00 | 1.037 | 1.058 |
| 2021-07-09 11:35:00-04:00 | 1.036 | 1.057 |
| 2021-07-09 11:40:00-04:00 | 1.035 | 1.056 |
| 2021-07-09 11:45:00-04:00 | 1.035 | 1.056 |
| 2021-07-09 11:50:00-04:00 | 1.036 | 1.057 |
| 2021-07-09 11:55:00-04:00 | 1.035 | 1.056 |
| 2021-07-09 12:00:00-04:00 | 1.037 | 1.058 |
| 2021-07-09 12:05:00-04:00 | 1.036 | 1.057 |
| 2021-07-09 12:10:00-04:00 | 1.037 | 1.057 |
| 2021-07-09 12:15:00-04:00 | 1.04 | 1.06 |
| 2021-07-09 12:20:00-04:00 | 1.041 | 1.062 |
| 2021-07-09 12:25:00-04:00 | 1.043 | 1.064 |
| 2021-07-09 12:30:00-04:00 | 1.042 | 1.063 |
| 2021-07-09 12:35:00-04:00 | 1.043 | 1.064 |
| 2021-07-09 12:40:00-04:00 | 1.045 | 1.066 |
| 2021-07-09 12:45:00-04:00 | 1.046 | 1.066 |
| 2021-07-09 12:50:00-04:00 | 1.046 | 1.067 |
| 2021-07-09 12:55:00-04:00 | 1.045 | 1.066 |
| 2021-07-09 13:00:00-04:00 | 1.046 | 1.067 |
| 2021-07-09 13:05:00-04:00 | 1.045 | 1.066 |
| 2021-07-09 13:10:00-04:00 | 1.043 | 1.064 |
| 2021-07-09 13:15:00-04:00 | 1.042 | 1.063 |
| 2021-07-09 13:20:00-04:00 | 1.041 | 1.062 |
| 2021-07-09 13:25:00-04:00 | 1.04 | 1.061 |
| 2021-07-09 13:30:00-04:00 | 1.041 | 1.061 |
| 2021-07-09 13:35:00-04:00 | 1.041 | 1.061 |
| 2021-07-09 13:40:00-04:00 | 1.041 | 1.061 |
| 2021-07-09 13:45:00-04:00 | 1.039 | 1.061 |
| 2021-07-09 13:50:00-04:00 | 1.039 | 1.061 |
| 2021-07-09 13:55:00-04:00 | 1.04 | 1.061 |
| 2021-07-09 14:00:00-04:00 | 1.04 | 1.061 |
| 2021-07-09 14:05:00-04:00 | 1.039 | 1.061 |
| 2021-07-09 14:10:00-04:00 | 1.042 | 1.061 |
| 2021-07-09 14:15:00-04:00 | 1.041 | 1.061 |
| 2021-07-09 14:20:00-04:00 | 1.039 | 1.061 |
| 2021-07-09 14:25:00-04:00 | 1.039 | 1.061 |
| 2021-07-09 14:30:00-04:00 | 1.041 | 1.061 |
| 2021-07-09 14:35:00-04:00 | 1.042 | 1.061 |
| 2021-07-09 14:40:00-04:00 | 1.041 | 1.06 |
| 2021-07-09 14:45:00-04:00 | 1.041 | 1.061 |
| 2021-07-09 14:50:00-04:00 | 1.041 | 1.06 |
| 2021-07-09 14:55:00-04:00 | 1.041 | 1.061 |
| 2021-07-09 15:00:00-04:00 | 1.041 | 1.061 |
| 2021-07-09 15:05:00-04:00 | 1.04 | 1.059 |
| 2021-07-09 15:10:00-04:00 | 1.039 | 1.059 |
| 2021-07-09 15:15:00-04:00 | 1.039 | 1.059 |
| 2021-07-09 15:20:00-04:00 | 1.04 | 1.06 |
| 2021-07-09 15:25:00-04:00 | 1.043 | 1.06 |
| 2021-07-09 15:30:00-04:00 | 1.041 | 1.06 |
| 2021-07-09 15:35:00-04:00 | 1.042 | 1.061 |
| 2021-07-09 15:40:00-04:00 | 1.043 | 1.061 |
| 2021-07-09 15:45:00-04:00 | 1.042 | 1.061 |
| 2021-07-09 15:50:00-04:00 | 1.042 | 1.06 |
| 2021-07-09 15:55:00-04:00 | 1.045 | 1.063 |
| 2021-07-12 09:30:00-04:00 | 1.044 | 1.062 |
| 2021-07-12 09:35:00-04:00 | 1.067 | 1.085 |
| 2021-07-12 09:40:00-04:00 | 1.066 | 1.085 |
| 2021-07-12 09:45:00-04:00 | 1.074 | 1.092 |
| 2021-07-12 09:50:00-04:00 | 1.067 | 1.085 |
| 2021-07-12 09:55:00-04:00 | 1.07 | 1.088 |
| 2021-07-12 10:00:00-04:00 | 1.075 | 1.093 |
| 2021-07-12 10:05:00-04:00 | 1.076 | 1.095 |
| 2021-07-12 10:10:00-04:00 | 1.08 | 1.098 |
| 2021-07-12 10:15:00-04:00 | 1.083 | 1.101 |
| 2021-07-12 10:20:00-04:00 | 1.081 | 1.099 |
| 2021-07-12 10:25:00-04:00 | 1.083 | 1.101 |
| 2021-07-12 10:30:00-04:00 | 1.087 | 1.105 |
| 2021-07-12 10:35:00-04:00 | 1.085 | 1.103 |
| 2021-07-12 10:40:00-04:00 | 1.081 | 1.1 |
| 2021-07-12 10:45:00-04:00 | 1.078 | 1.097 |
| 2021-07-12 10:50:00-04:00 | 1.075 | 1.094 |
| 2021-07-12 10:55:00-04:00 | 1.077 | 1.096 |
| 2021-07-12 11:00:00-04:00 | 1.077 | 1.095 |
| 2021-07-12 11:05:00-04:00 | 1.08 | 1.098 |
| 2021-07-12 11:10:00-04:00 | 1.078 | 1.097 |
| 2021-07-12 11:15:00-04:00 | 1.077 | 1.097 |
| 2021-07-12 11:20:00-04:00 | 1.075 | 1.097 |
| 2021-07-12 11:25:00-04:00 | 1.072 | 1.097 |
| 2021-07-12 11:30:00-04:00 | 1.073 | 1.097 |
| 2021-07-12 11:35:00-04:00 | 1.077 | 1.097 |
| 2021-07-12 11:40:00-04:00 | 1.076 | 1.097 |
| 2021-07-12 11:45:00-04:00 | 1.077 | 1.097 |
| 2021-07-12 11:50:00-04:00 | 1.076 | 1.097 |
| 2021-07-12 11:55:00-04:00 | 1.077 | 1.097 |
| 2021-07-12 12:00:00-04:00 | 1.078 | 1.097 |
| 2021-07-12 12:05:00-04:00 | 1.078 | 1.097 |
| 2021-07-12 12:10:00-04:00 | 1.081 | 1.099 |
| 2021-07-12 12:15:00-04:00 | 1.082 | 1.101 |
| 2021-07-12 12:20:00-04:00 | 1.083 | 1.102 |
| 2021-07-12 12:25:00-04:00 | 1.086 | 1.104 |
| 2021-07-12 12:30:00-04:00 | 1.088 | 1.106 |
| 2021-07-12 12:35:00-04:00 | 1.087 | 1.105 |
| 2021-07-12 12:40:00-04:00 | 1.085 | 1.103 |
| 2021-07-12 12:45:00-04:00 | 1.086 | 1.104 |
| 2021-07-12 12:50:00-04:00 | 1.087 | 1.106 |
| 2021-07-12 12:55:00-04:00 | 1.083 | 1.101 |
| 2021-07-12 13:00:00-04:00 | 1.083 | 1.102 |
| 2021-07-12 13:05:00-04:00 | 1.082 | 1.1 |
| 2021-07-12 13:10:00-04:00 | 1.079 | 1.098 |
| 2021-07-12 13:15:00-04:00 | 1.079 | 1.097 |
| 2021-07-12 13:20:00-04:00 | 1.08 | 1.098 |
| 2021-07-12 13:25:00-04:00 | 1.078 | 1.098 |
| 2021-07-12 13:30:00-04:00 | 1.08 | 1.098 |
| 2021-07-12 13:35:00-04:00 | 1.079 | 1.098 |
| 2021-07-12 13:40:00-04:00 | 1.078 | 1.098 |
| 2021-07-12 13:45:00-04:00 | 1.079 | 1.098 |
| 2021-07-12 13:50:00-04:00 | 1.078 | 1.098 |
| 2021-07-12 13:55:00-04:00 | 1.08 | 1.098 |
| 2021-07-12 14:00:00-04:00 | 1.084 | 1.098 |
| 2021-07-12 14:05:00-04:00 | 1.084 | 1.098 |
| 2021-07-12 14:10:00-04:00 | 1.085 | 1.098 |
| 2021-07-12 14:15:00-04:00 | 1.084 | 1.098 |
| 2021-07-12 14:20:00-04:00 | 1.083 | 1.097 |
| 2021-07-12 14:25:00-04:00 | 1.084 | 1.098 |
| 2021-07-12 14:30:00-04:00 | 1.084 | 1.098 |
| 2021-07-12 14:35:00-04:00 | 1.084 | 1.098 |
| 2021-07-12 14:40:00-04:00 | 1.085 | 1.099 |
| 2021-07-12 14:45:00-04:00 | 1.086 | 1.1 |
| 2021-07-12 14:50:00-04:00 | 1.087 | 1.101 |
| 2021-07-12 14:55:00-04:00 | 1.087 | 1.101 |
| 2021-07-12 15:00:00-04:00 | 1.089 | 1.102 |
| 2021-07-12 15:05:00-04:00 | 1.087 | 1.101 |
| 2021-07-12 15:10:00-04:00 | 1.087 | 1.101 |
| 2021-07-12 15:15:00-04:00 | 1.087 | 1.101 |
| 2021-07-12 15:20:00-04:00 | 1.085 | 1.099 |
| 2021-07-12 15:25:00-04:00 | 1.084 | 1.098 |
| 2021-07-12 15:30:00-04:00 | 1.085 | 1.099 |
| 2021-07-12 15:35:00-04:00 | 1.085 | 1.099 |
| 2021-07-12 15:40:00-04:00 | 1.084 | 1.098 |
| 2021-07-12 15:45:00-04:00 | 1.084 | 1.098 |
| 2021-07-12 15:50:00-04:00 | 1.086 | 1.098 |
| 2021-07-12 15:55:00-04:00 | 1.087 | 1.098 |
| 2021-07-13 09:30:00-04:00 | 1.087 | 1.098 |
| 2021-07-13 09:35:00-04:00 | 1.086 | 1.098 |
| 2021-07-13 09:40:00-04:00 | 1.081 | 1.098 |
| 2021-07-13 09:45:00-04:00 | 1.081 | 1.098 |
| 2021-07-13 09:50:00-04:00 | 1.082 | 1.098 |
| 2021-07-13 09:55:00-04:00 | 1.079 | 1.098 |
| 2021-07-13 10:00:00-04:00 | 1.082 | 1.098 |
| 2021-07-13 10:05:00-04:00 | 1.083 | 1.098 |
| 2021-07-13 10:10:00-04:00 | 1.079 | 1.098 |
| 2021-07-13 10:15:00-04:00 | 1.08 | 1.098 |
| 2021-07-13 10:20:00-04:00 | 1.079 | 1.098 |
| 2021-07-13 10:25:00-04:00 | 1.077 | 1.098 |
| 2021-07-13 10:30:00-04:00 | 1.074 | 1.098 |
| 2021-07-13 10:35:00-04:00 | 1.073 | 1.098 |
| 2021-07-13 10:40:00-04:00 | 1.076 | 1.098 |
| 2021-07-13 10:45:00-04:00 | 1.073 | 1.098 |
| 2021-07-13 10:50:00-04:00 | 1.076 | 1.098 |
| 2021-07-13 10:55:00-04:00 | 1.077 | 1.098 |
| 2021-07-13 11:00:00-04:00 | 1.076 | 1.098 |
| 2021-07-13 11:05:00-04:00 | 1.079 | 1.098 |
| 2021-07-13 11:10:00-04:00 | 1.078 | 1.098 |
| 2021-07-13 11:15:00-04:00 | 1.077 | 1.098 |
| 2021-07-13 11:20:00-04:00 | 1.076 | 1.098 |
| 2021-07-13 11:25:00-04:00 | 1.077 | 1.098 |
| 2021-07-13 11:30:00-04:00 | 1.076 | 1.096 |
| 2021-07-13 11:35:00-04:00 | 1.074 | 1.095 |
| 2021-07-13 11:40:00-04:00 | 1.076 | 1.096 |
| 2021-07-13 11:45:00-04:00 | 1.076 | 1.097 |
| 2021-07-13 11:50:00-04:00 | 1.077 | 1.097 |
| 2021-07-13 11:55:00-04:00 | 1.08 | 1.097 |
| 2021-07-13 12:00:00-04:00 | 1.081 | 1.097 |
| 2021-07-13 12:05:00-04:00 | 1.081 | 1.097 |
| 2021-07-13 12:10:00-04:00 | 1.079 | 1.095 |
| 2021-07-13 12:15:00-04:00 | 1.079 | 1.095 |
| 2021-07-13 12:20:00-04:00 | 1.078 | 1.094 |
| 2021-07-13 12:25:00-04:00 | 1.08 | 1.096 |
| 2021-07-13 12:30:00-04:00 | 1.078 | 1.094 |
| 2021-07-13 12:35:00-04:00 | 1.078 | 1.095 |
| 2021-07-13 12:40:00-04:00 | 1.08 | 1.096 |
| 2021-07-13 12:45:00-04:00 | 1.08 | 1.096 |
| 2021-07-13 12:50:00-04:00 | 1.08 | 1.096 |
| 2021-07-13 12:55:00-04:00 | 1.079 | 1.095 |
| 2021-07-13 13:00:00-04:00 | 1.079 | 1.095 |
| 2021-07-13 13:05:00-04:00 | 1.076 | 1.092 |
| 2021-07-13 13:10:00-04:00 | 1.076 | 1.092 |
| 2021-07-13 13:15:00-04:00 | 1.075 | 1.092 |
| 2021-07-13 13:20:00-04:00 | 1.07 | 1.092 |
| 2021-07-13 13:25:00-04:00 | 1.071 | 1.092 |
| 2021-07-13 13:30:00-04:00 | 1.071 | 1.092 |
| 2021-07-13 13:35:00-04:00 | 1.07 | 1.092 |
| 2021-07-13 13:40:00-04:00 | 1.068 | 1.092 |
| 2021-07-13 13:45:00-04:00 | 1.068 | 1.092 |
| 2021-07-13 13:50:00-04:00 | 1.067 | 1.092 |
| 2021-07-13 13:55:00-04:00 | 1.067 | 1.092 |
| 2021-07-13 14:00:00-04:00 | 1.068 | 1.092 |
| 2021-07-13 14:05:00-04:00 | 1.061 | 1.092 |
| 2021-07-13 14:10:00-04:00 | 1.063 | 1.092 |
| 2021-07-13 14:15:00-04:00 | 1.066 | 1.092 |
| 2021-07-13 14:20:00-04:00 | 1.066 | 1.092 |
| 2021-07-13 14:25:00-04:00 | 1.066 | 1.092 |
| 2021-07-13 14:30:00-04:00 | 1.068 | 1.092 |
| 2021-07-13 14:35:00-04:00 | 1.069 | 1.092 |
| 2021-07-13 14:40:00-04:00 | 1.067 | 1.092 |
| 2021-07-13 14:45:00-04:00 | 1.065 | 1.092 |
| 2021-07-13 14:50:00-04:00 | 1.064 | 1.092 |
| 2021-07-13 14:55:00-04:00 | 1.062 | 1.092 |
| 2021-07-13 15:00:00-04:00 | 1.065 | 1.092 |
| 2021-07-13 15:05:00-04:00 | 1.063 | 1.092 |
| 2021-07-13 15:10:00-04:00 | 1.063 | 1.092 |
| 2021-07-13 15:15:00-04:00 | 1.062 | 1.092 |
| 2021-07-13 15:20:00-04:00 | 1.062 | 1.092 |
| 2021-07-13 15:25:00-04:00 | 1.062 | 1.092 |
| 2021-07-13 15:30:00-04:00 | 1.061 | 1.092 |
| 2021-07-13 15:35:00-04:00 | 1.062 | 1.092 |
| 2021-07-13 15:40:00-04:00 | 1.062 | 1.092 |
| 2021-07-13 15:45:00-04:00 | 1.062 | 1.092 |
| 2021-07-13 15:50:00-04:00 | 1.063 | 1.092 |
| 2021-07-13 15:55:00-04:00 | 1.06 | 1.092 |
| 2021-07-14 09:30:00-04:00 | 1.062 | 1.092 |
| 2021-07-14 09:35:00-04:00 | 1.066 | 1.092 |
| 2021-07-14 09:40:00-04:00 | 1.063 | 1.092 |
| 2021-07-14 09:45:00-04:00 | 1.057 | 1.092 |
| 2021-07-14 09:50:00-04:00 | 1.053 | 1.092 |
| 2021-07-14 09:55:00-04:00 | 1.056 | 1.092 |
| 2021-07-14 10:00:00-04:00 | 1.055 | 1.092 |
| 2021-07-14 10:05:00-04:00 | 1.061 | 1.092 |
| 2021-07-14 10:10:00-04:00 | 1.064 | 1.092 |
| 2021-07-14 10:15:00-04:00 | 1.067 | 1.092 |
| 2021-07-14 10:20:00-04:00 | 1.065 | 1.092 |
| 2021-07-14 10:25:00-04:00 | 1.065 | 1.092 |
| 2021-07-14 10:30:00-04:00 | 1.063 | 1.092 |
| 2021-07-14 10:35:00-04:00 | 1.059 | 1.089 |
| 2021-07-14 10:40:00-04:00 | 1.06 | 1.089 |
| 2021-07-14 10:45:00-04:00 | 1.062 | 1.092 |
| 2021-07-14 10:50:00-04:00 | 1.063 | 1.092 |
| 2021-07-14 10:55:00-04:00 | 1.065 | 1.095 |
| 2021-07-14 11:00:00-04:00 | 1.068 | 1.098 |
| 2021-07-14 11:05:00-04:00 | 1.074 | 1.104 |
| 2021-07-14 11:10:00-04:00 | 1.075 | 1.104 |
| 2021-07-14 11:15:00-04:00 | 1.071 | 1.1 |
| 2021-07-14 11:20:00-04:00 | 1.07 | 1.1 |
| 2021-07-14 11:25:00-04:00 | 1.068 | 1.098 |
| 2021-07-14 11:30:00-04:00 | 1.065 | 1.095 |
| 2021-07-14 11:35:00-04:00 | 1.066 | 1.096 |
| 2021-07-14 11:40:00-04:00 | 1.064 | 1.093 |
| 2021-07-14 11:45:00-04:00 | 1.062 | 1.092 |
| 2021-07-14 11:50:00-04:00 | 1.06 | 1.09 |
| 2021-07-14 11:55:00-04:00 | 1.056 | 1.086 |
| 2021-07-14 12:00:00-04:00 | 1.056 | 1.086 |
| 2021-07-14 12:05:00-04:00 | 1.059 | 1.086 |
| 2021-07-14 12:10:00-04:00 | 1.058 | 1.086 |
| 2021-07-14 12:15:00-04:00 | 1.058 | 1.086 |
| 2021-07-14 12:20:00-04:00 | 1.059 | 1.086 |
| 2021-07-14 12:25:00-04:00 | 1.057 | 1.086 |
| 2021-07-14 12:30:00-04:00 | 1.055 | 1.086 |
| 2021-07-14 12:35:00-04:00 | 1.057 | 1.086 |
| 2021-07-14 12:40:00-04:00 | 1.057 | 1.086 |
| 2021-07-14 12:45:00-04:00 | 1.058 | 1.086 |
| 2021-07-14 12:50:00-04:00 | 1.055 | 1.086 |
| 2021-07-14 12:55:00-04:00 | 1.056 | 1.086 |
| 2021-07-14 13:00:00-04:00 | 1.055 | 1.086 |
| 2021-07-14 13:05:00-04:00 | 1.055 | 1.086 |
| 2021-07-14 13:10:00-04:00 | 1.055 | 1.086 |
| 2021-07-14 13:15:00-04:00 | 1.054 | 1.086 |
| 2021-07-14 13:20:00-04:00 | 1.053 | 1.086 |
| 2021-07-14 13:25:00-04:00 | 1.05 | 1.086 |
| 2021-07-14 13:30:00-04:00 | 1.051 | 1.086 |
| 2021-07-14 13:35:00-04:00 | 1.051 | 1.086 |
| 2021-07-14 13:40:00-04:00 | 1.051 | 1.086 |
| 2021-07-14 13:45:00-04:00 | 1.051 | 1.086 |
| 2021-07-14 13:50:00-04:00 | 1.05 | 1.086 |
| 2021-07-14 13:55:00-04:00 | 1.048 | 1.086 |
| 2021-07-14 14:00:00-04:00 | 1.046 | 1.086 |
| 2021-07-14 14:05:00-04:00 | 1.047 | 1.086 |
| 2021-07-14 14:10:00-04:00 | 1.046 | 1.086 |
| 2021-07-14 14:15:00-04:00 | 1.048 | 1.086 |
| 2021-07-14 14:20:00-04:00 | 1.049 | 1.086 |
| 2021-07-14 14:25:00-04:00 | 1.05 | 1.086 |
| 2021-07-14 14:30:00-04:00 | 1.048 | 1.086 |
| 2021-07-14 14:35:00-04:00 | 1.048 | 1.086 |
| 2021-07-14 14:40:00-04:00 | 1.047 | 1.086 |
| 2021-07-14 14:45:00-04:00 | 1.048 | 1.086 |
| 2021-07-14 14:50:00-04:00 | 1.048 | 1.086 |
| 2021-07-14 14:55:00-04:00 | 1.049 | 1.086 |
| 2021-07-14 15:00:00-04:00 | 1.049 | 1.086 |
| 2021-07-14 15:05:00-04:00 | 1.051 | 1.088 |
| 2021-07-14 15:10:00-04:00 | 1.052 | 1.089 |
| 2021-07-14 15:15:00-04:00 | 1.051 | 1.088 |
| 2021-07-14 15:20:00-04:00 | 1.046 | 1.083 |
| 2021-07-14 15:25:00-04:00 | 1.044 | 1.081 |
| 2021-07-14 15:30:00-04:00 | 1.043 | 1.08 |
| 2021-07-14 15:35:00-04:00 | 1.042 | 1.08 |
| 2021-07-14 15:40:00-04:00 | 1.043 | 1.08 |
| 2021-07-14 15:45:00-04:00 | 1.04 | 1.08 |
| 2021-07-14 15:50:00-04:00 | 1.041 | 1.08 |
| 2021-07-14 15:55:00-04:00 | 1.039 | 1.08 |
| 2021-07-15 09:30:00-04:00 | 1.039 | 1.08 |
| 2021-07-15 09:35:00-04:00 | 1.043 | 1.08 |
| 2021-07-15 09:40:00-04:00 | 1.047 | 1.08 |
| 2021-07-15 09:45:00-04:00 | 1.049 | 1.08 |
| 2021-07-15 09:50:00-04:00 | 1.056 | 1.08 |
| 2021-07-15 09:55:00-04:00 | 1.051 | 1.08 |
| 2021-07-15 10:00:00-04:00 | 1.055 | 1.084 |
| 2021-07-15 10:05:00-04:00 | 1.053 | 1.082 |
| 2021-07-15 10:10:00-04:00 | 1.056 | 1.085 |
| 2021-07-15 10:15:00-04:00 | 1.055 | 1.084 |
| 2021-07-15 10:20:00-04:00 | 1.05 | 1.079 |
| 2021-07-15 10:25:00-04:00 | 1.048 | 1.077 |
| 2021-07-15 10:30:00-04:00 | 1.044 | 1.073 |
| 2021-07-15 10:35:00-04:00 | 1.045 | 1.074 |
| 2021-07-15 10:40:00-04:00 | 1.047 | 1.076 |
| 2021-07-15 10:45:00-04:00 | 1.041 | 1.07 |
| 2021-07-15 10:50:00-04:00 | 1.04 | 1.07 |
| 2021-07-15 10:55:00-04:00 | 1.041 | 1.07 |
| 2021-07-15 11:00:00-04:00 | 1.042 | 1.07 |
| 2021-07-15 11:05:00-04:00 | 1.038 | 1.07 |
| 2021-07-15 11:10:00-04:00 | 1.042 | 1.07 |
| 2021-07-15 11:15:00-04:00 | 1.044 | 1.07 |
| 2021-07-15 11:20:00-04:00 | 1.043 | 1.07 |
| 2021-07-15 11:25:00-04:00 | 1.043 | 1.07 |
| 2021-07-15 11:30:00-04:00 | 1.042 | 1.07 |
| 2021-07-15 11:35:00-04:00 | 1.045 | 1.07 |
| 2021-07-15 11:40:00-04:00 | 1.04 | 1.07 |
| 2021-07-15 11:45:00-04:00 | 1.04 | 1.07 |
| 2021-07-15 11:50:00-04:00 | 1.037 | 1.068 |
| 2021-07-15 11:55:00-04:00 | 1.036 | 1.067 |
| 2021-07-15 12:00:00-04:00 | 1.035 | 1.067 |
| 2021-07-15 12:05:00-04:00 | 1.031 | 1.067 |
| 2021-07-15 12:10:00-04:00 | 1.029 | 1.067 |
| 2021-07-15 12:15:00-04:00 | 1.031 | 1.067 |
| 2021-07-15 12:20:00-04:00 | 1.031 | 1.067 |
| 2021-07-15 12:25:00-04:00 | 1.031 | 1.067 |
| 2021-07-15 12:30:00-04:00 | 1.032 | 1.067 |
| 2021-07-15 12:35:00-04:00 | 1.026 | 1.067 |
| 2021-07-15 12:40:00-04:00 | 1.027 | 1.067 |
| 2021-07-15 12:45:00-04:00 | 1.028 | 1.067 |
| 2021-07-15 12:50:00-04:00 | 1.027 | 1.067 |
| 2021-07-15 12:55:00-04:00 | 1.026 | 1.067 |
| 2021-07-15 13:00:00-04:00 | 1.027 | 1.067 |
| 2021-07-15 13:05:00-04:00 | 1.024 | 1.067 |
| 2021-07-15 13:10:00-04:00 | 1.025 | 1.067 |
| 2021-07-15 13:15:00-04:00 | 1.026 | 1.067 |
| 2021-07-15 13:20:00-04:00 | 1.027 | 1.067 |
| 2021-07-15 13:25:00-04:00 | 1.027 | 1.067 |
| 2021-07-15 13:30:00-04:00 | 1.027 | 1.067 |
| 2021-07-15 13:35:00-04:00 | 1.024 | 1.067 |
| 2021-07-15 13:40:00-04:00 | 1.022 | 1.067 |
| 2021-07-15 13:45:00-04:00 | 1.022 | 1.067 |
| 2021-07-15 13:50:00-04:00 | 1.021 | 1.067 |
| 2021-07-15 13:55:00-04:00 | 1.017 | 1.067 |
| 2021-07-15 14:00:00-04:00 | 1.015 | 1.067 |
| 2021-07-15 14:05:00-04:00 | 1.018 | 1.067 |
| 2021-07-15 14:10:00-04:00 | 1.019 | 1.067 |
| 2021-07-15 14:15:00-04:00 | 1.019 | 1.067 |
| 2021-07-15 14:20:00-04:00 | 1.02 | 1.067 |
| 2021-07-15 14:25:00-04:00 | 1.02 | 1.067 |
| 2021-07-15 14:30:00-04:00 | 1.023 | 1.067 |
| 2021-07-15 14:35:00-04:00 | 1.022 | 1.067 |
| 2021-07-15 14:40:00-04:00 | 1.024 | 1.067 |
| 2021-07-15 14:45:00-04:00 | 1.024 | 1.067 |
| 2021-07-15 14:50:00-04:00 | 1.027 | 1.07 |
| 2021-07-15 14:55:00-04:00 | 1.028 | 1.071 |
| 2021-07-15 15:00:00-04:00 | 1.028 | 1.071 |
| 2021-07-15 15:05:00-04:00 | 1.028 | 1.071 |
| 2021-07-15 15:10:00-04:00 | 1.027 | 1.07 |
| 2021-07-15 15:15:00-04:00 | 1.026 | 1.069 |
| 2021-07-15 15:20:00-04:00 | 1.027 | 1.07 |
| 2021-07-15 15:25:00-04:00 | 1.026 | 1.069 |
| 2021-07-15 15:30:00-04:00 | 1.029 | 1.072 |
| 2021-07-15 15:35:00-04:00 | 1.033 | 1.076 |
| 2021-07-15 15:40:00-04:00 | 1.029 | 1.072 |
| 2021-07-15 15:45:00-04:00 | 1.03 | 1.073 |
| 2021-07-15 15:50:00-04:00 | 1.031 | 1.074 |
| 2021-07-15 15:55:00-04:00 | 1.034 | 1.077 |
| 2021-07-16 09:30:00-04:00 | 1.035 | 1.078 |
| 2021-07-16 09:35:00-04:00 | 1.041 | 1.084 |
| 2021-07-16 09:40:00-04:00 | 1.035 | 1.078 |
| 2021-07-16 09:45:00-04:00 | 1.033 | 1.076 |
| 2021-07-16 09:50:00-04:00 | 1.031 | 1.074 |
| 2021-07-16 09:55:00-04:00 | 1.032 | 1.075 |
| 2021-07-16 10:00:00-04:00 | 1.026 | 1.069 |
| 2021-07-16 10:05:00-04:00 | 1.027 | 1.07 |
| 2021-07-16 10:10:00-04:00 | 1.024 | 1.067 |
| 2021-07-16 10:15:00-04:00 | 1.026 | 1.069 |
| 2021-07-16 10:20:00-04:00 | 1.028 | 1.069 |
| 2021-07-16 10:25:00-04:00 | 1.025 | 1.069 |
| 2021-07-16 10:30:00-04:00 | 1.026 | 1.069 |
| 2021-07-16 10:35:00-04:00 | 1.03 | 1.069 |
| 2021-07-16 10:40:00-04:00 | 1.032 | 1.069 |
| 2021-07-16 10:45:00-04:00 | 1.032 | 1.069 |
| 2021-07-16 10:50:00-04:00 | 1.031 | 1.069 |
| 2021-07-16 10:55:00-04:00 | 1.028 | 1.069 |
| 2021-07-16 11:00:00-04:00 | 1.025 | 1.069 |
| 2021-07-16 11:05:00-04:00 | 1.024 | 1.068 |
| 2021-07-16 11:10:00-04:00 | 1.023 | 1.067 |
| 2021-07-16 11:15:00-04:00 | 1.024 | 1.067 |
| 2021-07-16 11:20:00-04:00 | 1.026 | 1.069 |
| 2021-07-16 11:25:00-04:00 | 1.025 | 1.069 |
| 2021-07-16 11:30:00-04:00 | 1.023 | 1.069 |
| 2021-07-16 11:35:00-04:00 | 1.024 | 1.069 |
| 2021-07-16 11:40:00-04:00 | 1.025 | 1.069 |
| 2021-07-16 11:45:00-04:00 | 1.026 | 1.069 |
| 2021-07-16 11:50:00-04:00 | 1.025 | 1.069 |
| 2021-07-16 11:55:00-04:00 | 1.028 | 1.069 |
| 2021-07-16 12:00:00-04:00 | 1.028 | 1.069 |
| 2021-07-16 12:05:00-04:00 | 1.029 | 1.069 |
| 2021-07-16 12:10:00-04:00 | 1.028 | 1.069 |
| 2021-07-16 12:15:00-04:00 | 1.028 | 1.069 |
| 2021-07-16 12:20:00-04:00 | 1.03 | 1.071 |
| 2021-07-16 12:25:00-04:00 | 1.03 | 1.071 |
| 2021-07-16 12:30:00-04:00 | 1.032 | 1.073 |
| 2021-07-16 12:35:00-04:00 | 1.033 | 1.073 |
| 2021-07-16 12:40:00-04:00 | 1.031 | 1.072 |
| 2021-07-16 12:45:00-04:00 | 1.033 | 1.073 |
| 2021-07-16 12:50:00-04:00 | 1.032 | 1.073 |
| 2021-07-16 12:55:00-04:00 | 1.036 | 1.077 |
| 2021-07-16 13:00:00-04:00 | 1.035 | 1.076 |
| 2021-07-16 13:05:00-04:00 | 1.035 | 1.076 |
| 2021-07-16 13:10:00-04:00 | 1.036 | 1.077 |
| 2021-07-16 13:15:00-04:00 | 1.036 | 1.076 |
| 2021-07-16 13:20:00-04:00 | 1.032 | 1.073 |
| 2021-07-16 13:25:00-04:00 | 1.03 | 1.071 |
| 2021-07-16 13:30:00-04:00 | 1.029 | 1.07 |
| 2021-07-16 13:35:00-04:00 | 1.029 | 1.07 |
| 2021-07-16 13:40:00-04:00 | 1.027 | 1.068 |
| 2021-07-16 13:45:00-04:00 | 1.028 | 1.068 |
| 2021-07-16 13:50:00-04:00 | 1.028 | 1.068 |
| 2021-07-16 13:55:00-04:00 | 1.029 | 1.068 |
| 2021-07-16 14:00:00-04:00 | 1.027 | 1.068 |
| 2021-07-16 14:05:00-04:00 | 1.026 | 1.068 |
| 2021-07-16 14:10:00-04:00 | 1.027 | 1.068 |
| 2021-07-16 14:15:00-04:00 | 1.025 | 1.068 |
| 2021-07-16 14:20:00-04:00 | 1.027 | 1.068 |
| 2021-07-16 14:25:00-04:00 | 1.027 | 1.068 |
| 2021-07-16 14:30:00-04:00 | 1.026 | 1.068 |
| 2021-07-16 14:35:00-04:00 | 1.026 | 1.068 |
| 2021-07-16 14:40:00-04:00 | 1.027 | 1.068 |
| 2021-07-16 14:45:00-04:00 | 1.026 | 1.068 |
| 2021-07-16 14:50:00-04:00 | 1.026 | 1.068 |
| 2021-07-16 14:55:00-04:00 | 1.025 | 1.068 |
| 2021-07-16 15:00:00-04:00 | 1.025 | 1.068 |
| 2021-07-16 15:05:00-04:00 | 1.023 | 1.068 |
| 2021-07-16 15:10:00-04:00 | 1.025 | 1.068 |
| 2021-07-16 15:15:00-04:00 | 1.026 | 1.068 |
| 2021-07-16 15:20:00-04:00 | 1.029 | 1.068 |
| 2021-07-16 15:25:00-04:00 | 1.026 | 1.068 |
| 2021-07-16 15:30:00-04:00 | 1.024 | 1.068 |
| 2021-07-16 15:35:00-04:00 | 1.023 | 1.068 |
| 2021-07-16 15:40:00-04:00 | 1.022 | 1.068 |
| 2021-07-16 15:45:00-04:00 | 1.023 | 1.068 |
| 2021-07-16 15:50:00-04:00 | 1.023 | 1.068 |
| 2021-07-16 15:55:00-04:00 | 1.024 | 1.068 |
| 2021-07-19 09:30:00-04:00 | 1.024 | 1.068 |
| 2021-07-19 09:35:00-04:00 | 1 | 1.068 |
| 2021-07-19 09:40:00-04:00 | 1.001 | 1.068 |
| 2021-07-19 09:45:00-04:00 | 1.002 | 1.068 |
| 2021-07-19 09:50:00-04:00 | 1 | 1.068 |
| 2021-07-19 09:55:00-04:00 | 1.001 | 1.068 |
| 2021-07-19 10:00:00-04:00 | 1.001 | 1.068 |
| 2021-07-19 10:05:00-04:00 | 0.994 | 1.068 |
| 2021-07-19 10:10:00-04:00 | 0.991 | 1.068 |
| 2021-07-19 10:15:00-04:00 | 0.99 | 1.068 |
| 2021-07-19 10:20:00-04:00 | 0.997 | 1.068 |
| 2021-07-19 10:25:00-04:00 | 0.999 | 1.068 |
| 2021-07-19 10:30:00-04:00 | 1 | 1.068 |
| 2021-07-19 10:35:00-04:00 | 0.995 | 1.068 |
| 2021-07-19 10:40:00-04:00 | 0.999 | 1.068 |
| 2021-07-19 10:45:00-04:00 | 1.002 | 1.068 |
| 2021-07-19 10:50:00-04:00 | 1.003 | 1.068 |
| 2021-07-19 10:55:00-04:00 | 1 | 1.068 |
| 2021-07-19 11:00:00-04:00 | 1.007 | 1.074 |
| 2021-07-19 11:05:00-04:00 | 1.01 | 1.078 |
| 2021-07-19 11:10:00-04:00 | 1.013 | 1.081 |
| 2021-07-19 11:15:00-04:00 | 1.013 | 1.081 |
| 2021-07-19 11:20:00-04:00 | 1.011 | 1.079 |
| 2021-07-19 11:25:00-04:00 | 1.01 | 1.077 |
| 2021-07-19 11:30:00-04:00 | 1.01 | 1.078 |
| 2021-07-19 11:35:00-04:00 | 1.019 | 1.086 |
| 2021-07-19 11:40:00-04:00 | 1.019 | 1.087 |
| 2021-07-19 11:45:00-04:00 | 1.02 | 1.087 |
| 2021-07-19 11:50:00-04:00 | 1.02 | 1.087 |
| 2021-07-19 11:55:00-04:00 | 1.017 | 1.084 |
| 2021-07-19 12:00:00-04:00 | 1.015 | 1.082 |
| 2021-07-19 12:05:00-04:00 | 1.014 | 1.081 |
| 2021-07-19 12:10:00-04:00 | 1.012 | 1.08 |
| 2021-07-19 12:15:00-04:00 | 1.015 | 1.083 |
| 2021-07-19 12:20:00-04:00 | 1.018 | 1.086 |
| 2021-07-19 12:25:00-04:00 | 1.02 | 1.087 |
| 2021-07-19 12:30:00-04:00 | 1.019 | 1.086 |
| 2021-07-19 12:35:00-04:00 | 1.016 | 1.084 |
| 2021-07-19 12:40:00-04:00 | 1.013 | 1.081 |
| 2021-07-19 12:45:00-04:00 | 1.012 | 1.081 |
| 2021-07-19 12:50:00-04:00 | 1.011 | 1.081 |
| 2021-07-19 12:55:00-04:00 | 1.01 | 1.081 |
| 2021-07-19 13:00:00-04:00 | 1.011 | 1.081 |
| 2021-07-19 13:05:00-04:00 | 1.012 | 1.081 |
| 2021-07-19 13:10:00-04:00 | 1.014 | 1.081 |
| 2021-07-19 13:15:00-04:00 | 1.013 | 1.081 |
| 2021-07-19 13:20:00-04:00 | 1.013 | 1.081 |
| 2021-07-19 13:25:00-04:00 | 1.014 | 1.081 |
| 2021-07-19 13:30:00-04:00 | 1.013 | 1.081 |
| 2021-07-19 13:35:00-04:00 | 1.014 | 1.081 |
| 2021-07-19 13:40:00-04:00 | 1.019 | 1.081 |
| 2021-07-19 13:45:00-04:00 | 1.018 | 1.08 |
| 2021-07-19 13:50:00-04:00 | 1.019 | 1.081 |
| 2021-07-19 13:55:00-04:00 | 1.021 | 1.082 |
| 2021-07-19 14:00:00-04:00 | 1.021 | 1.083 |
| 2021-07-19 14:05:00-04:00 | 1.026 | 1.088 |
| 2021-07-19 14:10:00-04:00 | 1.025 | 1.087 |
| 2021-07-19 14:15:00-04:00 | 1.025 | 1.087 |
| 2021-07-19 14:20:00-04:00 | 1.028 | 1.09 |
| 2021-07-19 14:25:00-04:00 | 1.027 | 1.089 |
| 2021-07-19 14:30:00-04:00 | 1.028 | 1.09 |
| 2021-07-19 14:35:00-04:00 | 1.026 | 1.087 |
| 2021-07-19 14:40:00-04:00 | 1.023 | 1.085 |
| 2021-07-19 14:45:00-04:00 | 1.022 | 1.084 |
| 2021-07-19 14:50:00-04:00 | 1.025 | 1.087 |
| 2021-07-19 14:55:00-04:00 | 1.024 | 1.085 |
| 2021-07-19 15:00:00-04:00 | 1.025 | 1.086 |
| 2021-07-19 15:05:00-04:00 | 1.025 | 1.087 |
| 2021-07-19 15:10:00-04:00 | 1.026 | 1.088 |
| 2021-07-19 15:15:00-04:00 | 1.025 | 1.088 |
| 2021-07-19 15:20:00-04:00 | 1.02 | 1.088 |
| 2021-07-19 15:25:00-04:00 | 1.02 | 1.088 |
| 2021-07-19 15:30:00-04:00 | 1.019 | 1.088 |
| 2021-07-19 15:35:00-04:00 | 1.018 | 1.088 |
| 2021-07-19 15:40:00-04:00 | 1.021 | 1.088 |
| 2021-07-19 15:45:00-04:00 | 1.021 | 1.088 |
| 2021-07-19 15:50:00-04:00 | 1.023 | 1.088 |
| 2021-07-19 15:55:00-04:00 | 1.027 | 1.088 |
| 2021-07-20 09:30:00-04:00 | 1.028 | 1.088 |
| 2021-07-20 09:35:00-04:00 | 1.031 | 1.088 |
| 2021-07-20 09:40:00-04:00 | 1.025 | 1.088 |
| 2021-07-20 09:45:00-04:00 | 1.024 | 1.087 |
| 2021-07-20 09:50:00-04:00 | 1.024 | 1.086 |
| 2021-07-20 09:55:00-04:00 | 1.025 | 1.088 |
| 2021-07-20 10:00:00-04:00 | 1.024 | 1.087 |
| 2021-07-20 10:05:00-04:00 | 1.019 | 1.082 |
| 2021-07-20 10:10:00-04:00 | 1.02 | 1.083 |
| 2021-07-20 10:15:00-04:00 | 1.023 | 1.086 |
| 2021-07-20 10:20:00-04:00 | 1.028 | 1.086 |
| 2021-07-20 10:25:00-04:00 | 1.031 | 1.086 |
| 2021-07-20 10:30:00-04:00 | 1.028 | 1.086 |
| 2021-07-20 10:35:00-04:00 | 1.028 | 1.086 |
| 2021-07-20 10:40:00-04:00 | 1.031 | 1.086 |
| 2021-07-20 10:45:00-04:00 | 1.031 | 1.086 |
| 2021-07-20 10:50:00-04:00 | 1.032 | 1.088 |
| 2021-07-20 10:55:00-04:00 | 1.031 | 1.086 |
| 2021-07-20 11:00:00-04:00 | 1.026 | 1.081 |
| 2021-07-20 11:05:00-04:00 | 1.026 | 1.082 |
| 2021-07-20 11:10:00-04:00 | 1.028 | 1.083 |
| 2021-07-20 11:15:00-04:00 | 1.03 | 1.085 |
| 2021-07-20 11:20:00-04:00 | 1.031 | 1.086 |
| 2021-07-20 11:25:00-04:00 | 1.032 | 1.087 |
| 2021-07-20 11:30:00-04:00 | 1.031 | 1.086 |
| 2021-07-20 11:35:00-04:00 | 1.03 | 1.085 |
| 2021-07-20 11:40:00-04:00 | 1.03 | 1.085 |
| 2021-07-20 11:45:00-04:00 | 1.031 | 1.085 |
| 2021-07-20 11:50:00-04:00 | 1.03 | 1.083 |
| 2021-07-20 11:55:00-04:00 | 1.03 | 1.084 |
| 2021-07-20 12:00:00-04:00 | 1.031 | 1.084 |
| 2021-07-20 12:05:00-04:00 | 1.033 | 1.086 |
| 2021-07-20 12:10:00-04:00 | 1.033 | 1.086 |
| 2021-07-20 12:15:00-04:00 | 1.032 | 1.086 |
| 2021-07-20 12:20:00-04:00 | 1.032 | 1.085 |
| 2021-07-20 12:25:00-04:00 | 1.031 | 1.085 |
| 2021-07-20 12:30:00-04:00 | 1.034 | 1.087 |
| 2021-07-20 12:35:00-04:00 | 1.035 | 1.088 |
| 2021-07-20 12:40:00-04:00 | 1.036 | 1.089 |
| 2021-07-20 12:45:00-04:00 | 1.035 | 1.088 |
| 2021-07-20 12:50:00-04:00 | 1.035 | 1.089 |
| 2021-07-20 12:55:00-04:00 | 1.032 | 1.086 |
| 2021-07-20 13:00:00-04:00 | 1.031 | 1.084 |
| 2021-07-20 13:05:00-04:00 | 1.029 | 1.082 |
| 2021-07-20 13:10:00-04:00 | 1.029 | 1.082 |
| 2021-07-20 13:15:00-04:00 | 1.031 | 1.085 |
| 2021-07-20 13:20:00-04:00 | 1.033 | 1.085 |
| 2021-07-20 13:25:00-04:00 | 1.032 | 1.085 |
| 2021-07-20 13:30:00-04:00 | 1.033 | 1.085 |
| 2021-07-20 13:35:00-04:00 | 1.034 | 1.085 |
| 2021-07-20 13:40:00-04:00 | 1.033 | 1.085 |
| 2021-07-20 13:45:00-04:00 | 1.032 | 1.085 |
| 2021-07-20 13:50:00-04:00 | 1.031 | 1.085 |
| 2021-07-20 13:55:00-04:00 | 1.032 | 1.085 |
| 2021-07-20 14:00:00-04:00 | 1.033 | 1.085 |
| 2021-07-20 14:05:00-04:00 | 1.033 | 1.085 |
| 2021-07-20 14:10:00-04:00 | 1.035 | 1.087 |
| 2021-07-20 14:15:00-04:00 | 1.035 | 1.087 |
| 2021-07-20 14:20:00-04:00 | 1.035 | 1.088 |
| 2021-07-20 14:25:00-04:00 | 1.036 | 1.088 |
| 2021-07-20 14:30:00-04:00 | 1.037 | 1.089 |
| 2021-07-20 14:35:00-04:00 | 1.039 | 1.091 |
| 2021-07-20 14:40:00-04:00 | 1.039 | 1.091 |
| 2021-07-20 14:45:00-04:00 | 1.037 | 1.089 |
| 2021-07-20 14:50:00-04:00 | 1.038 | 1.091 |
| 2021-07-20 14:55:00-04:00 | 1.04 | 1.092 |
| 2021-07-20 15:00:00-04:00 | 1.04 | 1.092 |
| 2021-07-20 15:05:00-04:00 | 1.041 | 1.093 |
| 2021-07-20 15:10:00-04:00 | 1.04 | 1.092 |
| 2021-07-20 15:15:00-04:00 | 1.042 | 1.094 |
| 2021-07-20 15:20:00-04:00 | 1.042 | 1.094 |
| 2021-07-20 15:25:00-04:00 | 1.044 | 1.096 |
| 2021-07-20 15:30:00-04:00 | 1.048 | 1.1 |
| 2021-07-20 15:35:00-04:00 | 1.048 | 1.1 |
| 2021-07-20 15:40:00-04:00 | 1.049 | 1.101 |
| 2021-07-20 15:45:00-04:00 | 1.049 | 1.102 |
| 2021-07-20 15:50:00-04:00 | 1.052 | 1.104 |
| 2021-07-20 15:55:00-04:00 | 1.05 | 1.103 |
| 2021-07-21 09:30:00-04:00 | 1.049 | 1.102 |
| 2021-07-21 09:35:00-04:00 | 1.054 | 1.106 |
| 2021-07-21 09:40:00-04:00 | 1.05 | 1.102 |
| 2021-07-21 09:45:00-04:00 | 1.048 | 1.1 |
| 2021-07-21 09:50:00-04:00 | 1.047 | 1.099 |
| 2021-07-21 09:55:00-04:00 | 1.048 | 1.101 |
| 2021-07-21 10:00:00-04:00 | 1.054 | 1.106 |
| 2021-07-21 10:05:00-04:00 | 1.054 | 1.106 |
| 2021-07-21 10:10:00-04:00 | 1.048 | 1.1 |
| 2021-07-21 10:15:00-04:00 | 1.046 | 1.098 |
| 2021-07-21 10:20:00-04:00 | 1.049 | 1.098 |
| 2021-07-21 10:25:00-04:00 | 1.051 | 1.098 |
| 2021-07-21 10:30:00-04:00 | 1.049 | 1.098 |
| 2021-07-21 10:35:00-04:00 | 1.047 | 1.098 |
| 2021-07-21 10:40:00-04:00 | 1.049 | 1.098 |
| 2021-07-21 10:45:00-04:00 | 1.047 | 1.098 |
| 2021-07-21 10:50:00-04:00 | 1.047 | 1.098 |
| 2021-07-21 10:55:00-04:00 | 1.046 | 1.098 |
| 2021-07-21 11:00:00-04:00 | 1.049 | 1.098 |
| 2021-07-21 11:05:00-04:00 | 1.051 | 1.098 |
| 2021-07-21 11:10:00-04:00 | 1.053 | 1.098 |
| 2021-07-21 11:15:00-04:00 | 1.052 | 1.098 |
| 2021-07-21 11:20:00-04:00 | 1.051 | 1.098 |
| 2021-07-21 11:25:00-04:00 | 1.049 | 1.097 |
| 2021-07-21 11:30:00-04:00 | 1.048 | 1.095 |
| 2021-07-21 11:35:00-04:00 | 1.047 | 1.094 |
| 2021-07-21 11:40:00-04:00 | 1.046 | 1.093 |
| 2021-07-21 11:45:00-04:00 | 1.043 | 1.091 |
| 2021-07-21 11:50:00-04:00 | 1.045 | 1.092 |
| 2021-07-21 11:55:00-04:00 | 1.041 | 1.092 |
| 2021-07-21 12:00:00-04:00 | 1.041 | 1.092 |
| 2021-07-21 12:05:00-04:00 | 1.042 | 1.092 |
| 2021-07-21 12:10:00-04:00 | 1.042 | 1.092 |
| 2021-07-21 12:15:00-04:00 | 1.042 | 1.092 |
| 2021-07-21 12:20:00-04:00 | 1.04 | 1.092 |
| 2021-07-21 12:25:00-04:00 | 1.039 | 1.092 |
| 2021-07-21 12:30:00-04:00 | 1.041 | 1.092 |
| 2021-07-21 12:35:00-04:00 | 1.039 | 1.092 |
| 2021-07-21 12:40:00-04:00 | 1.036 | 1.092 |
| 2021-07-21 12:45:00-04:00 | 1.038 | 1.092 |
| 2021-07-21 12:50:00-04:00 | 1.037 | 1.092 |
| 2021-07-21 12:55:00-04:00 | 1.038 | 1.092 |
| 2021-07-21 13:00:00-04:00 | 1.035 | 1.092 |
| 2021-07-21 13:05:00-04:00 | 1.036 | 1.092 |
| 2021-07-21 13:10:00-04:00 | 1.037 | 1.092 |
| 2021-07-21 13:15:00-04:00 | 1.038 | 1.092 |
| 2021-07-21 13:20:00-04:00 | 1.039 | 1.092 |
| 2021-07-21 13:25:00-04:00 | 1.041 | 1.092 |
| 2021-07-21 13:30:00-04:00 | 1.04 | 1.092 |
| 2021-07-21 13:35:00-04:00 | 1.039 | 1.092 |
| 2021-07-21 13:40:00-04:00 | 1.041 | 1.092 |
| 2021-07-21 13:45:00-04:00 | 1.042 | 1.093 |
| 2021-07-21 13:50:00-04:00 | 1.042 | 1.093 |
| 2021-07-21 13:55:00-04:00 | 1.04 | 1.091 |
| 2021-07-21 14:00:00-04:00 | 1.04 | 1.091 |
| 2021-07-21 14:05:00-04:00 | 1.039 | 1.091 |
| 2021-07-21 14:10:00-04:00 | 1.038 | 1.09 |
| 2021-07-21 14:15:00-04:00 | 1.038 | 1.089 |
| 2021-07-21 14:20:00-04:00 | 1.038 | 1.089 |
| 2021-07-21 14:25:00-04:00 | 1.04 | 1.091 |
| 2021-07-21 14:30:00-04:00 | 1.041 | 1.091 |
| 2021-07-21 14:35:00-04:00 | 1.041 | 1.091 |
| 2021-07-21 14:40:00-04:00 | 1.039 | 1.091 |
| 2021-07-21 14:45:00-04:00 | 1.039 | 1.091 |
| 2021-07-21 14:50:00-04:00 | 1.04 | 1.091 |
| 2021-07-21 14:55:00-04:00 | 1.039 | 1.091 |
| 2021-07-21 15:00:00-04:00 | 1.039 | 1.091 |
| 2021-07-21 15:05:00-04:00 | 1.04 | 1.092 |
| 2021-07-21 15:10:00-04:00 | 1.04 | 1.092 |
| 2021-07-21 15:15:00-04:00 | 1.04 | 1.092 |
| 2021-07-21 15:20:00-04:00 | 1.043 | 1.094 |
| 2021-07-21 15:25:00-04:00 | 1.04 | 1.092 |
| 2021-07-21 15:30:00-04:00 | 1.039 | 1.091 |
| 2021-07-21 15:35:00-04:00 | 1.042 | 1.093 |
| 2021-07-21 15:40:00-04:00 | 1.043 | 1.094 |
| 2021-07-21 15:45:00-04:00 | 1.043 | 1.095 |
| 2021-07-21 15:50:00-04:00 | 1.041 | 1.093 |
| 2021-07-21 15:55:00-04:00 | 1.042 | 1.094 |
| 2021-07-22 09:30:00-04:00 | 1.042 | 1.093 |
| 2021-07-22 09:35:00-04:00 | 1.051 | 1.103 |
| 2021-07-22 09:40:00-04:00 | 1.049 | 1.1 |
| 2021-07-22 09:45:00-04:00 | 1.045 | 1.096 |
| 2021-07-22 09:50:00-04:00 | 1.043 | 1.095 |
| 2021-07-22 09:55:00-04:00 | 1.044 | 1.095 |
| 2021-07-22 10:00:00-04:00 | 1.044 | 1.096 |
| 2021-07-22 10:05:00-04:00 | 1.045 | 1.096 |
| 2021-07-22 10:10:00-04:00 | 1.043 | 1.094 |
| 2021-07-22 10:15:00-04:00 | 1.043 | 1.095 |
| 2021-07-22 10:20:00-04:00 | 1.044 | 1.096 |
| 2021-07-22 10:25:00-04:00 | 1.039 | 1.096 |
| 2021-07-22 10:30:00-04:00 | 1.041 | 1.096 |
| 2021-07-22 10:35:00-04:00 | 1.041 | 1.096 |
| 2021-07-22 10:40:00-04:00 | 1.04 | 1.096 |
| 2021-07-22 10:45:00-04:00 | 1.039 | 1.096 |
| 2021-07-22 10:50:00-04:00 | 1.038 | 1.096 |
| 2021-07-22 10:55:00-04:00 | 1.034 | 1.096 |
| 2021-07-22 11:00:00-04:00 | 1.033 | 1.096 |
| 2021-07-22 11:05:00-04:00 | 1.035 | 1.096 |
| 2021-07-22 11:10:00-04:00 | 1.031 | 1.096 |
| 2021-07-22 11:15:00-04:00 | 1.031 | 1.096 |
| 2021-07-22 11:20:00-04:00 | 1.03 | 1.096 |
| 2021-07-22 11:25:00-04:00 | 1.031 | 1.096 |
| 2021-07-22 11:30:00-04:00 | 1.031 | 1.096 |
| 2021-07-22 11:35:00-04:00 | 1.032 | 1.096 |
| 2021-07-22 11:40:00-04:00 | 1.033 | 1.096 |
| 2021-07-22 11:45:00-04:00 | 1.03 | 1.096 |
| 2021-07-22 11:50:00-04:00 | 1.031 | 1.096 |
| 2021-07-22 11:55:00-04:00 | 1.033 | 1.096 |
| 2021-07-22 12:00:00-04:00 | 1.03 | 1.096 |
| 2021-07-22 12:05:00-04:00 | 1.027 | 1.096 |
| 2021-07-22 12:10:00-04:00 | 1.025 | 1.096 |
| 2021-07-22 12:15:00-04:00 | 1.026 | 1.096 |
| 2021-07-22 12:20:00-04:00 | 1.026 | 1.096 |
| 2021-07-22 12:25:00-04:00 | 1.027 | 1.096 |
| 2021-07-22 12:30:00-04:00 | 1.029 | 1.096 |
| 2021-07-22 12:35:00-04:00 | 1.028 | 1.096 |
| 2021-07-22 12:40:00-04:00 | 1.029 | 1.096 |
| 2021-07-22 12:45:00-04:00 | 1.029 | 1.096 |
| 2021-07-22 12:50:00-04:00 | 1.03 | 1.096 |
| 2021-07-22 12:55:00-04:00 | 1.031 | 1.096 |
| 2021-07-22 13:00:00-04:00 | 1.031 | 1.096 |
| 2021-07-22 13:05:00-04:00 | 1.032 | 1.097 |
| 2021-07-22 13:10:00-04:00 | 1.032 | 1.097 |
| 2021-07-22 13:15:00-04:00 | 1.033 | 1.098 |
| 2021-07-22 13:20:00-04:00 | 1.033 | 1.098 |
| 2021-07-22 13:25:00-04:00 | 1.034 | 1.099 |
| 2021-07-22 13:30:00-04:00 | 1.033 | 1.098 |
| 2021-07-22 13:35:00-04:00 | 1.033 | 1.098 |
| 2021-07-22 13:40:00-04:00 | 1.032 | 1.097 |
| 2021-07-22 13:45:00-04:00 | 1.032 | 1.097 |
| 2021-07-22 13:50:00-04:00 | 1.032 | 1.097 |
| 2021-07-22 13:55:00-04:00 | 1.033 | 1.098 |
| 2021-07-22 14:00:00-04:00 | 1.032 | 1.097 |
| 2021-07-22 14:05:00-04:00 | 1.033 | 1.098 |
| 2021-07-22 14:10:00-04:00 | 1.035 | 1.1 |
| 2021-07-22 14:15:00-04:00 | 1.04 | 1.105 |
| 2021-07-22 14:20:00-04:00 | 1.041 | 1.106 |
| 2021-07-22 14:25:00-04:00 | 1.041 | 1.106 |
| 2021-07-22 14:30:00-04:00 | 1.041 | 1.106 |
| 2021-07-22 14:35:00-04:00 | 1.041 | 1.106 |
| 2021-07-22 14:40:00-04:00 | 1.041 | 1.106 |
| 2021-07-22 14:45:00-04:00 | 1.04 | 1.105 |
| 2021-07-22 14:50:00-04:00 | 1.04 | 1.105 |
| 2021-07-22 14:55:00-04:00 | 1.041 | 1.106 |
| 2021-07-22 15:00:00-04:00 | 1.042 | 1.107 |
| 2021-07-22 15:05:00-04:00 | 1.042 | 1.107 |
| 2021-07-22 15:10:00-04:00 | 1.041 | 1.106 |
| 2021-07-22 15:15:00-04:00 | 1.039 | 1.104 |
| 2021-07-22 15:20:00-04:00 | 1.039 | 1.104 |
| 2021-07-22 15:25:00-04:00 | 1.038 | 1.103 |
| 2021-07-22 15:30:00-04:00 | 1.039 | 1.104 |
| 2021-07-22 15:35:00-04:00 | 1.037 | 1.104 |
| 2021-07-22 15:40:00-04:00 | 1.036 | 1.104 |
| 2021-07-22 15:45:00-04:00 | 1.036 | 1.104 |
| 2021-07-22 15:50:00-04:00 | 1.035 | 1.104 |
| 2021-07-22 15:55:00-04:00 | 1.032 | 1.104 |
| 2021-07-23 09:30:00-04:00 | 1.032 | 1.104 |
| 2021-07-23 09:35:00-04:00 | 1.022 | 1.104 |
| 2021-07-23 09:40:00-04:00 | 1.023 | 1.104 |
| 2021-07-23 09:45:00-04:00 | 1.026 | 1.104 |
| 2021-07-23 09:50:00-04:00 | 1.024 | 1.104 |
| 2021-07-23 09:55:00-04:00 | 1.022 | 1.104 |
| 2021-07-23 10:00:00-04:00 | 1.023 | 1.104 |
| 2021-07-23 10:05:00-04:00 | 1.024 | 1.104 |
| 2021-07-23 10:10:00-04:00 | 1.022 | 1.104 |
| 2021-07-23 10:15:00-04:00 | 1.018 | 1.104 |
| 2021-07-23 10:20:00-04:00 | 1.02 | 1.104 |
| 2021-07-23 10:25:00-04:00 | 1.019 | 1.104 |
| 2021-07-23 10:30:00-04:00 | 1.019 | 1.104 |
| 2021-07-23 10:35:00-04:00 | 1.018 | 1.104 |
| 2021-07-23 10:40:00-04:00 | 1.02 | 1.104 |
| 2021-07-23 10:45:00-04:00 | 1.015 | 1.104 |
| 2021-07-23 10:50:00-04:00 | 1.016 | 1.104 |
| 2021-07-23 10:55:00-04:00 | 1.016 | 1.104 |
| 2021-07-23 11:00:00-04:00 | 1.017 | 1.104 |
| 2021-07-23 11:05:00-04:00 | 1.016 | 1.104 |
| 2021-07-23 11:10:00-04:00 | 1.016 | 1.104 |
| 2021-07-23 11:15:00-04:00 | 1.02 | 1.104 |
| 2021-07-23 11:20:00-04:00 | 1.019 | 1.104 |
| 2021-07-23 11:25:00-04:00 | 1.019 | 1.104 |
| 2021-07-23 11:30:00-04:00 | 1.019 | 1.104 |
| 2021-07-23 11:35:00-04:00 | 1.019 | 1.104 |
| 2021-07-23 11:40:00-04:00 | 1.02 | 1.105 |
| 2021-07-23 11:45:00-04:00 | 1.018 | 1.102 |
| 2021-07-23 11:50:00-04:00 | 1.018 | 1.102 |
| 2021-07-23 11:55:00-04:00 | 1.017 | 1.102 |
| 2021-07-23 12:00:00-04:00 | 1.017 | 1.102 |
| 2021-07-23 12:05:00-04:00 | 1.016 | 1.1 |
| 2021-07-23 12:10:00-04:00 | 1.016 | 1.1 |
| 2021-07-23 12:15:00-04:00 | 1.016 | 1.1 |
| 2021-07-23 12:20:00-04:00 | 1.017 | 1.1 |
| 2021-07-23 12:25:00-04:00 | 1.015 | 1.1 |
| 2021-07-23 12:30:00-04:00 | 1.015 | 1.1 |
| 2021-07-23 12:35:00-04:00 | 1.015 | 1.1 |
| 2021-07-23 12:40:00-04:00 | 1.017 | 1.1 |
| 2021-07-23 12:45:00-04:00 | 1.02 | 1.1 |
| 2021-07-23 12:50:00-04:00 | 1.021 | 1.1 |
| 2021-07-23 12:55:00-04:00 | 1.022 | 1.1 |
| 2021-07-23 13:00:00-04:00 | 1.023 | 1.101 |
| 2021-07-23 13:05:00-04:00 | 1.023 | 1.101 |
| 2021-07-23 13:10:00-04:00 | 1.024 | 1.102 |
| 2021-07-23 13:15:00-04:00 | 1.023 | 1.101 |
| 2021-07-23 13:20:00-04:00 | 1.024 | 1.103 |
| 2021-07-23 13:25:00-04:00 | 1.026 | 1.104 |
| 2021-07-23 13:30:00-04:00 | 1.026 | 1.104 |
| 2021-07-23 13:35:00-04:00 | 1.026 | 1.104 |
| 2021-07-23 13:40:00-04:00 | 1.027 | 1.105 |
| 2021-07-23 13:45:00-04:00 | 1.026 | 1.105 |
| 2021-07-23 13:50:00-04:00 | 1.026 | 1.105 |
| 2021-07-23 13:55:00-04:00 | 1.024 | 1.103 |
| 2021-07-23 14:00:00-04:00 | 1.024 | 1.103 |
| 2021-07-23 14:05:00-04:00 | 1.026 | 1.104 |
| 2021-07-23 14:10:00-04:00 | 1.027 | 1.105 |
| 2021-07-23 14:15:00-04:00 | 1.026 | 1.105 |
| 2021-07-23 14:20:00-04:00 | 1.027 | 1.105 |
| 2021-07-23 14:25:00-04:00 | 1.028 | 1.106 |
| 2021-07-23 14:30:00-04:00 | 1.029 | 1.107 |
| 2021-07-23 14:35:00-04:00 | 1.03 | 1.108 |
| 2021-07-23 14:40:00-04:00 | 1.031 | 1.109 |
| 2021-07-23 14:45:00-04:00 | 1.031 | 1.109 |
| 2021-07-23 14:50:00-04:00 | 1.03 | 1.108 |
| 2021-07-23 14:55:00-04:00 | 1.03 | 1.108 |
| 2021-07-23 15:00:00-04:00 | 1.029 | 1.107 |
| 2021-07-23 15:05:00-04:00 | 1.026 | 1.105 |
| 2021-07-23 15:10:00-04:00 | 1.026 | 1.104 |
| 2021-07-23 15:15:00-04:00 | 1.026 | 1.104 |
| 2021-07-23 15:20:00-04:00 | 1.025 | 1.104 |
| 2021-07-23 15:25:00-04:00 | 1.025 | 1.104 |
| 2021-07-23 15:30:00-04:00 | 1.025 | 1.104 |
| 2021-07-23 15:35:00-04:00 | 1.025 | 1.104 |
| 2021-07-23 15:40:00-04:00 | 1.026 | 1.104 |
| 2021-07-23 15:45:00-04:00 | 1.026 | 1.104 |
| 2021-07-23 15:50:00-04:00 | 1.027 | 1.104 |
| 2021-07-23 15:55:00-04:00 | 1.024 | 1.104 |
| 2021-07-26 09:30:00-04:00 | 1.023 | 1.104 |
| 2021-07-26 09:35:00-04:00 | 1.037 | 1.104 |
| 2021-07-26 09:40:00-04:00 | 1.035 | 1.104 |
| 2021-07-26 09:45:00-04:00 | 1.033 | 1.101 |
| 2021-07-26 09:50:00-04:00 | 1.031 | 1.099 |
| 2021-07-26 09:55:00-04:00 | 1.034 | 1.102 |
| 2021-07-26 10:00:00-04:00 | 1.036 | 1.104 |
| 2021-07-26 10:05:00-04:00 | 1.038 | 1.106 |
| 2021-07-26 10:10:00-04:00 | 1.045 | 1.113 |
| 2021-07-26 10:15:00-04:00 | 1.045 | 1.114 |
| 2021-07-26 10:20:00-04:00 | 1.045 | 1.114 |
| 2021-07-26 10:25:00-04:00 | 1.046 | 1.115 |
| 2021-07-26 10:30:00-04:00 | 1.05 | 1.119 |
| 2021-07-26 10:35:00-04:00 | 1.049 | 1.118 |
| 2021-07-26 10:40:00-04:00 | 1.05 | 1.118 |
| 2021-07-26 10:45:00-04:00 | 1.048 | 1.117 |
| 2021-07-26 10:50:00-04:00 | 1.047 | 1.115 |
| 2021-07-26 10:55:00-04:00 | 1.044 | 1.113 |
| 2021-07-26 11:00:00-04:00 | 1.045 | 1.114 |
| 2021-07-26 11:05:00-04:00 | 1.048 | 1.117 |
| 2021-07-26 11:10:00-04:00 | 1.049 | 1.117 |
| 2021-07-26 11:15:00-04:00 | 1.048 | 1.116 |
| 2021-07-26 11:20:00-04:00 | 1.047 | 1.115 |
| 2021-07-26 11:25:00-04:00 | 1.047 | 1.116 |
| 2021-07-26 11:30:00-04:00 | 1.046 | 1.116 |
| 2021-07-26 11:35:00-04:00 | 1.046 | 1.116 |
| 2021-07-26 11:40:00-04:00 | 1.049 | 1.116 |
| 2021-07-26 11:45:00-04:00 | 1.048 | 1.116 |
| 2021-07-26 11:50:00-04:00 | 1.054 | 1.116 |
| 2021-07-26 11:55:00-04:00 | 1.054 | 1.116 |
| 2021-07-26 12:00:00-04:00 | 1.055 | 1.117 |
| 2021-07-26 12:05:00-04:00 | 1.055 | 1.117 |
| 2021-07-26 12:10:00-04:00 | 1.057 | 1.119 |
| 2021-07-26 12:15:00-04:00 | 1.056 | 1.119 |
| 2021-07-26 12:20:00-04:00 | 1.057 | 1.119 |
| 2021-07-26 12:25:00-04:00 | 1.059 | 1.121 |
| 2021-07-26 12:30:00-04:00 | 1.059 | 1.122 |
| 2021-07-26 12:35:00-04:00 | 1.057 | 1.119 |
| 2021-07-26 12:40:00-04:00 | 1.057 | 1.119 |
| 2021-07-26 12:45:00-04:00 | 1.056 | 1.118 |
| 2021-07-26 12:50:00-04:00 | 1.052 | 1.114 |
| 2021-07-26 12:55:00-04:00 | 1.053 | 1.115 |
| 2021-07-26 13:00:00-04:00 | 1.054 | 1.116 |
| 2021-07-26 13:05:00-04:00 | 1.055 | 1.117 |
| 2021-07-26 13:10:00-04:00 | 1.056 | 1.117 |
| 2021-07-26 13:15:00-04:00 | 1.056 | 1.117 |
| 2021-07-26 13:20:00-04:00 | 1.057 | 1.117 |
| 2021-07-26 13:25:00-04:00 | 1.058 | 1.117 |
| 2021-07-26 13:30:00-04:00 | 1.058 | 1.117 |
| 2021-07-26 13:35:00-04:00 | 1.058 | 1.117 |
| 2021-07-26 13:40:00-04:00 | 1.055 | 1.114 |
| 2021-07-26 13:45:00-04:00 | 1.054 | 1.113 |
| 2021-07-26 13:50:00-04:00 | 1.054 | 1.112 |
| 2021-07-26 13:55:00-04:00 | 1.054 | 1.112 |
| 2021-07-26 14:00:00-04:00 | 1.05 | 1.109 |
| 2021-07-26 14:05:00-04:00 | 1.046 | 1.104 |
| 2021-07-26 14:10:00-04:00 | 1.044 | 1.104 |
| 2021-07-26 14:15:00-04:00 | 1.045 | 1.104 |
| 2021-07-26 14:20:00-04:00 | 1.041 | 1.104 |
| 2021-07-26 14:25:00-04:00 | 1.042 | 1.104 |
| 2021-07-26 14:30:00-04:00 | 1.042 | 1.104 |
| 2021-07-26 14:35:00-04:00 | 1.043 | 1.104 |
| 2021-07-26 14:40:00-04:00 | 1.044 | 1.104 |
| 2021-07-26 14:45:00-04:00 | 1.045 | 1.104 |
| 2021-07-26 14:50:00-04:00 | 1.046 | 1.104 |
| 2021-07-26 14:55:00-04:00 | 1.044 | 1.104 |
| 2021-07-26 15:00:00-04:00 | 1.043 | 1.104 |
| 2021-07-26 15:05:00-04:00 | 1.044 | 1.104 |
| 2021-07-26 15:10:00-04:00 | 1.044 | 1.104 |
| 2021-07-26 15:15:00-04:00 | 1.048 | 1.104 |
| 2021-07-26 15:20:00-04:00 | 1.046 | 1.103 |
| 2021-07-26 15:25:00-04:00 | 1.047 | 1.104 |
| 2021-07-26 15:30:00-04:00 | 1.048 | 1.104 |
| 2021-07-26 15:35:00-04:00 | 1.047 | 1.104 |
| 2021-07-26 15:40:00-04:00 | 1.047 | 1.103 |
| 2021-07-26 15:45:00-04:00 | 1.048 | 1.104 |
| 2021-07-26 15:50:00-04:00 | 1.042 | 1.099 |
| 2021-07-26 15:55:00-04:00 | 1.043 | 1.1 |
| 2021-07-27 09:30:00-04:00 | 1.046 | 1.103 |
| 2021-07-27 09:35:00-04:00 | 1.036 | 1.092 |
| 2021-07-27 09:40:00-04:00 | 1.039 | 1.092 |
| 2021-07-27 09:45:00-04:00 | 1.026 | 1.092 |
| 2021-07-27 09:50:00-04:00 | 1.028 | 1.092 |
| 2021-07-27 09:55:00-04:00 | 1.033 | 1.092 |
| 2021-07-27 10:00:00-04:00 | 1.026 | 1.092 |
| 2021-07-27 10:05:00-04:00 | 1.025 | 1.092 |
| 2021-07-27 10:10:00-04:00 | 1.022 | 1.092 |
| 2021-07-27 10:15:00-04:00 | 1.016 | 1.092 |
| 2021-07-27 10:20:00-04:00 | 1.02 | 1.092 |
| 2021-07-27 10:25:00-04:00 | 1.02 | 1.092 |
| 2021-07-27 10:30:00-04:00 | 1.023 | 1.092 |
| 2021-07-27 10:35:00-04:00 | 1.022 | 1.092 |
| 2021-07-27 10:40:00-04:00 | 1.027 | 1.092 |
| 2021-07-27 10:45:00-04:00 | 1.025 | 1.092 |
| 2021-07-27 10:50:00-04:00 | 1.029 | 1.092 |
| 2021-07-27 10:55:00-04:00 | 1.026 | 1.092 |
| 2021-07-27 11:00:00-04:00 | 1.023 | 1.092 |
| 2021-07-27 11:05:00-04:00 | 1.023 | 1.092 |
| 2021-07-27 11:10:00-04:00 | 1.022 | 1.091 |
| 2021-07-27 11:15:00-04:00 | 1.024 | 1.093 |
| 2021-07-27 11:20:00-04:00 | 1.019 | 1.089 |
| 2021-07-27 11:25:00-04:00 | 1.021 | 1.09 |
| 2021-07-27 11:30:00-04:00 | 1.017 | 1.087 |
| 2021-07-27 11:35:00-04:00 | 1.01 | 1.087 |
| 2021-07-27 11:40:00-04:00 | 1.006 | 1.087 |
| 2021-07-27 11:45:00-04:00 | 1.009 | 1.087 |
| 2021-07-27 11:50:00-04:00 | 1.01 | 1.087 |
| 2021-07-27 11:55:00-04:00 | 1.012 | 1.087 |
| 2021-07-27 12:00:00-04:00 | 1.013 | 1.087 |
| 2021-07-27 12:05:00-04:00 | 1.012 | 1.087 |
| 2021-07-27 12:10:00-04:00 | 1.013 | 1.087 |
| 2021-07-27 12:15:00-04:00 | 1.009 | 1.087 |
| 2021-07-27 12:20:00-04:00 | 1.009 | 1.087 |
| 2021-07-27 12:25:00-04:00 | 1.01 | 1.087 |
| 2021-07-27 12:30:00-04:00 | 1.01 | 1.087 |
| 2021-07-27 12:35:00-04:00 | 1.007 | 1.087 |
| 2021-07-27 12:40:00-04:00 | 1.008 | 1.087 |
| 2021-07-27 12:45:00-04:00 | 1.01 | 1.087 |
| 2021-07-27 12:50:00-04:00 | 1.008 | 1.087 |
| 2021-07-27 12:55:00-04:00 | 1.005 | 1.087 |
| 2021-07-27 13:00:00-04:00 | 1.003 | 1.087 |
| 2021-07-27 13:05:00-04:00 | 1.004 | 1.087 |
| 2021-07-27 13:10:00-04:00 | 1.007 | 1.087 |
| 2021-07-27 13:15:00-04:00 | 1.005 | 1.087 |
| 2021-07-27 13:20:00-04:00 | 1.001 | 1.087 |
| 2021-07-27 13:25:00-04:00 | 1 | 1.087 |
| 2021-07-27 13:30:00-04:00 | 1.001 | 1.087 |
| 2021-07-27 13:35:00-04:00 | 1.002 | 1.087 |
| 2021-07-27 13:40:00-04:00 | 1.002 | 1.087 |
| 2021-07-27 13:45:00-04:00 | 1.004 | 1.087 |
| 2021-07-27 13:50:00-04:00 | 1.009 | 1.087 |
| 2021-07-27 13:55:00-04:00 | 1.016 | 1.087 |
| 2021-07-27 14:00:00-04:00 | 1.017 | 1.087 |
| 2021-07-27 14:05:00-04:00 | 1.017 | 1.087 |
| 2021-07-27 14:10:00-04:00 | 1.021 | 1.091 |
| 2021-07-27 14:15:00-04:00 | 1.018 | 1.088 |
| 2021-07-27 14:20:00-04:00 | 1.023 | 1.093 |
| 2021-07-27 14:25:00-04:00 | 1.022 | 1.093 |
| 2021-07-27 14:30:00-04:00 | 1.021 | 1.091 |
| 2021-07-27 14:35:00-04:00 | 1.024 | 1.095 |
| 2021-07-27 14:40:00-04:00 | 1.023 | 1.093 |
| 2021-07-27 14:45:00-04:00 | 1.023 | 1.093 |
| 2021-07-27 14:50:00-04:00 | 1.021 | 1.091 |
| 2021-07-27 14:55:00-04:00 | 1.019 | 1.089 |
| 2021-07-27 15:00:00-04:00 | 1.023 | 1.094 |
| 2021-07-27 15:05:00-04:00 | 1.025 | 1.095 |
| 2021-07-27 15:10:00-04:00 | 1.027 | 1.097 |
| 2021-07-27 15:15:00-04:00 | 1.02 | 1.09 |
| 2021-07-27 15:20:00-04:00 | 1.022 | 1.092 |
| 2021-07-27 15:25:00-04:00 | 1.021 | 1.091 |
| 2021-07-27 15:30:00-04:00 | 1.024 | 1.094 |
| 2021-07-27 15:35:00-04:00 | 1.026 | 1.096 |
| 2021-07-27 15:40:00-04:00 | 1.025 | 1.096 |
| 2021-07-27 15:45:00-04:00 | 1.025 | 1.095 |
| 2021-07-27 15:50:00-04:00 | 1.024 | 1.094 |
| 2021-07-27 15:55:00-04:00 | 1.025 | 1.096 |
| 2021-07-28 09:30:00-04:00 | 1.026 | 1.096 |
| 2021-07-28 09:35:00-04:00 | 1.031 | 1.101 |
| 2021-07-28 09:40:00-04:00 | 1.026 | 1.097 |
| 2021-07-28 09:45:00-04:00 | 1.018 | 1.088 |
| 2021-07-28 09:50:00-04:00 | 1.023 | 1.094 |
| 2021-07-28 09:55:00-04:00 | 1.025 | 1.095 |
| 2021-07-28 10:00:00-04:00 | 1.03 | 1.1 |
| 2021-07-28 10:05:00-04:00 | 1.027 | 1.097 |
| 2021-07-28 10:10:00-04:00 | 1.034 | 1.105 |
| 2021-07-28 10:15:00-04:00 | 1.034 | 1.104 |
| 2021-07-28 10:20:00-04:00 | 1.04 | 1.11 |
| 2021-07-28 10:25:00-04:00 | 1.04 | 1.11 |
| 2021-07-28 10:30:00-04:00 | 1.036 | 1.106 |
| 2021-07-28 10:35:00-04:00 | 1.034 | 1.104 |
| 2021-07-28 10:40:00-04:00 | 1.032 | 1.102 |
| 2021-07-28 10:45:00-04:00 | 1.029 | 1.099 |
| 2021-07-28 10:50:00-04:00 | 1.032 | 1.102 |
| 2021-07-28 10:55:00-04:00 | 1.032 | 1.102 |
| 2021-07-28 11:00:00-04:00 | 1.03 | 1.101 |
| 2021-07-28 11:05:00-04:00 | 1.029 | 1.099 |
| 2021-07-28 11:10:00-04:00 | 1.03 | 1.099 |
| 2021-07-28 11:15:00-04:00 | 1.031 | 1.099 |
| 2021-07-28 11:20:00-04:00 | 1.033 | 1.099 |
| 2021-07-28 11:25:00-04:00 | 1.033 | 1.099 |
| 2021-07-28 11:30:00-04:00 | 1.029 | 1.099 |
| 2021-07-28 11:35:00-04:00 | 1.027 | 1.099 |
| 2021-07-28 11:40:00-04:00 | 1.026 | 1.099 |
| 2021-07-28 11:45:00-04:00 | 1.023 | 1.099 |
| 2021-07-28 11:50:00-04:00 | 1.024 | 1.099 |
| 2021-07-28 11:55:00-04:00 | 1.022 | 1.099 |
| 2021-07-28 12:00:00-04:00 | 1.026 | 1.099 |
| 2021-07-28 12:05:00-04:00 | 1.025 | 1.099 |
| 2021-07-28 12:10:00-04:00 | 1.027 | 1.099 |
| 2021-07-28 12:15:00-04:00 | 1.028 | 1.099 |
| 2021-07-28 12:20:00-04:00 | 1.026 | 1.099 |
| 2021-07-28 12:25:00-04:00 | 1.028 | 1.099 |
| 2021-07-28 12:30:00-04:00 | 1.028 | 1.099 |
| 2021-07-28 12:35:00-04:00 | 1.029 | 1.099 |
| 2021-07-28 12:40:00-04:00 | 1.026 | 1.096 |
| 2021-07-28 12:45:00-04:00 | 1.029 | 1.098 |
| 2021-07-28 12:50:00-04:00 | 1.028 | 1.098 |
| 2021-07-28 12:55:00-04:00 | 1.027 | 1.097 |
| 2021-07-28 13:00:00-04:00 | 1.029 | 1.098 |
| 2021-07-28 13:05:00-04:00 | 1.03 | 1.1 |
| 2021-07-28 13:10:00-04:00 | 1.03 | 1.1 |
| 2021-07-28 13:15:00-04:00 | 1.03 | 1.1 |
| 2021-07-28 13:20:00-04:00 | 1.026 | 1.096 |
| 2021-07-28 13:25:00-04:00 | 1.026 | 1.096 |
| 2021-07-28 13:30:00-04:00 | 1.026 | 1.096 |
| 2021-07-28 13:35:00-04:00 | 1.024 | 1.094 |
| 2021-07-28 13:40:00-04:00 | 1.026 | 1.094 |
| 2021-07-28 13:45:00-04:00 | 1.025 | 1.094 |
| 2021-07-28 13:50:00-04:00 | 1.027 | 1.094 |
| 2021-07-28 13:55:00-04:00 | 1.026 | 1.094 |
| 2021-07-28 14:00:00-04:00 | 1.027 | 1.094 |
| 2021-07-28 14:05:00-04:00 | 1.027 | 1.094 |
| 2021-07-28 14:10:00-04:00 | 1.024 | 1.094 |
| 2021-07-28 14:15:00-04:00 | 1.026 | 1.094 |
| 2021-07-28 14:20:00-04:00 | 1.025 | 1.094 |
| 2021-07-28 14:25:00-04:00 | 1.027 | 1.094 |
| 2021-07-28 14:30:00-04:00 | 1.027 | 1.094 |
| 2021-07-28 14:35:00-04:00 | 1.028 | 1.094 |
| 2021-07-28 14:40:00-04:00 | 1.027 | 1.093 |
| 2021-07-28 14:45:00-04:00 | 1.028 | 1.094 |
| 2021-07-28 14:50:00-04:00 | 1.028 | 1.094 |
| 2021-07-28 14:55:00-04:00 | 1.026 | 1.092 |
| 2021-07-28 15:00:00-04:00 | 1.026 | 1.092 |
| 2021-07-28 15:05:00-04:00 | 1.026 | 1.092 |
| 2021-07-28 15:10:00-04:00 | 1.026 | 1.092 |
| 2021-07-28 15:15:00-04:00 | 1.026 | 1.092 |
| 2021-07-28 15:20:00-04:00 | 1.028 | 1.094 |
| 2021-07-28 15:25:00-04:00 | 1.027 | 1.093 |
| 2021-07-28 15:30:00-04:00 | 1.03 | 1.096 |
| 2021-07-28 15:35:00-04:00 | 1.033 | 1.099 |
| 2021-07-28 15:40:00-04:00 | 1.032 | 1.098 |
| 2021-07-28 15:45:00-04:00 | 1.033 | 1.099 |
| 2021-07-28 15:50:00-04:00 | 1.032 | 1.098 |
| 2021-07-28 15:55:00-04:00 | 1.03 | 1.096 |
| 2021-07-29 09:30:00-04:00 | 1.029 | 1.095 |
| 2021-07-29 09:35:00-04:00 | 1.039 | 1.105 |
| 2021-07-29 09:40:00-04:00 | 1.045 | 1.111 |
| 2021-07-29 09:45:00-04:00 | 1.047 | 1.113 |
| 2021-07-29 09:50:00-04:00 | 1.051 | 1.117 |
| 2021-07-29 09:55:00-04:00 | 1.051 | 1.116 |
| 2021-07-29 10:00:00-04:00 | 1.049 | 1.115 |
| 2021-07-29 10:05:00-04:00 | 1.048 | 1.114 |
| 2021-07-29 10:10:00-04:00 | 1.046 | 1.112 |
| 2021-07-29 10:15:00-04:00 | 1.048 | 1.114 |
| 2021-07-29 10:20:00-04:00 | 1.054 | 1.12 |
| 2021-07-29 10:25:00-04:00 | 1.058 | 1.124 |
| 2021-07-29 10:30:00-04:00 | 1.067 | 1.133 |
| 2021-07-29 10:35:00-04:00 | 1.065 | 1.131 |
| 2021-07-29 10:40:00-04:00 | 1.071 | 1.137 |
| 2021-07-29 10:45:00-04:00 | 1.071 | 1.137 |
| 2021-07-29 10:50:00-04:00 | 1.069 | 1.135 |
| 2021-07-29 10:55:00-04:00 | 1.069 | 1.135 |
| 2021-07-29 11:00:00-04:00 | 1.072 | 1.138 |
| 2021-07-29 11:05:00-04:00 | 1.074 | 1.14 |
| 2021-07-29 11:10:00-04:00 | 1.072 | 1.138 |
| 2021-07-29 11:15:00-04:00 | 1.075 | 1.141 |
| 2021-07-29 11:20:00-04:00 | 1.077 | 1.143 |
| 2021-07-29 11:25:00-04:00 | 1.078 | 1.144 |
| 2021-07-29 11:30:00-04:00 | 1.078 | 1.144 |
| 2021-07-29 11:35:00-04:00 | 1.076 | 1.142 |
| 2021-07-29 11:40:00-04:00 | 1.075 | 1.141 |
| 2021-07-29 11:45:00-04:00 | 1.077 | 1.142 |
| 2021-07-29 11:50:00-04:00 | 1.077 | 1.143 |
| 2021-07-29 11:55:00-04:00 | 1.076 | 1.142 |
| 2021-07-29 12:00:00-04:00 | 1.076 | 1.142 |
| 2021-07-29 12:05:00-04:00 | 1.076 | 1.142 |
| 2021-07-29 12:10:00-04:00 | 1.074 | 1.14 |
| 2021-07-29 12:15:00-04:00 | 1.075 | 1.141 |
| 2021-07-29 12:20:00-04:00 | 1.077 | 1.143 |
| 2021-07-29 12:25:00-04:00 | 1.076 | 1.142 |
| 2021-07-29 12:30:00-04:00 | 1.076 | 1.142 |
| 2021-07-29 12:35:00-04:00 | 1.074 | 1.142 |
| 2021-07-29 12:40:00-04:00 | 1.075 | 1.142 |
| 2021-07-29 12:45:00-04:00 | 1.072 | 1.142 |
| 2021-07-29 12:50:00-04:00 | 1.071 | 1.142 |
| 2021-07-29 12:55:00-04:00 | 1.069 | 1.142 |
| 2021-07-29 13:00:00-04:00 | 1.071 | 1.142 |
| 2021-07-29 13:05:00-04:00 | 1.07 | 1.142 |
| 2021-07-29 13:10:00-04:00 | 1.071 | 1.142 |
| 2021-07-29 13:15:00-04:00 | 1.072 | 1.142 |
| 2021-07-29 13:20:00-04:00 | 1.073 | 1.142 |
| 2021-07-29 13:25:00-04:00 | 1.075 | 1.142 |
| 2021-07-29 13:30:00-04:00 | 1.074 | 1.142 |
| 2021-07-29 13:35:00-04:00 | 1.075 | 1.142 |
| 2021-07-29 13:40:00-04:00 | 1.077 | 1.142 |
| 2021-07-29 13:45:00-04:00 | 1.081 | 1.146 |
| 2021-07-29 13:50:00-04:00 | 1.084 | 1.149 |
| 2021-07-29 13:55:00-04:00 | 1.08 | 1.145 |
| 2021-07-29 14:00:00-04:00 | 1.082 | 1.147 |
| 2021-07-29 14:05:00-04:00 | 1.081 | 1.146 |
| 2021-07-29 14:10:00-04:00 | 1.08 | 1.145 |
| 2021-07-29 14:15:00-04:00 | 1.08 | 1.145 |
| 2021-07-29 14:20:00-04:00 | 1.076 | 1.141 |
| 2021-07-29 14:25:00-04:00 | 1.077 | 1.142 |
| 2021-07-29 14:30:00-04:00 | 1.078 | 1.143 |
| 2021-07-29 14:35:00-04:00 | 1.079 | 1.144 |
| 2021-07-29 14:40:00-04:00 | 1.078 | 1.143 |
| 2021-07-29 14:45:00-04:00 | 1.077 | 1.141 |
| 2021-07-29 14:50:00-04:00 | 1.078 | 1.141 |
| 2021-07-29 14:55:00-04:00 | 1.078 | 1.141 |
| 2021-07-29 15:00:00-04:00 | 1.078 | 1.141 |
| 2021-07-29 15:05:00-04:00 | 1.077 | 1.141 |
| 2021-07-29 15:10:00-04:00 | 1.078 | 1.141 |
| 2021-07-29 15:15:00-04:00 | 1.077 | 1.141 |
| 2021-07-29 15:20:00-04:00 | 1.076 | 1.141 |
| 2021-07-29 15:25:00-04:00 | 1.076 | 1.141 |
| 2021-07-29 15:30:00-04:00 | 1.074 | 1.141 |
| 2021-07-29 15:35:00-04:00 | 1.073 | 1.141 |
| 2021-07-29 15:40:00-04:00 | 1.077 | 1.141 |
| 2021-07-29 15:45:00-04:00 | 1.073 | 1.141 |
| 2021-07-29 15:50:00-04:00 | 1.072 | 1.141 |
| 2021-07-29 15:55:00-04:00 | 1.072 | 1.141 |
| 2021-07-30 09:30:00-04:00 | 1.075 | 1.141 |
| 2021-07-30 09:35:00-04:00 | 1.066 | 1.141 |
| 2021-07-30 09:40:00-04:00 | 1.067 | 1.141 |
| 2021-07-30 09:45:00-04:00 | 1.066 | 1.141 |
| 2021-07-30 09:50:00-04:00 | 1.079 | 1.141 |
| 2021-07-30 09:55:00-04:00 | 1.084 | 1.141 |
| 2021-07-30 10:00:00-04:00 | 1.085 | 1.141 |
| 2021-07-30 10:05:00-04:00 | 1.093 | 1.141 |
| 2021-07-30 10:10:00-04:00 | 1.09 | 1.138 |
| 2021-07-30 10:15:00-04:00 | 1.089 | 1.138 |
| 2021-07-30 10:20:00-04:00 | 1.082 | 1.131 |
| 2021-07-30 10:25:00-04:00 | 1.084 | 1.133 |
| 2021-07-30 10:30:00-04:00 | 1.087 | 1.136 |
| 2021-07-30 10:35:00-04:00 | 1.085 | 1.134 |
| 2021-07-30 10:40:00-04:00 | 1.086 | 1.135 |
| 2021-07-30 10:45:00-04:00 | 1.095 | 1.144 |
| 2021-07-30 10:50:00-04:00 | 1.091 | 1.14 |
| 2021-07-30 10:55:00-04:00 | 1.092 | 1.14 |
| 2021-07-30 11:00:00-04:00 | 1.093 | 1.142 |
| 2021-07-30 11:05:00-04:00 | 1.097 | 1.146 |
| 2021-07-30 11:10:00-04:00 | 1.096 | 1.144 |
| 2021-07-30 11:15:00-04:00 | 1.09 | 1.139 |
| 2021-07-30 11:20:00-04:00 | 1.089 | 1.138 |
| 2021-07-30 11:25:00-04:00 | 1.089 | 1.138 |
| 2021-07-30 11:30:00-04:00 | 1.09 | 1.139 |
| 2021-07-30 11:35:00-04:00 | 1.09 | 1.138 |
| 2021-07-30 11:40:00-04:00 | 1.092 | 1.141 |
| 2021-07-30 11:45:00-04:00 | 1.094 | 1.143 |
| 2021-07-30 11:50:00-04:00 | 1.095 | 1.143 |
| 2021-07-30 11:55:00-04:00 | 1.094 | 1.143 |
| 2021-07-30 12:00:00-04:00 | 1.097 | 1.143 |
| 2021-07-30 12:05:00-04:00 | 1.099 | 1.143 |
| 2021-07-30 12:10:00-04:00 | 1.094 | 1.139 |
| 2021-07-30 12:15:00-04:00 | 1.096 | 1.141 |
| 2021-07-30 12:20:00-04:00 | 1.098 | 1.143 |
| 2021-07-30 12:25:00-04:00 | 1.097 | 1.141 |
| 2021-07-30 12:30:00-04:00 | 1.098 | 1.143 |
| 2021-07-30 12:35:00-04:00 | 1.099 | 1.144 |
| 2021-07-30 12:40:00-04:00 | 1.101 | 1.146 |
| 2021-07-30 12:45:00-04:00 | 1.102 | 1.147 |
| 2021-07-30 12:50:00-04:00 | 1.103 | 1.148 |
| 2021-07-30 12:55:00-04:00 | 1.104 | 1.149 |
| 2021-07-30 13:00:00-04:00 | 1.103 | 1.147 |
| 2021-07-30 13:05:00-04:00 | 1.099 | 1.144 |
| 2021-07-30 13:10:00-04:00 | 1.1 | 1.144 |
| 2021-07-30 13:15:00-04:00 | 1.098 | 1.143 |
| 2021-07-30 13:20:00-04:00 | 1.095 | 1.14 |
| 2021-07-30 13:25:00-04:00 | 1.094 | 1.139 |
| 2021-07-30 13:30:00-04:00 | 1.096 | 1.141 |
| 2021-07-30 13:35:00-04:00 | 1.096 | 1.141 |
| 2021-07-30 13:40:00-04:00 | 1.097 | 1.141 |
| 2021-07-30 13:45:00-04:00 | 1.093 | 1.141 |
| 2021-07-30 13:50:00-04:00 | 1.094 | 1.141 |
| 2021-07-30 13:55:00-04:00 | 1.091 | 1.141 |
| 2021-07-30 14:00:00-04:00 | 1.093 | 1.141 |
| 2021-07-30 14:05:00-04:00 | 1.091 | 1.141 |
| 2021-07-30 14:10:00-04:00 | 1.093 | 1.141 |
| 2021-07-30 14:15:00-04:00 | 1.091 | 1.141 |
| 2021-07-30 14:20:00-04:00 | 1.091 | 1.141 |
| 2021-07-30 14:25:00-04:00 | 1.09 | 1.141 |
| 2021-07-30 14:30:00-04:00 | 1.087 | 1.141 |
| 2021-07-30 14:35:00-04:00 | 1.085 | 1.141 |
| 2021-07-30 14:40:00-04:00 | 1.083 | 1.141 |
| 2021-07-30 14:45:00-04:00 | 1.084 | 1.141 |
| 2021-07-30 14:50:00-04:00 | 1.086 | 1.141 |
| 2021-07-30 14:55:00-04:00 | 1.086 | 1.141 |
| 2021-07-30 15:00:00-04:00 | 1.084 | 1.141 |
| 2021-07-30 15:05:00-04:00 | 1.087 | 1.141 |
| 2021-07-30 15:10:00-04:00 | 1.086 | 1.141 |
| 2021-07-30 15:15:00-04:00 | 1.084 | 1.141 |
| 2021-07-30 15:20:00-04:00 | 1.086 | 1.141 |
| 2021-07-30 15:25:00-04:00 | 1.083 | 1.141 |
| 2021-07-30 15:30:00-04:00 | 1.086 | 1.141 |
| 2021-07-30 15:35:00-04:00 | 1.085 | 1.141 |
| 2021-07-30 15:40:00-04:00 | 1.084 | 1.141 |
| 2021-07-30 15:45:00-04:00 | 1.084 | 1.141 |
| 2021-07-30 15:50:00-04:00 | 1.084 | 1.141 |
| 2021-07-30 15:55:00-04:00 | 1.087 | 1.141 |
| 2021-08-02 09:30:00-04:00 | 1.09 | 1.141 |
| 2021-08-02 09:35:00-04:00 | 1.12 | 1.172 |
| 2021-08-02 09:40:00-04:00 | 1.124 | 1.175 |
| 2021-08-02 09:45:00-04:00 | 1.124 | 1.175 |
| 2021-08-02 09:50:00-04:00 | 1.128 | 1.18 |
| 2021-08-02 09:55:00-04:00 | 1.131 | 1.183 |
| 2021-08-02 10:00:00-04:00 | 1.135 | 1.186 |
| 2021-08-02 10:05:00-04:00 | 1.137 | 1.188 |
| 2021-08-02 10:10:00-04:00 | 1.132 | 1.184 |
| 2021-08-02 10:15:00-04:00 | 1.138 | 1.19 |
| 2021-08-02 10:20:00-04:00 | 1.142 | 1.193 |
| 2021-08-02 10:25:00-04:00 | 1.14 | 1.191 |
| 2021-08-02 10:30:00-04:00 | 1.139 | 1.191 |
| 2021-08-02 10:35:00-04:00 | 1.136 | 1.188 |
| 2021-08-02 10:40:00-04:00 | 1.14 | 1.191 |
| 2021-08-02 10:45:00-04:00 | 1.142 | 1.194 |
| 2021-08-02 10:50:00-04:00 | 1.144 | 1.195 |
| 2021-08-02 10:55:00-04:00 | 1.143 | 1.194 |
| 2021-08-02 11:00:00-04:00 | 1.144 | 1.195 |
| 2021-08-02 11:05:00-04:00 | 1.141 | 1.193 |
| 2021-08-02 11:10:00-04:00 | 1.139 | 1.19 |
| 2021-08-02 11:15:00-04:00 | 1.142 | 1.194 |
| 2021-08-02 11:20:00-04:00 | 1.138 | 1.19 |
| 2021-08-02 11:25:00-04:00 | 1.139 | 1.19 |
| 2021-08-02 11:30:00-04:00 | 1.136 | 1.187 |
| 2021-08-02 11:35:00-04:00 | 1.133 | 1.187 |
| 2021-08-02 11:40:00-04:00 | 1.134 | 1.187 |
| 2021-08-02 11:45:00-04:00 | 1.135 | 1.187 |
| 2021-08-02 11:50:00-04:00 | 1.137 | 1.187 |
| 2021-08-02 11:55:00-04:00 | 1.134 | 1.187 |
| 2021-08-02 12:00:00-04:00 | 1.13 | 1.187 |
| 2021-08-02 12:05:00-04:00 | 1.13 | 1.187 |
| 2021-08-02 12:10:00-04:00 | 1.127 | 1.187 |
| 2021-08-02 12:15:00-04:00 | 1.13 | 1.187 |
| 2021-08-02 12:20:00-04:00 | 1.134 | 1.187 |
| 2021-08-02 12:25:00-04:00 | 1.136 | 1.187 |
| 2021-08-02 12:30:00-04:00 | 1.136 | 1.187 |
| 2021-08-02 12:35:00-04:00 | 1.134 | 1.187 |
| 2021-08-02 12:40:00-04:00 | 1.134 | 1.187 |
| 2021-08-02 12:45:00-04:00 | 1.137 | 1.187 |
| 2021-08-02 12:50:00-04:00 | 1.138 | 1.187 |
| 2021-08-02 12:55:00-04:00 | 1.139 | 1.188 |
| 2021-08-02 13:00:00-04:00 | 1.135 | 1.184 |
| 2021-08-02 13:05:00-04:00 | 1.136 | 1.185 |
| 2021-08-02 13:10:00-04:00 | 1.134 | 1.183 |
| 2021-08-02 13:15:00-04:00 | 1.134 | 1.183 |
| 2021-08-02 13:20:00-04:00 | 1.131 | 1.18 |
| 2021-08-02 13:25:00-04:00 | 1.131 | 1.18 |
| 2021-08-02 13:30:00-04:00 | 1.13 | 1.179 |
| 2021-08-02 13:35:00-04:00 | 1.132 | 1.179 |
| 2021-08-02 13:40:00-04:00 | 1.13 | 1.179 |
| 2021-08-02 13:45:00-04:00 | 1.128 | 1.179 |
| 2021-08-02 13:50:00-04:00 | 1.128 | 1.179 |
| 2021-08-02 13:55:00-04:00 | 1.127 | 1.179 |
| 2021-08-02 14:00:00-04:00 | 1.13 | 1.179 |
| 2021-08-02 14:05:00-04:00 | 1.129 | 1.179 |
| 2021-08-02 14:10:00-04:00 | 1.131 | 1.179 |
| 2021-08-02 14:15:00-04:00 | 1.131 | 1.179 |
| 2021-08-02 14:20:00-04:00 | 1.131 | 1.179 |
| 2021-08-02 14:25:00-04:00 | 1.133 | 1.179 |
| 2021-08-02 14:30:00-04:00 | 1.132 | 1.179 |
| 2021-08-02 14:35:00-04:00 | 1.133 | 1.179 |
| 2021-08-02 14:40:00-04:00 | 1.133 | 1.179 |
| 2021-08-02 14:45:00-04:00 | 1.135 | 1.181 |
| 2021-08-02 14:50:00-04:00 | 1.131 | 1.177 |
| 2021-08-02 14:55:00-04:00 | 1.132 | 1.178 |
| 2021-08-02 15:00:00-04:00 | 1.13 | 1.176 |
| 2021-08-02 15:05:00-04:00 | 1.13 | 1.176 |
| 2021-08-02 15:10:00-04:00 | 1.128 | 1.174 |
| 2021-08-02 15:15:00-04:00 | 1.128 | 1.174 |
| 2021-08-02 15:20:00-04:00 | 1.129 | 1.174 |
| 2021-08-02 15:25:00-04:00 | 1.127 | 1.174 |
| 2021-08-02 15:30:00-04:00 | 1.124 | 1.174 |
| 2021-08-02 15:35:00-04:00 | 1.125 | 1.174 |
| 2021-08-02 15:40:00-04:00 | 1.122 | 1.174 |
| 2021-08-02 15:45:00-04:00 | 1.119 | 1.174 |
| 2021-08-02 15:50:00-04:00 | 1.118 | 1.174 |
| 2021-08-02 15:55:00-04:00 | 1.121 | 1.174 |
| 2021-08-03 09:30:00-04:00 | 1.121 | 1.174 |
| 2021-08-03 09:35:00-04:00 | 1.135 | 1.174 |
| 2021-08-03 09:40:00-04:00 | 1.131 | 1.174 |
| 2021-08-03 09:45:00-04:00 | 1.135 | 1.174 |
| 2021-08-03 09:50:00-04:00 | 1.132 | 1.174 |
| 2021-08-03 09:55:00-04:00 | 1.125 | 1.174 |
| 2021-08-03 10:00:00-04:00 | 1.124 | 1.173 |
| 2021-08-03 10:05:00-04:00 | 1.126 | 1.175 |
| 2021-08-03 10:10:00-04:00 | 1.115 | 1.163 |
| 2021-08-03 10:15:00-04:00 | 1.119 | 1.167 |
| 2021-08-03 10:20:00-04:00 | 1.12 | 1.169 |
| 2021-08-03 10:25:00-04:00 | 1.122 | 1.171 |
| 2021-08-03 10:30:00-04:00 | 1.119 | 1.171 |
| 2021-08-03 10:35:00-04:00 | 1.113 | 1.171 |
| 2021-08-03 10:40:00-04:00 | 1.116 | 1.171 |
| 2021-08-03 10:45:00-04:00 | 1.115 | 1.171 |
| 2021-08-03 10:50:00-04:00 | 1.117 | 1.171 |
| 2021-08-03 10:55:00-04:00 | 1.116 | 1.171 |
| 2021-08-03 11:00:00-04:00 | 1.115 | 1.171 |
| 2021-08-03 11:05:00-04:00 | 1.118 | 1.171 |
| 2021-08-03 11:10:00-04:00 | 1.119 | 1.171 |
| 2021-08-03 11:15:00-04:00 | 1.115 | 1.171 |
| 2021-08-03 11:20:00-04:00 | 1.112 | 1.171 |
| 2021-08-03 11:25:00-04:00 | 1.112 | 1.171 |
| 2021-08-03 11:30:00-04:00 | 1.112 | 1.171 |
| 2021-08-03 11:35:00-04:00 | 1.114 | 1.171 |
| 2021-08-03 11:40:00-04:00 | 1.114 | 1.171 |
| 2021-08-03 11:45:00-04:00 | 1.118 | 1.171 |
| 2021-08-03 11:50:00-04:00 | 1.12 | 1.171 |
| 2021-08-03 11:55:00-04:00 | 1.119 | 1.171 |
| 2021-08-03 12:00:00-04:00 | 1.122 | 1.171 |
| 2021-08-03 12:05:00-04:00 | 1.12 | 1.169 |
| 2021-08-03 12:10:00-04:00 | 1.119 | 1.168 |
| 2021-08-03 12:15:00-04:00 | 1.118 | 1.167 |
| 2021-08-03 12:20:00-04:00 | 1.119 | 1.168 |
| 2021-08-03 12:25:00-04:00 | 1.118 | 1.167 |
| 2021-08-03 12:30:00-04:00 | 1.117 | 1.166 |
| 2021-08-03 12:35:00-04:00 | 1.117 | 1.166 |
| 2021-08-03 12:40:00-04:00 | 1.117 | 1.166 |
| 2021-08-03 12:45:00-04:00 | 1.117 | 1.166 |
| 2021-08-03 12:50:00-04:00 | 1.117 | 1.166 |
| 2021-08-03 12:55:00-04:00 | 1.118 | 1.166 |
| 2021-08-03 13:00:00-04:00 | 1.119 | 1.166 |
| 2021-08-03 13:05:00-04:00 | 1.12 | 1.166 |
| 2021-08-03 13:10:00-04:00 | 1.12 | 1.166 |
| 2021-08-03 13:15:00-04:00 | 1.119 | 1.166 |
| 2021-08-03 13:20:00-04:00 | 1.118 | 1.166 |
| 2021-08-03 13:25:00-04:00 | 1.118 | 1.166 |
| 2021-08-03 13:30:00-04:00 | 1.118 | 1.165 |
| 2021-08-03 13:35:00-04:00 | 1.119 | 1.167 |
| 2021-08-03 13:40:00-04:00 | 1.119 | 1.167 |
| 2021-08-03 13:45:00-04:00 | 1.12 | 1.168 |
| 2021-08-03 13:50:00-04:00 | 1.12 | 1.168 |
| 2021-08-03 13:55:00-04:00 | 1.124 | 1.172 |
| 2021-08-03 14:00:00-04:00 | 1.123 | 1.171 |
| 2021-08-03 14:05:00-04:00 | 1.121 | 1.169 |
| 2021-08-03 14:10:00-04:00 | 1.121 | 1.169 |
| 2021-08-03 14:15:00-04:00 | 1.121 | 1.169 |
| 2021-08-03 14:20:00-04:00 | 1.123 | 1.171 |
| 2021-08-03 14:25:00-04:00 | 1.122 | 1.17 |
| 2021-08-03 14:30:00-04:00 | 1.124 | 1.171 |
| 2021-08-03 14:35:00-04:00 | 1.123 | 1.171 |
| 2021-08-03 14:40:00-04:00 | 1.124 | 1.172 |
| 2021-08-03 14:45:00-04:00 | 1.124 | 1.172 |
| 2021-08-03 14:50:00-04:00 | 1.122 | 1.169 |
| 2021-08-03 14:55:00-04:00 | 1.123 | 1.171 |
| 2021-08-03 15:00:00-04:00 | 1.124 | 1.172 |
| 2021-08-03 15:05:00-04:00 | 1.123 | 1.171 |
| 2021-08-03 15:10:00-04:00 | 1.124 | 1.172 |
| 2021-08-03 15:15:00-04:00 | 1.122 | 1.17 |
| 2021-08-03 15:20:00-04:00 | 1.121 | 1.169 |
| 2021-08-03 15:25:00-04:00 | 1.121 | 1.169 |
| 2021-08-03 15:30:00-04:00 | 1.12 | 1.169 |
| 2021-08-03 15:35:00-04:00 | 1.121 | 1.169 |
| 2021-08-03 15:40:00-04:00 | 1.121 | 1.169 |
| 2021-08-03 15:45:00-04:00 | 1.121 | 1.169 |
| 2021-08-03 15:50:00-04:00 | 1.121 | 1.169 |
| 2021-08-03 15:55:00-04:00 | 1.122 | 1.169 |
| 2021-08-04 09:30:00-04:00 | 1.122 | 1.169 |
| 2021-08-04 09:35:00-04:00 | 1.125 | 1.169 |
| 2021-08-04 09:40:00-04:00 | 1.122 | 1.169 |
| 2021-08-04 09:45:00-04:00 | 1.126 | 1.169 |
| 2021-08-04 09:50:00-04:00 | 1.124 | 1.167 |
| 2021-08-04 09:55:00-04:00 | 1.122 | 1.165 |
| 2021-08-04 10:00:00-04:00 | 1.122 | 1.165 |
| 2021-08-04 10:05:00-04:00 | 1.122 | 1.165 |
| 2021-08-04 10:10:00-04:00 | 1.123 | 1.166 |
| 2021-08-04 10:15:00-04:00 | 1.125 | 1.168 |
| 2021-08-04 10:20:00-04:00 | 1.126 | 1.169 |
| 2021-08-04 10:25:00-04:00 | 1.132 | 1.175 |
| 2021-08-04 10:30:00-04:00 | 1.131 | 1.174 |
| 2021-08-04 10:35:00-04:00 | 1.13 | 1.173 |
| 2021-08-04 10:40:00-04:00 | 1.13 | 1.173 |
| 2021-08-04 10:45:00-04:00 | 1.132 | 1.175 |
| 2021-08-04 10:50:00-04:00 | 1.133 | 1.176 |
| 2021-08-04 10:55:00-04:00 | 1.13 | 1.173 |
| 2021-08-04 11:00:00-04:00 | 1.134 | 1.177 |
| 2021-08-04 11:05:00-04:00 | 1.14 | 1.183 |
| 2021-08-04 11:10:00-04:00 | 1.138 | 1.181 |
| 2021-08-04 11:15:00-04:00 | 1.138 | 1.18 |
| 2021-08-04 11:20:00-04:00 | 1.142 | 1.184 |
| 2021-08-04 11:25:00-04:00 | 1.137 | 1.18 |
| 2021-08-04 11:30:00-04:00 | 1.135 | 1.178 |
| 2021-08-04 11:35:00-04:00 | 1.135 | 1.178 |
| 2021-08-04 11:40:00-04:00 | 1.131 | 1.174 |
| 2021-08-04 11:45:00-04:00 | 1.13 | 1.173 |
| 2021-08-04 11:50:00-04:00 | 1.131 | 1.174 |
| 2021-08-04 11:55:00-04:00 | 1.13 | 1.173 |
| 2021-08-04 12:00:00-04:00 | 1.131 | 1.173 |
| 2021-08-04 12:05:00-04:00 | 1.13 | 1.173 |
| 2021-08-04 12:10:00-04:00 | 1.129 | 1.173 |
| 2021-08-04 12:15:00-04:00 | 1.127 | 1.173 |
| 2021-08-04 12:20:00-04:00 | 1.127 | 1.173 |
| 2021-08-04 12:25:00-04:00 | 1.127 | 1.173 |
| 2021-08-04 12:30:00-04:00 | 1.126 | 1.173 |
| 2021-08-04 12:35:00-04:00 | 1.126 | 1.173 |
| 2021-08-04 12:40:00-04:00 | 1.126 | 1.173 |
| 2021-08-04 12:45:00-04:00 | 1.125 | 1.173 |
| 2021-08-04 12:50:00-04:00 | 1.125 | 1.173 |
| 2021-08-04 12:55:00-04:00 | 1.126 | 1.173 |
| 2021-08-04 13:00:00-04:00 | 1.128 | 1.173 |
| 2021-08-04 13:05:00-04:00 | 1.128 | 1.173 |
| 2021-08-04 13:10:00-04:00 | 1.13 | 1.173 |
| 2021-08-04 13:15:00-04:00 | 1.128 | 1.173 |
| 2021-08-04 13:20:00-04:00 | 1.129 | 1.173 |
| 2021-08-04 13:25:00-04:00 | 1.127 | 1.171 |
| 2021-08-04 13:30:00-04:00 | 1.128 | 1.172 |
| 2021-08-04 13:35:00-04:00 | 1.126 | 1.17 |
| 2021-08-04 13:40:00-04:00 | 1.125 | 1.169 |
| 2021-08-04 13:45:00-04:00 | 1.126 | 1.17 |
| 2021-08-04 13:50:00-04:00 | 1.125 | 1.169 |
| 2021-08-04 13:55:00-04:00 | 1.126 | 1.17 |
| 2021-08-04 14:00:00-04:00 | 1.125 | 1.17 |
| 2021-08-04 14:05:00-04:00 | 1.124 | 1.17 |
| 2021-08-04 14:10:00-04:00 | 1.124 | 1.17 |
| 2021-08-04 14:15:00-04:00 | 1.124 | 1.17 |
| 2021-08-04 14:20:00-04:00 | 1.124 | 1.17 |
| 2021-08-04 14:25:00-04:00 | 1.123 | 1.17 |
| 2021-08-04 14:30:00-04:00 | 1.123 | 1.17 |
| 2021-08-04 14:35:00-04:00 | 1.122 | 1.17 |
| 2021-08-04 14:40:00-04:00 | 1.122 | 1.17 |
| 2021-08-04 14:45:00-04:00 | 1.122 | 1.17 |
| 2021-08-04 14:50:00-04:00 | 1.124 | 1.17 |
| 2021-08-04 14:55:00-04:00 | 1.124 | 1.17 |
| 2021-08-04 15:00:00-04:00 | 1.123 | 1.17 |
| 2021-08-04 15:05:00-04:00 | 1.124 | 1.17 |
| 2021-08-04 15:10:00-04:00 | 1.124 | 1.17 |
| 2021-08-04 15:15:00-04:00 | 1.123 | 1.17 |
| 2021-08-04 15:20:00-04:00 | 1.121 | 1.17 |
| 2021-08-04 15:25:00-04:00 | 1.121 | 1.17 |
| 2021-08-04 15:30:00-04:00 | 1.124 | 1.172 |
| 2021-08-04 15:35:00-04:00 | 1.124 | 1.172 |
| 2021-08-04 15:40:00-04:00 | 1.123 | 1.171 |
| 2021-08-04 15:45:00-04:00 | 1.123 | 1.172 |
| 2021-08-04 15:50:00-04:00 | 1.123 | 1.172 |
| 2021-08-04 15:55:00-04:00 | 1.124 | 1.172 |
| 2021-08-05 09:30:00-04:00 | 1.123 | 1.172 |
| 2021-08-05 09:35:00-04:00 | 1.133 | 1.182 |
| 2021-08-05 09:40:00-04:00 | 1.129 | 1.177 |
| 2021-08-05 09:45:00-04:00 | 1.126 | 1.175 |
| 2021-08-05 09:50:00-04:00 | 1.128 | 1.177 |
| 2021-08-05 09:55:00-04:00 | 1.13 | 1.179 |
| 2021-08-05 10:00:00-04:00 | 1.129 | 1.177 |
| 2021-08-05 10:05:00-04:00 | 1.127 | 1.176 |
| 2021-08-05 10:10:00-04:00 | 1.129 | 1.177 |
| 2021-08-05 10:15:00-04:00 | 1.127 | 1.175 |
| 2021-08-05 10:20:00-04:00 | 1.126 | 1.174 |
| 2021-08-05 10:25:00-04:00 | 1.125 | 1.174 |
| 2021-08-05 10:30:00-04:00 | 1.128 | 1.177 |
| 2021-08-05 10:35:00-04:00 | 1.131 | 1.18 |
| 2021-08-05 10:40:00-04:00 | 1.133 | 1.181 |
| 2021-08-05 10:45:00-04:00 | 1.131 | 1.179 |
| 2021-08-05 10:50:00-04:00 | 1.13 | 1.179 |
| 2021-08-05 10:55:00-04:00 | 1.131 | 1.18 |
| 2021-08-05 11:00:00-04:00 | 1.131 | 1.179 |
| 2021-08-05 11:05:00-04:00 | 1.132 | 1.18 |
| 2021-08-05 11:10:00-04:00 | 1.135 | 1.183 |
| 2021-08-05 11:15:00-04:00 | 1.135 | 1.183 |
| 2021-08-05 11:20:00-04:00 | 1.132 | 1.181 |
| 2021-08-05 11:25:00-04:00 | 1.135 | 1.183 |
| 2021-08-05 11:30:00-04:00 | 1.134 | 1.182 |
| 2021-08-05 11:35:00-04:00 | 1.133 | 1.181 |
| 2021-08-05 11:40:00-04:00 | 1.133 | 1.182 |
| 2021-08-05 11:45:00-04:00 | 1.132 | 1.18 |
| 2021-08-05 11:50:00-04:00 | 1.132 | 1.18 |
| 2021-08-05 11:55:00-04:00 | 1.133 | 1.181 |
| 2021-08-05 12:00:00-04:00 | 1.136 | 1.184 |
| 2021-08-05 12:05:00-04:00 | 1.134 | 1.183 |
| 2021-08-05 12:10:00-04:00 | 1.135 | 1.183 |
| 2021-08-05 12:15:00-04:00 | 1.134 | 1.183 |
| 2021-08-05 12:20:00-04:00 | 1.134 | 1.183 |
| 2021-08-05 12:25:00-04:00 | 1.134 | 1.182 |
| 2021-08-05 12:30:00-04:00 | 1.132 | 1.181 |
| 2021-08-05 12:35:00-04:00 | 1.132 | 1.181 |
| 2021-08-05 12:40:00-04:00 | 1.132 | 1.18 |
| 2021-08-05 12:45:00-04:00 | 1.131 | 1.18 |
| 2021-08-05 12:50:00-04:00 | 1.131 | 1.18 |
| 2021-08-05 12:55:00-04:00 | 1.131 | 1.18 |
| 2021-08-05 13:00:00-04:00 | 1.13 | 1.18 |
| 2021-08-05 13:05:00-04:00 | 1.131 | 1.18 |
| 2021-08-05 13:10:00-04:00 | 1.129 | 1.18 |
| 2021-08-05 13:15:00-04:00 | 1.13 | 1.18 |
| 2021-08-05 13:20:00-04:00 | 1.13 | 1.18 |
| 2021-08-05 13:25:00-04:00 | 1.129 | 1.18 |
| 2021-08-05 13:30:00-04:00 | 1.128 | 1.18 |
| 2021-08-05 13:35:00-04:00 | 1.129 | 1.18 |
| 2021-08-05 13:40:00-04:00 | 1.128 | 1.18 |
| 2021-08-05 13:45:00-04:00 | 1.128 | 1.18 |
| 2021-08-05 13:50:00-04:00 | 1.127 | 1.18 |
| 2021-08-05 13:55:00-04:00 | 1.128 | 1.18 |
| 2021-08-05 14:00:00-04:00 | 1.129 | 1.18 |
| 2021-08-05 14:05:00-04:00 | 1.129 | 1.18 |
| 2021-08-05 14:10:00-04:00 | 1.127 | 1.18 |
| 2021-08-05 14:15:00-04:00 | 1.128 | 1.18 |
| 2021-08-05 14:20:00-04:00 | 1.128 | 1.18 |
| 2021-08-05 14:25:00-04:00 | 1.128 | 1.18 |
| 2021-08-05 14:30:00-04:00 | 1.128 | 1.18 |
| 2021-08-05 14:35:00-04:00 | 1.128 | 1.18 |
| 2021-08-05 14:40:00-04:00 | 1.129 | 1.18 |
| 2021-08-05 14:45:00-04:00 | 1.129 | 1.18 |
| 2021-08-05 14:50:00-04:00 | 1.129 | 1.18 |
| 2021-08-05 14:55:00-04:00 | 1.13 | 1.181 |
| 2021-08-05 15:00:00-04:00 | 1.129 | 1.181 |
| 2021-08-05 15:05:00-04:00 | 1.129 | 1.181 |
| 2021-08-05 15:10:00-04:00 | 1.129 | 1.18 |
| 2021-08-05 15:15:00-04:00 | 1.129 | 1.181 |
| 2021-08-05 15:20:00-04:00 | 1.128 | 1.179 |
| 2021-08-05 15:25:00-04:00 | 1.128 | 1.179 |
| 2021-08-05 15:30:00-04:00 | 1.128 | 1.18 |
| 2021-08-05 15:35:00-04:00 | 1.127 | 1.179 |
| 2021-08-05 15:40:00-04:00 | 1.127 | 1.179 |
| 2021-08-05 15:45:00-04:00 | 1.128 | 1.179 |
| 2021-08-05 15:50:00-04:00 | 1.127 | 1.179 |
| 2021-08-05 15:55:00-04:00 | 1.128 | 1.179 |
| 2021-08-06 09:30:00-04:00 | 1.128 | 1.179 |
| 2021-08-06 09:35:00-04:00 | 1.13 | 1.179 |
| 2021-08-06 09:40:00-04:00 | 1.128 | 1.179 |
| 2021-08-06 09:45:00-04:00 | 1.121 | 1.179 |
| 2021-08-06 09:50:00-04:00 | 1.121 | 1.179 |
| 2021-08-06 09:55:00-04:00 | 1.123 | 1.179 |
| 2021-08-06 10:00:00-04:00 | 1.123 | 1.179 |
| 2021-08-06 10:05:00-04:00 | 1.123 | 1.179 |
| 2021-08-06 10:10:00-04:00 | 1.123 | 1.179 |
| 2021-08-06 10:15:00-04:00 | 1.123 | 1.179 |
| 2021-08-06 10:20:00-04:00 | 1.124 | 1.179 |
| 2021-08-06 10:25:00-04:00 | 1.123 | 1.179 |
| 2021-08-06 10:30:00-04:00 | 1.122 | 1.179 |
| 2021-08-06 10:35:00-04:00 | 1.122 | 1.179 |
| 2021-08-06 10:40:00-04:00 | 1.118 | 1.179 |
| 2021-08-06 10:45:00-04:00 | 1.118 | 1.179 |
| 2021-08-06 10:50:00-04:00 | 1.111 | 1.179 |
| 2021-08-06 10:55:00-04:00 | 1.113 | 1.179 |
| 2021-08-06 11:00:00-04:00 | 1.113 | 1.179 |
| 2021-08-06 11:05:00-04:00 | 1.109 | 1.179 |
| 2021-08-06 11:10:00-04:00 | 1.105 | 1.179 |
| 2021-08-06 11:15:00-04:00 | 1.11 | 1.179 |
| 2021-08-06 11:20:00-04:00 | 1.111 | 1.179 |
| 2021-08-06 11:25:00-04:00 | 1.113 | 1.179 |
| 2021-08-06 11:30:00-04:00 | 1.113 | 1.179 |
| 2021-08-06 11:35:00-04:00 | 1.113 | 1.179 |
| 2021-08-06 11:40:00-04:00 | 1.113 | 1.179 |
| 2021-08-06 11:45:00-04:00 | 1.114 | 1.179 |
| 2021-08-06 11:50:00-04:00 | 1.113 | 1.179 |
| 2021-08-06 11:55:00-04:00 | 1.112 | 1.179 |
| 2021-08-06 12:00:00-04:00 | 1.113 | 1.18 |
| 2021-08-06 12:05:00-04:00 | 1.111 | 1.178 |
| 2021-08-06 12:10:00-04:00 | 1.111 | 1.177 |
| 2021-08-06 12:15:00-04:00 | 1.109 | 1.176 |
| 2021-08-06 12:20:00-04:00 | 1.11 | 1.177 |
| 2021-08-06 12:25:00-04:00 | 1.112 | 1.179 |
| 2021-08-06 12:30:00-04:00 | 1.114 | 1.179 |
| 2021-08-06 12:35:00-04:00 | 1.112 | 1.179 |
| 2021-08-06 12:40:00-04:00 | 1.111 | 1.179 |
| 2021-08-06 12:45:00-04:00 | 1.111 | 1.179 |
| 2021-08-06 12:50:00-04:00 | 1.109 | 1.179 |
| 2021-08-06 12:55:00-04:00 | 1.11 | 1.179 |
| 2021-08-06 13:00:00-04:00 | 1.109 | 1.179 |
| 2021-08-06 13:05:00-04:00 | 1.111 | 1.179 |
| 2021-08-06 13:10:00-04:00 | 1.111 | 1.179 |
| 2021-08-06 13:15:00-04:00 | 1.111 | 1.179 |
| 2021-08-06 13:20:00-04:00 | 1.111 | 1.179 |
| 2021-08-06 13:25:00-04:00 | 1.112 | 1.179 |
| 2021-08-06 13:30:00-04:00 | 1.11 | 1.179 |
| 2021-08-06 13:35:00-04:00 | 1.11 | 1.179 |
| 2021-08-06 13:40:00-04:00 | 1.11 | 1.179 |
| 2021-08-06 13:45:00-04:00 | 1.11 | 1.179 |
| 2021-08-06 13:50:00-04:00 | 1.108 | 1.179 |
| 2021-08-06 13:55:00-04:00 | 1.109 | 1.179 |
| 2021-08-06 14:00:00-04:00 | 1.109 | 1.179 |
| 2021-08-06 14:05:00-04:00 | 1.109 | 1.179 |
| 2021-08-06 14:10:00-04:00 | 1.108 | 1.179 |
| 2021-08-06 14:15:00-04:00 | 1.108 | 1.179 |
| 2021-08-06 14:20:00-04:00 | 1.108 | 1.179 |
| 2021-08-06 14:25:00-04:00 | 1.108 | 1.179 |
| 2021-08-06 14:30:00-04:00 | 1.108 | 1.179 |
| 2021-08-06 14:35:00-04:00 | 1.108 | 1.179 |
| 2021-08-06 14:40:00-04:00 | 1.109 | 1.179 |
| 2021-08-06 14:45:00-04:00 | 1.108 | 1.179 |
| 2021-08-06 14:50:00-04:00 | 1.108 | 1.179 |
| 2021-08-06 14:55:00-04:00 | 1.108 | 1.179 |
| 2021-08-06 15:00:00-04:00 | 1.108 | 1.179 |
| 2021-08-06 15:05:00-04:00 | 1.107 | 1.179 |
| 2021-08-06 15:10:00-04:00 | 1.107 | 1.179 |
| 2021-08-06 15:15:00-04:00 | 1.108 | 1.179 |
| 2021-08-06 15:20:00-04:00 | 1.108 | 1.179 |
| 2021-08-06 15:25:00-04:00 | 1.107 | 1.179 |
| 2021-08-06 15:30:00-04:00 | 1.107 | 1.179 |
| 2021-08-06 15:35:00-04:00 | 1.108 | 1.179 |
| 2021-08-06 15:40:00-04:00 | 1.107 | 1.179 |
| 2021-08-06 15:45:00-04:00 | 1.107 | 1.179 |
| 2021-08-06 15:50:00-04:00 | 1.107 | 1.179 |
| 2021-08-06 15:55:00-04:00 | 1.106 | 1.179 |
| 2021-08-09 09:30:00-04:00 | 1.106 | 1.179 |
| 2021-08-09 09:35:00-04:00 | 1.116 | 1.179 |
| 2021-08-09 09:40:00-04:00 | 1.123 | 1.186 |
| 2021-08-09 09:45:00-04:00 | 1.129 | 1.191 |
| 2021-08-09 09:50:00-04:00 | 1.131 | 1.193 |
| 2021-08-09 09:55:00-04:00 | 1.126 | 1.188 |
| 2021-08-09 10:00:00-04:00 | 1.128 | 1.19 |
| 2021-08-09 10:05:00-04:00 | 1.131 | 1.194 |
| 2021-08-09 10:10:00-04:00 | 1.133 | 1.196 |
| 2021-08-09 10:15:00-04:00 | 1.129 | 1.191 |
| 2021-08-09 10:20:00-04:00 | 1.129 | 1.191 |
| 2021-08-09 10:25:00-04:00 | 1.128 | 1.19 |
| 2021-08-09 10:30:00-04:00 | 1.128 | 1.191 |
| 2021-08-09 10:35:00-04:00 | 1.128 | 1.191 |
| 2021-08-09 10:40:00-04:00 | 1.125 | 1.188 |
| 2021-08-09 10:45:00-04:00 | 1.125 | 1.188 |
| 2021-08-09 10:50:00-04:00 | 1.125 | 1.188 |
| 2021-08-09 10:55:00-04:00 | 1.127 | 1.189 |
| 2021-08-09 11:00:00-04:00 | 1.128 | 1.189 |
| 2021-08-09 11:05:00-04:00 | 1.128 | 1.189 |
| 2021-08-09 11:10:00-04:00 | 1.127 | 1.189 |
| 2021-08-09 11:15:00-04:00 | 1.128 | 1.189 |
| 2021-08-09 11:20:00-04:00 | 1.129 | 1.189 |
| 2021-08-09 11:25:00-04:00 | 1.13 | 1.189 |
| 2021-08-09 11:30:00-04:00 | 1.13 | 1.189 |
| 2021-08-09 11:35:00-04:00 | 1.128 | 1.188 |
| 2021-08-09 11:40:00-04:00 | 1.128 | 1.188 |
| 2021-08-09 11:45:00-04:00 | 1.128 | 1.188 |
| 2021-08-09 11:50:00-04:00 | 1.128 | 1.187 |
| 2021-08-09 11:55:00-04:00 | 1.126 | 1.186 |
| 2021-08-09 12:00:00-04:00 | 1.127 | 1.187 |
| 2021-08-09 12:05:00-04:00 | 1.127 | 1.187 |
| 2021-08-09 12:10:00-04:00 | 1.127 | 1.187 |
| 2021-08-09 12:15:00-04:00 | 1.126 | 1.187 |
| 2021-08-09 12:20:00-04:00 | 1.128 | 1.187 |
| 2021-08-09 12:25:00-04:00 | 1.128 | 1.187 |
| 2021-08-09 12:30:00-04:00 | 1.129 | 1.187 |
| 2021-08-09 12:35:00-04:00 | 1.129 | 1.187 |
| 2021-08-09 12:40:00-04:00 | 1.129 | 1.187 |
| 2021-08-09 12:45:00-04:00 | 1.13 | 1.187 |
| 2021-08-09 12:50:00-04:00 | 1.131 | 1.188 |
| 2021-08-09 12:55:00-04:00 | 1.131 | 1.188 |
| 2021-08-09 13:00:00-04:00 | 1.132 | 1.189 |
| 2021-08-09 13:05:00-04:00 | 1.131 | 1.188 |
| 2021-08-09 13:10:00-04:00 | 1.13 | 1.187 |
| 2021-08-09 13:15:00-04:00 | 1.131 | 1.188 |
| 2021-08-09 13:20:00-04:00 | 1.13 | 1.187 |
| 2021-08-09 13:25:00-04:00 | 1.129 | 1.186 |
| 2021-08-09 13:30:00-04:00 | 1.13 | 1.187 |
| 2021-08-09 13:35:00-04:00 | 1.129 | 1.186 |
| 2021-08-09 13:40:00-04:00 | 1.13 | 1.187 |
| 2021-08-09 13:45:00-04:00 | 1.131 | 1.187 |
| 2021-08-09 13:50:00-04:00 | 1.13 | 1.187 |
| 2021-08-09 13:55:00-04:00 | 1.129 | 1.187 |
| 2021-08-09 14:00:00-04:00 | 1.13 | 1.187 |
| 2021-08-09 14:05:00-04:00 | 1.13 | 1.187 |
| 2021-08-09 14:10:00-04:00 | 1.129 | 1.187 |
| 2021-08-09 14:15:00-04:00 | 1.128 | 1.187 |
| 2021-08-09 14:20:00-04:00 | 1.128 | 1.187 |
| 2021-08-09 14:25:00-04:00 | 1.126 | 1.187 |
| 2021-08-09 14:30:00-04:00 | 1.126 | 1.187 |
| 2021-08-09 14:35:00-04:00 | 1.128 | 1.187 |
| 2021-08-09 14:40:00-04:00 | 1.13 | 1.187 |
| 2021-08-09 14:45:00-04:00 | 1.128 | 1.187 |
| 2021-08-09 14:50:00-04:00 | 1.128 | 1.187 |
| 2021-08-09 14:55:00-04:00 | 1.128 | 1.187 |
| 2021-08-09 15:00:00-04:00 | 1.129 | 1.187 |
| 2021-08-09 15:05:00-04:00 | 1.128 | 1.187 |
| 2021-08-09 15:10:00-04:00 | 1.129 | 1.187 |
| 2021-08-09 15:15:00-04:00 | 1.128 | 1.186 |
| 2021-08-09 15:20:00-04:00 | 1.128 | 1.187 |
| 2021-08-09 15:25:00-04:00 | 1.128 | 1.186 |
| 2021-08-09 15:30:00-04:00 | 1.129 | 1.187 |
| 2021-08-09 15:35:00-04:00 | 1.129 | 1.187 |
| 2021-08-09 15:40:00-04:00 | 1.128 | 1.186 |
| 2021-08-09 15:45:00-04:00 | 1.129 | 1.187 |
| 2021-08-09 15:50:00-04:00 | 1.127 | 1.186 |
| 2021-08-09 15:55:00-04:00 | 1.126 | 1.186 |
| 2021-08-10 09:30:00-04:00 | 1.127 | 1.186 |
| 2021-08-10 09:35:00-04:00 | 1.122 | 1.186 |
| 2021-08-10 09:40:00-04:00 | 1.12 | 1.186 |
| 2021-08-10 09:45:00-04:00 | 1.118 | 1.186 |
| 2021-08-10 09:50:00-04:00 | 1.115 | 1.186 |
| 2021-08-10 09:55:00-04:00 | 1.115 | 1.186 |
| 2021-08-10 10:00:00-04:00 | 1.114 | 1.186 |
| 2021-08-10 10:05:00-04:00 | 1.113 | 1.186 |
| 2021-08-10 10:10:00-04:00 | 1.111 | 1.186 |
| 2021-08-10 10:15:00-04:00 | 1.112 | 1.186 |
| 2021-08-10 10:20:00-04:00 | 1.115 | 1.186 |
| 2021-08-10 10:25:00-04:00 | 1.115 | 1.186 |
| 2021-08-10 10:30:00-04:00 | 1.116 | 1.186 |
| 2021-08-10 10:35:00-04:00 | 1.115 | 1.186 |
| 2021-08-10 10:40:00-04:00 | 1.117 | 1.186 |
| 2021-08-10 10:45:00-04:00 | 1.115 | 1.186 |
| 2021-08-10 10:50:00-04:00 | 1.118 | 1.186 |
| 2021-08-10 10:55:00-04:00 | 1.118 | 1.186 |
| 2021-08-10 11:00:00-04:00 | 1.116 | 1.184 |
| 2021-08-10 11:05:00-04:00 | 1.116 | 1.185 |
| 2021-08-10 11:10:00-04:00 | 1.115 | 1.183 |
| 2021-08-10 11:15:00-04:00 | 1.115 | 1.184 |
| 2021-08-10 11:20:00-04:00 | 1.115 | 1.183 |
| 2021-08-10 11:25:00-04:00 | 1.118 | 1.187 |
| 2021-08-10 11:30:00-04:00 | 1.117 | 1.186 |
| 2021-08-10 11:35:00-04:00 | 1.122 | 1.191 |
| 2021-08-10 11:40:00-04:00 | 1.121 | 1.19 |
| 2021-08-10 11:45:00-04:00 | 1.12 | 1.189 |
| 2021-08-10 11:50:00-04:00 | 1.121 | 1.19 |
| 2021-08-10 11:55:00-04:00 | 1.122 | 1.19 |
| 2021-08-10 12:00:00-04:00 | 1.124 | 1.193 |
| 2021-08-10 12:05:00-04:00 | 1.125 | 1.193 |
| 2021-08-10 12:10:00-04:00 | 1.125 | 1.193 |
| 2021-08-10 12:15:00-04:00 | 1.127 | 1.195 |
| 2021-08-10 12:20:00-04:00 | 1.13 | 1.199 |
| 2021-08-10 12:25:00-04:00 | 1.13 | 1.198 |
| 2021-08-10 12:30:00-04:00 | 1.129 | 1.198 |
| 2021-08-10 12:35:00-04:00 | 1.128 | 1.196 |
| 2021-08-10 12:40:00-04:00 | 1.128 | 1.196 |
| 2021-08-10 12:45:00-04:00 | 1.127 | 1.195 |
| 2021-08-10 12:50:00-04:00 | 1.127 | 1.195 |
| 2021-08-10 12:55:00-04:00 | 1.128 | 1.197 |
| 2021-08-10 13:00:00-04:00 | 1.127 | 1.195 |
| 2021-08-10 13:05:00-04:00 | 1.127 | 1.195 |
| 2021-08-10 13:10:00-04:00 | 1.129 | 1.197 |
| 2021-08-10 13:15:00-04:00 | 1.128 | 1.197 |
| 2021-08-10 13:20:00-04:00 | 1.128 | 1.197 |
| 2021-08-10 13:25:00-04:00 | 1.128 | 1.197 |
| 2021-08-10 13:30:00-04:00 | 1.126 | 1.197 |
| 2021-08-10 13:35:00-04:00 | 1.125 | 1.197 |
| 2021-08-10 13:40:00-04:00 | 1.124 | 1.197 |
| 2021-08-10 13:45:00-04:00 | 1.125 | 1.197 |
| 2021-08-10 13:50:00-04:00 | 1.126 | 1.197 |
| 2021-08-10 13:55:00-04:00 | 1.126 | 1.197 |
| 2021-08-10 14:00:00-04:00 | 1.126 | 1.197 |
| 2021-08-10 14:05:00-04:00 | 1.123 | 1.197 |
| 2021-08-10 14:10:00-04:00 | 1.122 | 1.197 |
| 2021-08-10 14:15:00-04:00 | 1.121 | 1.197 |
| 2021-08-10 14:20:00-04:00 | 1.122 | 1.197 |
| 2021-08-10 14:25:00-04:00 | 1.12 | 1.197 |
| 2021-08-10 14:30:00-04:00 | 1.121 | 1.197 |
| 2021-08-10 14:35:00-04:00 | 1.122 | 1.197 |
| 2021-08-10 14:40:00-04:00 | 1.121 | 1.197 |
| 2021-08-10 14:45:00-04:00 | 1.122 | 1.197 |
| 2021-08-10 14:50:00-04:00 | 1.122 | 1.197 |
| 2021-08-10 14:55:00-04:00 | 1.122 | 1.197 |
| 2021-08-10 15:00:00-04:00 | 1.122 | 1.197 |
| 2021-08-10 15:05:00-04:00 | 1.121 | 1.197 |
| 2021-08-10 15:10:00-04:00 | 1.12 | 1.197 |
| 2021-08-10 15:15:00-04:00 | 1.121 | 1.197 |
| 2021-08-10 15:20:00-04:00 | 1.121 | 1.197 |
| 2021-08-10 15:25:00-04:00 | 1.122 | 1.197 |
| 2021-08-10 15:30:00-04:00 | 1.123 | 1.198 |
| 2021-08-10 15:35:00-04:00 | 1.123 | 1.197 |
| 2021-08-10 15:40:00-04:00 | 1.123 | 1.198 |
| 2021-08-10 15:45:00-04:00 | 1.123 | 1.198 |
| 2021-08-10 15:50:00-04:00 | 1.122 | 1.197 |
| 2021-08-10 15:55:00-04:00 | 1.122 | 1.197 |
| 2021-08-11 09:30:00-04:00 | 1.122 | 1.196 |
| 2021-08-11 09:35:00-04:00 | 1.125 | 1.199 |
| 2021-08-11 09:40:00-04:00 | 1.122 | 1.197 |
| 2021-08-11 09:45:00-04:00 | 1.12 | 1.195 |
| 2021-08-11 09:50:00-04:00 | 1.119 | 1.193 |
| 2021-08-11 09:55:00-04:00 | 1.12 | 1.194 |
| 2021-08-11 10:00:00-04:00 | 1.118 | 1.194 |
| 2021-08-11 10:05:00-04:00 | 1.122 | 1.194 |
| 2021-08-11 10:10:00-04:00 | 1.122 | 1.194 |
| 2021-08-11 10:15:00-04:00 | 1.121 | 1.194 |
| 2021-08-11 10:20:00-04:00 | 1.12 | 1.194 |
| 2021-08-11 10:25:00-04:00 | 1.123 | 1.194 |
| 2021-08-11 10:30:00-04:00 | 1.123 | 1.194 |
| 2021-08-11 10:35:00-04:00 | 1.122 | 1.194 |
| 2021-08-11 10:40:00-04:00 | 1.122 | 1.194 |
| 2021-08-11 10:45:00-04:00 | 1.123 | 1.196 |
| 2021-08-11 10:50:00-04:00 | 1.123 | 1.195 |
| 2021-08-11 10:55:00-04:00 | 1.122 | 1.195 |
| 2021-08-11 11:00:00-04:00 | 1.12 | 1.193 |
| 2021-08-11 11:05:00-04:00 | 1.117 | 1.189 |
| 2021-08-11 11:10:00-04:00 | 1.118 | 1.19 |
| 2021-08-11 11:15:00-04:00 | 1.117 | 1.19 |
| 2021-08-11 11:20:00-04:00 | 1.115 | 1.19 |
| 2021-08-11 11:25:00-04:00 | 1.118 | 1.19 |
| 2021-08-11 11:30:00-04:00 | 1.118 | 1.19 |
| 2021-08-11 11:35:00-04:00 | 1.118 | 1.19 |
| 2021-08-11 11:40:00-04:00 | 1.119 | 1.19 |
| 2021-08-11 11:45:00-04:00 | 1.116 | 1.19 |
| 2021-08-11 11:50:00-04:00 | 1.116 | 1.19 |
| 2021-08-11 11:55:00-04:00 | 1.115 | 1.19 |
| 2021-08-11 12:00:00-04:00 | 1.116 | 1.19 |
| 2021-08-11 12:05:00-04:00 | 1.118 | 1.19 |
| 2021-08-11 12:10:00-04:00 | 1.118 | 1.19 |
| 2021-08-11 12:15:00-04:00 | 1.118 | 1.19 |
| 2021-08-11 12:20:00-04:00 | 1.117 | 1.19 |
| 2021-08-11 12:25:00-04:00 | 1.118 | 1.19 |
| 2021-08-11 12:30:00-04:00 | 1.116 | 1.19 |
| 2021-08-11 12:35:00-04:00 | 1.118 | 1.191 |
| 2021-08-11 12:40:00-04:00 | 1.116 | 1.189 |
| 2021-08-11 12:45:00-04:00 | 1.116 | 1.19 |
| 2021-08-11 12:50:00-04:00 | 1.117 | 1.191 |
| 2021-08-11 12:55:00-04:00 | 1.116 | 1.191 |
| 2021-08-11 13:00:00-04:00 | 1.117 | 1.191 |
| 2021-08-11 13:05:00-04:00 | 1.12 | 1.191 |
| 2021-08-11 13:10:00-04:00 | 1.118 | 1.191 |
| 2021-08-11 13:15:00-04:00 | 1.119 | 1.192 |
| 2021-08-11 13:20:00-04:00 | 1.119 | 1.192 |
| 2021-08-11 13:25:00-04:00 | 1.118 | 1.191 |
| 2021-08-11 13:30:00-04:00 | 1.119 | 1.192 |
| 2021-08-11 13:35:00-04:00 | 1.119 | 1.192 |
| 2021-08-11 13:40:00-04:00 | 1.118 | 1.191 |
| 2021-08-11 13:45:00-04:00 | 1.117 | 1.19 |
| 2021-08-11 13:50:00-04:00 | 1.117 | 1.19 |
| 2021-08-11 13:55:00-04:00 | 1.117 | 1.19 |
| 2021-08-11 14:00:00-04:00 | 1.118 | 1.191 |
| 2021-08-11 14:05:00-04:00 | 1.118 | 1.191 |
| 2021-08-11 14:10:00-04:00 | 1.118 | 1.191 |
| 2021-08-11 14:15:00-04:00 | 1.119 | 1.191 |
| 2021-08-11 14:20:00-04:00 | 1.118 | 1.191 |
| 2021-08-11 14:25:00-04:00 | 1.119 | 1.191 |
| 2021-08-11 14:30:00-04:00 | 1.119 | 1.191 |
| 2021-08-11 14:35:00-04:00 | 1.121 | 1.191 |
| 2021-08-11 14:40:00-04:00 | 1.121 | 1.191 |
| 2021-08-11 14:45:00-04:00 | 1.121 | 1.191 |
| 2021-08-11 14:50:00-04:00 | 1.121 | 1.191 |
| 2021-08-11 14:55:00-04:00 | 1.12 | 1.191 |
| 2021-08-11 15:00:00-04:00 | 1.121 | 1.191 |
| 2021-08-11 15:05:00-04:00 | 1.121 | 1.192 |
| 2021-08-11 15:10:00-04:00 | 1.123 | 1.193 |
| 2021-08-11 15:15:00-04:00 | 1.121 | 1.191 |
| 2021-08-11 15:20:00-04:00 | 1.121 | 1.191 |
| 2021-08-11 15:25:00-04:00 | 1.12 | 1.191 |
| 2021-08-11 15:30:00-04:00 | 1.12 | 1.191 |
| 2021-08-11 15:35:00-04:00 | 1.119 | 1.189 |
| 2021-08-11 15:40:00-04:00 | 1.118 | 1.188 |
| 2021-08-11 15:45:00-04:00 | 1.118 | 1.188 |
| 2021-08-11 15:50:00-04:00 | 1.12 | 1.188 |
| 2021-08-11 15:55:00-04:00 | 1.119 | 1.188 |
| 2021-08-12 09:30:00-04:00 | 1.119 | 1.188 |
| 2021-08-12 09:35:00-04:00 | 1.115 | 1.188 |
| 2021-08-12 09:40:00-04:00 | 1.113 | 1.188 |
| 2021-08-12 09:45:00-04:00 | 1.116 | 1.188 |
| 2021-08-12 09:50:00-04:00 | 1.115 | 1.188 |
| 2021-08-12 09:55:00-04:00 | 1.114 | 1.188 |
| 2021-08-12 10:00:00-04:00 | 1.114 | 1.188 |
| 2021-08-12 10:05:00-04:00 | 1.11 | 1.188 |
| 2021-08-12 10:10:00-04:00 | 1.109 | 1.188 |
| 2021-08-12 10:15:00-04:00 | 1.111 | 1.188 |
| 2021-08-12 10:20:00-04:00 | 1.113 | 1.188 |
| 2021-08-12 10:25:00-04:00 | 1.114 | 1.188 |
| 2021-08-12 10:30:00-04:00 | 1.115 | 1.188 |
| 2021-08-12 10:35:00-04:00 | 1.119 | 1.188 |
| 2021-08-12 10:40:00-04:00 | 1.118 | 1.188 |
| 2021-08-12 10:45:00-04:00 | 1.118 | 1.188 |
| 2021-08-12 10:50:00-04:00 | 1.119 | 1.19 |
| 2021-08-12 10:55:00-04:00 | 1.12 | 1.19 |
| 2021-08-12 11:00:00-04:00 | 1.119 | 1.19 |
| 2021-08-12 11:05:00-04:00 | 1.121 | 1.192 |
| 2021-08-12 11:10:00-04:00 | 1.122 | 1.192 |
| 2021-08-12 11:15:00-04:00 | 1.119 | 1.19 |
| 2021-08-12 11:20:00-04:00 | 1.12 | 1.19 |
| 2021-08-12 11:25:00-04:00 | 1.119 | 1.19 |
| 2021-08-12 11:30:00-04:00 | 1.119 | 1.189 |
| 2021-08-12 11:35:00-04:00 | 1.122 | 1.192 |
| 2021-08-12 11:40:00-04:00 | 1.124 | 1.195 |
| 2021-08-12 11:45:00-04:00 | 1.128 | 1.198 |
| 2021-08-12 11:50:00-04:00 | 1.126 | 1.196 |
| 2021-08-12 11:55:00-04:00 | 1.133 | 1.203 |
| 2021-08-12 12:00:00-04:00 | 1.136 | 1.206 |
| 2021-08-12 12:05:00-04:00 | 1.137 | 1.208 |
| 2021-08-12 12:10:00-04:00 | 1.135 | 1.206 |
| 2021-08-12 12:15:00-04:00 | 1.133 | 1.204 |
| 2021-08-12 12:20:00-04:00 | 1.135 | 1.206 |
| 2021-08-12 12:25:00-04:00 | 1.131 | 1.201 |
| 2021-08-12 12:30:00-04:00 | 1.131 | 1.202 |
| 2021-08-12 12:35:00-04:00 | 1.131 | 1.201 |
| 2021-08-12 12:40:00-04:00 | 1.132 | 1.202 |
| 2021-08-12 12:45:00-04:00 | 1.131 | 1.201 |
| 2021-08-12 12:50:00-04:00 | 1.131 | 1.201 |
| 2021-08-12 12:55:00-04:00 | 1.13 | 1.2 |
| 2021-08-12 13:00:00-04:00 | 1.129 | 1.2 |
| 2021-08-12 13:05:00-04:00 | 1.132 | 1.2 |
| 2021-08-12 13:10:00-04:00 | 1.132 | 1.2 |
| 2021-08-12 13:15:00-04:00 | 1.133 | 1.2 |
| 2021-08-12 13:20:00-04:00 | 1.131 | 1.2 |
| 2021-08-12 13:25:00-04:00 | 1.13 | 1.2 |
| 2021-08-12 13:30:00-04:00 | 1.132 | 1.2 |
| 2021-08-12 13:35:00-04:00 | 1.132 | 1.2 |
| 2021-08-12 13:40:00-04:00 | 1.132 | 1.2 |
| 2021-08-12 13:45:00-04:00 | 1.131 | 1.199 |
| 2021-08-12 13:50:00-04:00 | 1.132 | 1.2 |
| 2021-08-12 13:55:00-04:00 | 1.134 | 1.201 |
| 2021-08-12 14:00:00-04:00 | 1.133 | 1.201 |
| 2021-08-12 14:05:00-04:00 | 1.135 | 1.203 |
| 2021-08-12 14:10:00-04:00 | 1.134 | 1.202 |
| 2021-08-12 14:15:00-04:00 | 1.134 | 1.202 |
| 2021-08-12 14:20:00-04:00 | 1.135 | 1.203 |
| 2021-08-12 14:25:00-04:00 | 1.135 | 1.203 |
| 2021-08-12 14:30:00-04:00 | 1.135 | 1.203 |
| 2021-08-12 14:35:00-04:00 | 1.135 | 1.203 |
| 2021-08-12 14:40:00-04:00 | 1.134 | 1.202 |
| 2021-08-12 14:45:00-04:00 | 1.135 | 1.203 |
| 2021-08-12 14:50:00-04:00 | 1.131 | 1.199 |
| 2021-08-12 14:55:00-04:00 | 1.132 | 1.2 |
| 2021-08-12 15:00:00-04:00 | 1.132 | 1.2 |
| 2021-08-12 15:05:00-04:00 | 1.134 | 1.202 |
| 2021-08-12 15:20:00-04:00 | 1.134 | 1.202 |
| 2021-08-12 15:25:00-04:00 | 1.134 | 1.202 |
| 2021-08-12 15:30:00-04:00 | 1.133 | 1.202 |
| 2021-08-12 15:35:00-04:00 | 1.134 | 1.202 |
| 2021-08-12 15:40:00-04:00 | 1.134 | 1.202 |
| 2021-08-12 15:45:00-04:00 | 1.136 | 1.202 |
| 2021-08-12 15:50:00-04:00 | 1.136 | 1.202 |
| 2021-08-12 15:55:00-04:00 | 1.138 | 1.203 |
| 2021-08-13 09:30:00-04:00 | 1.139 | 1.204 |
| 2021-08-13 09:35:00-04:00 | 1.139 | 1.204 |
| 2021-08-13 09:40:00-04:00 | 1.141 | 1.206 |
| 2021-08-13 09:45:00-04:00 | 1.138 | 1.204 |
| 2021-08-13 09:50:00-04:00 | 1.145 | 1.21 |
| 2021-08-13 09:55:00-04:00 | 1.147 | 1.212 |
| 2021-08-13 10:00:00-04:00 | 1.147 | 1.212 |
| 2021-08-13 10:05:00-04:00 | 1.139 | 1.204 |
| 2021-08-13 10:10:00-04:00 | 1.14 | 1.205 |
| 2021-08-13 10:15:00-04:00 | 1.136 | 1.201 |
| 2021-08-13 10:20:00-04:00 | 1.138 | 1.203 |
| 2021-08-13 10:25:00-04:00 | 1.137 | 1.203 |
| 2021-08-13 10:30:00-04:00 | 1.136 | 1.201 |
| 2021-08-13 10:35:00-04:00 | 1.134 | 1.2 |
| 2021-08-13 10:40:00-04:00 | 1.135 | 1.2 |
| 2021-08-13 10:45:00-04:00 | 1.133 | 1.2 |
| 2021-08-13 10:50:00-04:00 | 1.133 | 1.2 |
| 2021-08-13 10:55:00-04:00 | 1.131 | 1.2 |
| 2021-08-13 11:00:00-04:00 | 1.132 | 1.2 |
| 2021-08-13 11:05:00-04:00 | 1.135 | 1.2 |
| 2021-08-13 11:10:00-04:00 | 1.133 | 1.2 |
| 2021-08-13 11:15:00-04:00 | 1.133 | 1.2 |
| 2021-08-13 11:20:00-04:00 | 1.132 | 1.2 |
| 2021-08-13 11:25:00-04:00 | 1.13 | 1.2 |
| 2021-08-13 11:30:00-04:00 | 1.131 | 1.2 |
| 2021-08-13 11:35:00-04:00 | 1.133 | 1.2 |
| 2021-08-13 11:40:00-04:00 | 1.131 | 1.2 |
| 2021-08-13 11:45:00-04:00 | 1.131 | 1.2 |
| 2021-08-13 11:50:00-04:00 | 1.13 | 1.2 |
| 2021-08-13 11:55:00-04:00 | 1.13 | 1.2 |
| 2021-08-13 12:00:00-04:00 | 1.131 | 1.2 |
| 2021-08-13 12:05:00-04:00 | 1.133 | 1.2 |
| 2021-08-13 12:10:00-04:00 | 1.134 | 1.2 |
| 2021-08-13 12:15:00-04:00 | 1.134 | 1.2 |
| 2021-08-13 12:20:00-04:00 | 1.133 | 1.2 |
| 2021-08-13 12:25:00-04:00 | 1.134 | 1.2 |
| 2021-08-13 12:30:00-04:00 | 1.135 | 1.2 |
| 2021-08-13 12:35:00-04:00 | 1.134 | 1.2 |
| 2021-08-13 12:40:00-04:00 | 1.135 | 1.201 |
| 2021-08-13 12:45:00-04:00 | 1.134 | 1.2 |
| 2021-08-13 12:50:00-04:00 | 1.134 | 1.2 |
| 2021-08-13 12:55:00-04:00 | 1.136 | 1.201 |
| 2021-08-13 13:00:00-04:00 | 1.135 | 1.201 |
| 2021-08-13 13:05:00-04:00 | 1.135 | 1.201 |
| 2021-08-13 13:10:00-04:00 | 1.134 | 1.2 |
| 2021-08-13 13:15:00-04:00 | 1.135 | 1.201 |
| 2021-08-13 13:20:00-04:00 | 1.134 | 1.2 |
| 2021-08-13 13:25:00-04:00 | 1.134 | 1.2 |
| 2021-08-13 13:30:00-04:00 | 1.134 | 1.2 |
| 2021-08-13 13:35:00-04:00 | 1.135 | 1.2 |
| 2021-08-13 13:40:00-04:00 | 1.135 | 1.2 |
| 2021-08-13 13:45:00-04:00 | 1.134 | 1.2 |
| 2021-08-13 13:50:00-04:00 | 1.134 | 1.2 |
| 2021-08-13 13:55:00-04:00 | 1.134 | 1.2 |
| 2021-08-13 14:00:00-04:00 | 1.136 | 1.2 |
| 2021-08-13 14:05:00-04:00 | 1.136 | 1.2 |
| 2021-08-13 14:10:00-04:00 | 1.135 | 1.2 |
| 2021-08-13 14:15:00-04:00 | 1.136 | 1.201 |
| 2021-08-13 14:20:00-04:00 | 1.135 | 1.2 |
| 2021-08-13 14:25:00-04:00 | 1.135 | 1.2 |
| 2021-08-13 14:30:00-04:00 | 1.134 | 1.2 |
| 2021-08-13 14:35:00-04:00 | 1.134 | 1.199 |
| 2021-08-13 14:40:00-04:00 | 1.132 | 1.198 |
| 2021-08-13 14:45:00-04:00 | 1.132 | 1.197 |
| 2021-08-13 14:50:00-04:00 | 1.132 | 1.197 |
| 2021-08-13 14:55:00-04:00 | 1.132 | 1.197 |
| 2021-08-13 15:00:00-04:00 | 1.131 | 1.197 |
| 2021-08-13 15:05:00-04:00 | 1.132 | 1.197 |
| 2021-08-13 15:10:00-04:00 | 1.131 | 1.197 |
| 2021-08-13 15:15:00-04:00 | 1.129 | 1.197 |
| 2021-08-13 15:20:00-04:00 | 1.131 | 1.197 |
| 2021-08-13 15:25:00-04:00 | 1.131 | 1.197 |
| 2021-08-13 15:30:00-04:00 | 1.13 | 1.197 |
| 2021-08-13 15:35:00-04:00 | 1.131 | 1.197 |
| 2021-08-13 15:40:00-04:00 | 1.131 | 1.197 |
| 2021-08-13 15:45:00-04:00 | 1.131 | 1.197 |
| 2021-08-13 15:50:00-04:00 | 1.131 | 1.197 |
| 2021-08-13 15:55:00-04:00 | 1.131 | 1.197 |
| 2021-08-16 09:30:00-04:00 | 1.132 | 1.197 |
| 2021-08-16 09:35:00-04:00 | 1.111 | 1.197 |
| 2021-08-16 09:40:00-04:00 | 1.11 | 1.197 |
| 2021-08-16 09:45:00-04:00 | 1.106 | 1.197 |
| 2021-08-16 09:50:00-04:00 | 1.097 | 1.197 |
| 2021-08-16 09:55:00-04:00 | 1.095 | 1.197 |
| 2021-08-16 10:00:00-04:00 | 1.095 | 1.197 |
| 2021-08-16 10:05:00-04:00 | 1.094 | 1.197 |
| 2021-08-16 10:10:00-04:00 | 1.086 | 1.197 |
| 2021-08-16 10:15:00-04:00 | 1.08 | 1.197 |
| 2021-08-16 10:20:00-04:00 | 1.082 | 1.197 |
| 2021-08-16 10:25:00-04:00 | 1.084 | 1.197 |
| 2021-08-16 10:30:00-04:00 | 1.081 | 1.197 |
| 2021-08-16 10:35:00-04:00 | 1.082 | 1.197 |
| 2021-08-16 10:40:00-04:00 | 1.085 | 1.197 |
| 2021-08-16 10:45:00-04:00 | 1.084 | 1.197 |
| 2021-08-16 10:50:00-04:00 | 1.087 | 1.197 |
| 2021-08-16 10:55:00-04:00 | 1.082 | 1.197 |
| 2021-08-16 11:00:00-04:00 | 1.078 | 1.197 |
| 2021-08-16 11:05:00-04:00 | 1.077 | 1.197 |
| 2021-08-16 11:10:00-04:00 | 1.079 | 1.197 |
| 2021-08-16 11:15:00-04:00 | 1.081 | 1.197 |
| 2021-08-16 11:20:00-04:00 | 1.082 | 1.197 |
| 2021-08-16 11:25:00-04:00 | 1.08 | 1.197 |
| 2021-08-16 11:30:00-04:00 | 1.08 | 1.197 |
| 2021-08-16 11:35:00-04:00 | 1.083 | 1.197 |
| 2021-08-16 11:40:00-04:00 | 1.086 | 1.197 |
| 2021-08-16 11:45:00-04:00 | 1.086 | 1.197 |
| 2021-08-16 11:50:00-04:00 | 1.085 | 1.196 |
| 2021-08-16 11:55:00-04:00 | 1.085 | 1.196 |
| 2021-08-16 12:00:00-04:00 | 1.084 | 1.195 |
| 2021-08-16 12:05:00-04:00 | 1.083 | 1.194 |
| 2021-08-16 12:10:00-04:00 | 1.083 | 1.194 |
| 2021-08-16 12:15:00-04:00 | 1.085 | 1.196 |
| 2021-08-16 12:20:00-04:00 | 1.084 | 1.195 |
| 2021-08-16 12:25:00-04:00 | 1.082 | 1.193 |
| 2021-08-16 12:30:00-04:00 | 1.081 | 1.192 |
| 2021-08-16 12:35:00-04:00 | 1.08 | 1.191 |
| 2021-08-16 12:40:00-04:00 | 1.08 | 1.191 |
| 2021-08-16 12:45:00-04:00 | 1.081 | 1.191 |
| 2021-08-16 12:50:00-04:00 | 1.082 | 1.191 |
| 2021-08-16 12:55:00-04:00 | 1.08 | 1.191 |
| 2021-08-16 13:00:00-04:00 | 1.081 | 1.191 |
| 2021-08-16 13:05:00-04:00 | 1.081 | 1.191 |
| 2021-08-16 13:10:00-04:00 | 1.08 | 1.191 |
| 2021-08-16 13:15:00-04:00 | 1.08 | 1.191 |
| 2021-08-16 13:20:00-04:00 | 1.081 | 1.191 |
| 2021-08-16 13:25:00-04:00 | 1.081 | 1.191 |
| 2021-08-16 13:30:00-04:00 | 1.08 | 1.191 |
| 2021-08-16 13:35:00-04:00 | 1.08 | 1.191 |
| 2021-08-16 13:40:00-04:00 | 1.081 | 1.191 |
| 2021-08-16 13:45:00-04:00 | 1.084 | 1.191 |
| 2021-08-16 13:50:00-04:00 | 1.086 | 1.193 |
| 2021-08-16 13:55:00-04:00 | 1.086 | 1.193 |
| 2021-08-16 14:00:00-04:00 | 1.086 | 1.193 |
| 2021-08-16 14:05:00-04:00 | 1.086 | 1.193 |
| 2021-08-16 14:10:00-04:00 | 1.088 | 1.195 |
| 2021-08-16 14:15:00-04:00 | 1.09 | 1.197 |
| 2021-08-16 14:20:00-04:00 | 1.088 | 1.195 |
| 2021-08-16 14:25:00-04:00 | 1.087 | 1.194 |
| 2021-08-16 14:30:00-04:00 | 1.086 | 1.193 |
| 2021-08-16 14:35:00-04:00 | 1.086 | 1.193 |
| 2021-08-16 14:40:00-04:00 | 1.083 | 1.19 |
| 2021-08-16 14:45:00-04:00 | 1.084 | 1.191 |
| 2021-08-16 14:50:00-04:00 | 1.086 | 1.193 |
| 2021-08-16 14:55:00-04:00 | 1.086 | 1.193 |
| 2021-08-16 15:00:00-04:00 | 1.087 | 1.193 |
| 2021-08-16 15:05:00-04:00 | 1.085 | 1.193 |
| 2021-08-16 15:10:00-04:00 | 1.086 | 1.193 |
| 2021-08-16 15:15:00-04:00 | 1.088 | 1.193 |
| 2021-08-16 15:20:00-04:00 | 1.09 | 1.193 |
| 2021-08-16 15:25:00-04:00 | 1.089 | 1.193 |
| 2021-08-16 15:30:00-04:00 | 1.089 | 1.192 |
| 2021-08-16 15:35:00-04:00 | 1.085 | 1.189 |
| 2021-08-16 15:40:00-04:00 | 1.084 | 1.187 |
| 2021-08-16 15:45:00-04:00 | 1.083 | 1.186 |
| 2021-08-16 15:50:00-04:00 | 1.085 | 1.188 |
| 2021-08-16 15:55:00-04:00 | 1.085 | 1.189 |
| 2021-08-17 09:30:00-04:00 | 1.088 | 1.191 |
| 2021-08-17 09:35:00-04:00 | 1.063 | 1.191 |
| 2021-08-17 09:40:00-04:00 | 1.065 | 1.191 |
| 2021-08-17 09:45:00-04:00 | 1.068 | 1.191 |
| 2021-08-17 09:50:00-04:00 | 1.065 | 1.191 |
| 2021-08-17 09:55:00-04:00 | 1.055 | 1.191 |
| 2021-08-17 10:00:00-04:00 | 1.056 | 1.191 |
| 2021-08-17 10:05:00-04:00 | 1.056 | 1.191 |
| 2021-08-17 10:10:00-04:00 | 1.056 | 1.191 |
| 2021-08-17 10:15:00-04:00 | 1.054 | 1.191 |
| 2021-08-17 10:20:00-04:00 | 1.053 | 1.191 |
| 2021-08-17 10:25:00-04:00 | 1.056 | 1.191 |
| 2021-08-17 10:30:00-04:00 | 1.06 | 1.191 |
| 2021-08-17 10:35:00-04:00 | 1.056 | 1.191 |
| 2021-08-17 10:40:00-04:00 | 1.059 | 1.191 |
| 2021-08-17 10:45:00-04:00 | 1.063 | 1.191 |
| 2021-08-17 10:50:00-04:00 | 1.063 | 1.191 |
| 2021-08-17 10:55:00-04:00 | 1.059 | 1.191 |
| 2021-08-17 11:00:00-04:00 | 1.058 | 1.191 |
| 2021-08-17 11:05:00-04:00 | 1.054 | 1.188 |
| 2021-08-17 11:10:00-04:00 | 1.053 | 1.186 |
| 2021-08-17 11:15:00-04:00 | 1.055 | 1.188 |
| 2021-08-17 11:20:00-04:00 | 1.055 | 1.188 |
| 2021-08-17 11:25:00-04:00 | 1.053 | 1.186 |
| 2021-08-17 11:30:00-04:00 | 1.049 | 1.186 |
| 2021-08-17 11:35:00-04:00 | 1.05 | 1.186 |
| 2021-08-17 11:40:00-04:00 | 1.048 | 1.186 |
| 2021-08-17 11:45:00-04:00 | 1.05 | 1.186 |
| 2021-08-17 11:50:00-04:00 | 1.051 | 1.186 |
| 2021-08-17 11:55:00-04:00 | 1.048 | 1.186 |
| 2021-08-17 12:00:00-04:00 | 1.044 | 1.186 |
| 2021-08-17 12:05:00-04:00 | 1.042 | 1.186 |
| 2021-08-17 12:10:00-04:00 | 1.045 | 1.186 |
| 2021-08-17 12:15:00-04:00 | 1.044 | 1.186 |
| 2021-08-17 12:20:00-04:00 | 1.045 | 1.186 |
| 2021-08-17 12:25:00-04:00 | 1.044 | 1.186 |
| 2021-08-17 12:30:00-04:00 | 1.047 | 1.186 |
| 2021-08-17 12:35:00-04:00 | 1.046 | 1.186 |
| 2021-08-17 12:40:00-04:00 | 1.044 | 1.186 |
| 2021-08-17 12:45:00-04:00 | 1.04 | 1.186 |
| 2021-08-17 12:50:00-04:00 | 1.04 | 1.186 |
| 2021-08-17 12:55:00-04:00 | 1.039 | 1.186 |
| 2021-08-17 13:00:00-04:00 | 1.037 | 1.186 |
| 2021-08-17 13:05:00-04:00 | 1.038 | 1.186 |
| 2021-08-17 13:10:00-04:00 | 1.041 | 1.186 |
| 2021-08-17 13:15:00-04:00 | 1.041 | 1.186 |
| 2021-08-17 13:20:00-04:00 | 1.04 | 1.186 |
| 2021-08-17 13:25:00-04:00 | 1.041 | 1.186 |
| 2021-08-17 13:30:00-04:00 | 1.042 | 1.186 |
| 2021-08-17 13:35:00-04:00 | 1.04 | 1.186 |
| 2021-08-17 13:40:00-04:00 | 1.038 | 1.186 |
| 2021-08-17 13:45:00-04:00 | 1.036 | 1.186 |
| 2021-08-17 13:50:00-04:00 | 1.033 | 1.186 |
| 2021-08-17 13:55:00-04:00 | 1.036 | 1.186 |
| 2021-08-17 14:00:00-04:00 | 1.044 | 1.186 |
| 2021-08-17 14:05:00-04:00 | 1.045 | 1.186 |
| 2021-08-17 14:10:00-04:00 | 1.045 | 1.186 |
| 2021-08-17 14:15:00-04:00 | 1.045 | 1.186 |
| 2021-08-17 14:20:00-04:00 | 1.044 | 1.186 |
| 2021-08-17 14:25:00-04:00 | 1.044 | 1.185 |
| 2021-08-17 14:30:00-04:00 | 1.042 | 1.184 |
| 2021-08-17 14:35:00-04:00 | 1.042 | 1.184 |
| 2021-08-17 14:40:00-04:00 | 1.039 | 1.181 |
| 2021-08-17 14:45:00-04:00 | 1.041 | 1.182 |
| 2021-08-17 14:50:00-04:00 | 1.042 | 1.184 |
| 2021-08-17 14:55:00-04:00 | 1.041 | 1.183 |
| 2021-08-17 15:00:00-04:00 | 1.046 | 1.187 |
| 2021-08-17 15:05:00-04:00 | 1.045 | 1.187 |
| 2021-08-17 15:10:00-04:00 | 1.048 | 1.19 |
| 2021-08-17 15:15:00-04:00 | 1.048 | 1.19 |
| 2021-08-17 15:20:00-04:00 | 1.05 | 1.19 |
| 2021-08-17 15:25:00-04:00 | 1.051 | 1.191 |
| 2021-08-17 15:30:00-04:00 | 1.051 | 1.191 |
| 2021-08-17 15:35:00-04:00 | 1.052 | 1.192 |
| 2021-08-17 15:40:00-04:00 | 1.054 | 1.194 |
| 2021-08-17 15:45:00-04:00 | 1.052 | 1.192 |
| 2021-08-17 15:50:00-04:00 | 1.052 | 1.192 |
| 2021-08-17 15:55:00-04:00 | 1.056 | 1.196 |
| 2021-08-18 09:30:00-04:00 | 1.058 | 1.198 |
| 2021-08-18 09:35:00-04:00 | 1.07 | 1.21 |
| 2021-08-18 09:40:00-04:00 | 1.074 | 1.214 |
| 2021-08-18 09:45:00-04:00 | 1.068 | 1.208 |
| 2021-08-18 09:50:00-04:00 | 1.076 | 1.216 |
| 2021-08-18 09:55:00-04:00 | 1.083 | 1.223 |
| 2021-08-18 10:00:00-04:00 | 1.085 | 1.225 |
| 2021-08-18 10:05:00-04:00 | 1.081 | 1.221 |
| 2021-08-18 10:10:00-04:00 | 1.084 | 1.224 |
| 2021-08-18 10:15:00-04:00 | 1.09 | 1.23 |
| 2021-08-18 10:20:00-04:00 | 1.087 | 1.227 |
| 2021-08-18 10:25:00-04:00 | 1.086 | 1.226 |
| 2021-08-18 10:30:00-04:00 | 1.09 | 1.23 |
| 2021-08-18 10:35:00-04:00 | 1.091 | 1.231 |
| 2021-08-18 10:40:00-04:00 | 1.091 | 1.231 |
| 2021-08-18 10:45:00-04:00 | 1.092 | 1.232 |
| 2021-08-18 10:50:00-04:00 | 1.094 | 1.234 |
| 2021-08-18 10:55:00-04:00 | 1.097 | 1.237 |
| 2021-08-18 11:00:00-04:00 | 1.098 | 1.238 |
| 2021-08-18 11:05:00-04:00 | 1.096 | 1.236 |
| 2021-08-18 11:10:00-04:00 | 1.096 | 1.236 |
| 2021-08-18 11:15:00-04:00 | 1.096 | 1.235 |
| 2021-08-18 11:20:00-04:00 | 1.092 | 1.232 |
| 2021-08-18 11:25:00-04:00 | 1.094 | 1.234 |
| 2021-08-18 11:30:00-04:00 | 1.093 | 1.233 |
| 2021-08-18 11:35:00-04:00 | 1.093 | 1.233 |
| 2021-08-18 11:40:00-04:00 | 1.089 | 1.228 |
| 2021-08-18 11:45:00-04:00 | 1.091 | 1.23 |
| 2021-08-18 11:50:00-04:00 | 1.09 | 1.23 |
| 2021-08-18 11:55:00-04:00 | 1.092 | 1.23 |
| 2021-08-18 12:00:00-04:00 | 1.094 | 1.23 |
| 2021-08-18 12:05:00-04:00 | 1.096 | 1.23 |
| 2021-08-18 12:10:00-04:00 | 1.097 | 1.23 |
| 2021-08-18 12:15:00-04:00 | 1.095 | 1.23 |
| 2021-08-18 12:20:00-04:00 | 1.096 | 1.23 |
| 2021-08-18 12:25:00-04:00 | 1.095 | 1.229 |
| 2021-08-18 12:30:00-04:00 | 1.095 | 1.229 |
| 2021-08-18 12:35:00-04:00 | 1.096 | 1.231 |
| 2021-08-18 12:40:00-04:00 | 1.098 | 1.233 |
| 2021-08-18 12:45:00-04:00 | 1.097 | 1.231 |
| 2021-08-18 12:50:00-04:00 | 1.096 | 1.23 |
| 2021-08-18 12:55:00-04:00 | 1.096 | 1.23 |
| 2021-08-18 13:00:00-04:00 | 1.095 | 1.229 |
| 2021-08-18 13:05:00-04:00 | 1.094 | 1.229 |
| 2021-08-18 13:10:00-04:00 | 1.094 | 1.228 |
| 2021-08-18 13:15:00-04:00 | 1.097 | 1.231 |
| 2021-08-18 13:20:00-04:00 | 1.093 | 1.228 |
| 2021-08-18 13:25:00-04:00 | 1.093 | 1.228 |
| 2021-08-18 13:30:00-04:00 | 1.092 | 1.228 |
| 2021-08-18 13:35:00-04:00 | 1.093 | 1.228 |
| 2021-08-18 13:40:00-04:00 | 1.091 | 1.228 |
| 2021-08-18 13:45:00-04:00 | 1.091 | 1.228 |
| 2021-08-18 13:50:00-04:00 | 1.091 | 1.228 |
| 2021-08-18 13:55:00-04:00 | 1.091 | 1.228 |
| 2021-08-18 14:00:00-04:00 | 1.092 | 1.228 |
| 2021-08-18 14:05:00-04:00 | 1.097 | 1.228 |
| 2021-08-18 14:10:00-04:00 | 1.096 | 1.228 |
| 2021-08-18 14:15:00-04:00 | 1.089 | 1.228 |
| 2021-08-18 14:20:00-04:00 | 1.09 | 1.228 |
| 2021-08-18 14:25:00-04:00 | 1.092 | 1.228 |
| 2021-08-18 14:30:00-04:00 | 1.095 | 1.228 |
| 2021-08-18 14:35:00-04:00 | 1.1 | 1.233 |
| 2021-08-18 14:40:00-04:00 | 1.099 | 1.232 |
| 2021-08-18 14:45:00-04:00 | 1.098 | 1.231 |
| 2021-08-18 14:50:00-04:00 | 1.098 | 1.231 |
| 2021-08-18 14:55:00-04:00 | 1.099 | 1.232 |
| 2021-08-18 15:00:00-04:00 | 1.101 | 1.234 |
| 2021-08-18 15:05:00-04:00 | 1.098 | 1.231 |
| 2021-08-18 15:10:00-04:00 | 1.1 | 1.232 |
| 2021-08-18 15:15:00-04:00 | 1.101 | 1.234 |
| 2021-08-18 15:20:00-04:00 | 1.099 | 1.232 |
| 2021-08-18 15:25:00-04:00 | 1.098 | 1.231 |
| 2021-08-18 15:30:00-04:00 | 1.096 | 1.229 |
| 2021-08-18 15:35:00-04:00 | 1.093 | 1.226 |
| 2021-08-18 15:40:00-04:00 | 1.096 | 1.229 |
| 2021-08-18 15:45:00-04:00 | 1.097 | 1.229 |
| 2021-08-18 15:50:00-04:00 | 1.093 | 1.229 |
| 2021-08-18 15:55:00-04:00 | 1.092 | 1.229 |
| 2021-08-19 09:30:00-04:00 | 1.092 | 1.229 |
| 2021-08-19 09:35:00-04:00 | 1.082 | 1.229 |
| 2021-08-19 09:40:00-04:00 | 1.078 | 1.229 |
| 2021-08-19 09:45:00-04:00 | 1.074 | 1.229 |
| 2021-08-19 09:50:00-04:00 | 1.074 | 1.229 |
| 2021-08-19 09:55:00-04:00 | 1.074 | 1.229 |
| 2021-08-19 10:00:00-04:00 | 1.069 | 1.229 |
| 2021-08-19 10:05:00-04:00 | 1.075 | 1.229 |
| 2021-08-19 10:10:00-04:00 | 1.077 | 1.229 |
| 2021-08-19 10:15:00-04:00 | 1.078 | 1.229 |
| 2021-08-19 10:20:00-04:00 | 1.079 | 1.229 |
| 2021-08-19 10:25:00-04:00 | 1.077 | 1.229 |
| 2021-08-19 10:30:00-04:00 | 1.075 | 1.229 |
| 2021-08-19 10:35:00-04:00 | 1.072 | 1.229 |
| 2021-08-19 10:40:00-04:00 | 1.073 | 1.229 |
| 2021-08-19 10:45:00-04:00 | 1.075 | 1.229 |
| 2021-08-19 10:50:00-04:00 | 1.072 | 1.229 |
| 2021-08-19 10:55:00-04:00 | 1.072 | 1.229 |
| 2021-08-19 11:00:00-04:00 | 1.078 | 1.229 |
| 2021-08-19 11:05:00-04:00 | 1.078 | 1.229 |
| 2021-08-19 11:10:00-04:00 | 1.075 | 1.229 |
| 2021-08-19 11:15:00-04:00 | 1.078 | 1.229 |
| 2021-08-19 11:20:00-04:00 | 1.079 | 1.229 |
| 2021-08-19 11:25:00-04:00 | 1.078 | 1.229 |
| 2021-08-19 11:30:00-04:00 | 1.076 | 1.227 |
| 2021-08-19 11:35:00-04:00 | 1.077 | 1.228 |
| 2021-08-19 11:40:00-04:00 | 1.076 | 1.227 |
| 2021-08-19 11:45:00-04:00 | 1.076 | 1.227 |
| 2021-08-19 11:50:00-04:00 | 1.079 | 1.23 |
| 2021-08-19 11:55:00-04:00 | 1.077 | 1.228 |
| 2021-08-19 12:00:00-04:00 | 1.079 | 1.23 |
| 2021-08-19 12:05:00-04:00 | 1.078 | 1.229 |
| 2021-08-19 12:10:00-04:00 | 1.075 | 1.227 |
| 2021-08-19 12:15:00-04:00 | 1.074 | 1.226 |
| 2021-08-19 12:20:00-04:00 | 1.074 | 1.226 |
| 2021-08-19 12:25:00-04:00 | 1.074 | 1.226 |
| 2021-08-19 12:30:00-04:00 | 1.075 | 1.226 |
| 2021-08-19 12:35:00-04:00 | 1.076 | 1.226 |
| 2021-08-19 12:40:00-04:00 | 1.077 | 1.226 |
| 2021-08-19 12:45:00-04:00 | 1.076 | 1.226 |
| 2021-08-19 12:50:00-04:00 | 1.075 | 1.226 |
| 2021-08-19 12:55:00-04:00 | 1.076 | 1.226 |
| 2021-08-19 13:00:00-04:00 | 1.078 | 1.226 |
| 2021-08-19 13:05:00-04:00 | 1.075 | 1.226 |
| 2021-08-19 13:10:00-04:00 | 1.075 | 1.226 |
| 2021-08-19 13:15:00-04:00 | 1.077 | 1.227 |
| 2021-08-19 13:20:00-04:00 | 1.078 | 1.228 |
| 2021-08-19 13:25:00-04:00 | 1.077 | 1.227 |
| 2021-08-19 13:30:00-04:00 | 1.076 | 1.226 |
| 2021-08-19 13:35:00-04:00 | 1.076 | 1.227 |
| 2021-08-19 13:40:00-04:00 | 1.072 | 1.223 |
| 2021-08-19 13:45:00-04:00 | 1.075 | 1.225 |
| 2021-08-19 13:50:00-04:00 | 1.075 | 1.225 |
| 2021-08-19 13:55:00-04:00 | 1.075 | 1.225 |
| 2021-08-19 14:00:00-04:00 | 1.073 | 1.225 |
| 2021-08-19 14:05:00-04:00 | 1.071 | 1.225 |
| 2021-08-19 14:10:00-04:00 | 1.07 | 1.225 |
| 2021-08-19 14:15:00-04:00 | 1.071 | 1.225 |
| 2021-08-19 14:20:00-04:00 | 1.07 | 1.225 |
| 2021-08-19 14:25:00-04:00 | 1.069 | 1.225 |
| 2021-08-19 14:30:00-04:00 | 1.065 | 1.225 |
| 2021-08-19 14:35:00-04:00 | 1.064 | 1.225 |
| 2021-08-19 14:40:00-04:00 | 1.065 | 1.225 |
| 2021-08-19 14:45:00-04:00 | 1.065 | 1.225 |
| 2021-08-19 14:50:00-04:00 | 1.068 | 1.225 |
| 2021-08-19 14:55:00-04:00 | 1.07 | 1.225 |
| 2021-08-19 15:00:00-04:00 | 1.069 | 1.225 |
| 2021-08-19 15:05:00-04:00 | 1.071 | 1.225 |
| 2021-08-19 15:10:00-04:00 | 1.07 | 1.225 |
| 2021-08-19 15:15:00-04:00 | 1.071 | 1.225 |
| 2021-08-19 15:20:00-04:00 | 1.072 | 1.225 |
| 2021-08-19 15:25:00-04:00 | 1.073 | 1.226 |
| 2021-08-19 15:30:00-04:00 | 1.073 | 1.226 |
| 2021-08-19 15:35:00-04:00 | 1.074 | 1.227 |
| 2021-08-19 15:40:00-04:00 | 1.071 | 1.224 |
| 2021-08-19 15:45:00-04:00 | 1.071 | 1.224 |
| 2021-08-19 15:50:00-04:00 | 1.069 | 1.222 |
| 2021-08-19 15:55:00-04:00 | 1.069 | 1.222 |
| 2021-08-20 09:30:00-04:00 | 1.069 | 1.222 |
| 2021-08-20 09:35:00-04:00 | 1.09 | 1.243 |
| 2021-08-20 09:40:00-04:00 | 1.088 | 1.242 |
| 2021-08-20 09:45:00-04:00 | 1.088 | 1.242 |
| 2021-08-20 09:50:00-04:00 | 1.082 | 1.235 |
| 2021-08-20 09:55:00-04:00 | 1.082 | 1.235 |
| 2021-08-20 10:00:00-04:00 | 1.08 | 1.234 |
| 2021-08-20 10:05:00-04:00 | 1.078 | 1.232 |
| 2021-08-20 10:10:00-04:00 | 1.079 | 1.232 |
| 2021-08-20 10:15:00-04:00 | 1.076 | 1.23 |
| 2021-08-20 10:20:00-04:00 | 1.078 | 1.231 |
| 2021-08-20 10:25:00-04:00 | 1.075 | 1.228 |
| 2021-08-20 10:30:00-04:00 | 1.075 | 1.228 |
| 2021-08-20 10:35:00-04:00 | 1.077 | 1.228 |
| 2021-08-20 10:40:00-04:00 | 1.075 | 1.228 |
| 2021-08-20 10:45:00-04:00 | 1.074 | 1.228 |
| 2021-08-20 10:50:00-04:00 | 1.077 | 1.228 |
| 2021-08-20 10:55:00-04:00 | 1.075 | 1.228 |
| 2021-08-20 11:00:00-04:00 | 1.075 | 1.228 |
| 2021-08-20 11:05:00-04:00 | 1.074 | 1.228 |
| 2021-08-20 11:10:00-04:00 | 1.071 | 1.228 |
| 2021-08-20 11:15:00-04:00 | 1.072 | 1.228 |
| 2021-08-20 11:20:00-04:00 | 1.071 | 1.228 |
| 2021-08-20 11:25:00-04:00 | 1.074 | 1.228 |
| 2021-08-20 11:30:00-04:00 | 1.073 | 1.228 |
| 2021-08-20 11:35:00-04:00 | 1.077 | 1.228 |
| 2021-08-20 11:40:00-04:00 | 1.078 | 1.228 |
| 2021-08-20 11:45:00-04:00 | 1.076 | 1.228 |
| 2021-08-20 11:50:00-04:00 | 1.075 | 1.228 |
| 2021-08-20 11:55:00-04:00 | 1.071 | 1.228 |
| 2021-08-20 12:00:00-04:00 | 1.071 | 1.228 |
| 2021-08-20 12:05:00-04:00 | 1.073 | 1.23 |
| 2021-08-20 12:10:00-04:00 | 1.072 | 1.229 |
| 2021-08-20 12:15:00-04:00 | 1.073 | 1.23 |
| 2021-08-20 12:20:00-04:00 | 1.075 | 1.232 |
| 2021-08-20 12:25:00-04:00 | 1.074 | 1.232 |
| 2021-08-20 12:30:00-04:00 | 1.075 | 1.232 |
| 2021-08-20 12:35:00-04:00 | 1.074 | 1.232 |
| 2021-08-20 12:40:00-04:00 | 1.074 | 1.232 |
| 2021-08-20 12:45:00-04:00 | 1.074 | 1.232 |
| 2021-08-20 12:50:00-04:00 | 1.074 | 1.232 |
| 2021-08-20 12:55:00-04:00 | 1.075 | 1.232 |
| 2021-08-20 13:00:00-04:00 | 1.075 | 1.232 |
| 2021-08-20 13:05:00-04:00 | 1.074 | 1.231 |
| 2021-08-20 13:10:00-04:00 | 1.074 | 1.231 |
| 2021-08-20 13:15:00-04:00 | 1.076 | 1.233 |
| 2021-08-20 13:20:00-04:00 | 1.076 | 1.233 |
| 2021-08-20 13:25:00-04:00 | 1.075 | 1.232 |
| 2021-08-20 13:30:00-04:00 | 1.075 | 1.232 |
| 2021-08-20 13:35:00-04:00 | 1.075 | 1.232 |
| 2021-08-20 13:40:00-04:00 | 1.074 | 1.231 |
| 2021-08-20 13:45:00-04:00 | 1.075 | 1.232 |
| 2021-08-20 13:50:00-04:00 | 1.075 | 1.231 |
| 2021-08-20 13:55:00-04:00 | 1.073 | 1.23 |
| 2021-08-20 14:00:00-04:00 | 1.072 | 1.229 |
| 2021-08-20 14:05:00-04:00 | 1.073 | 1.229 |
| 2021-08-20 14:10:00-04:00 | 1.073 | 1.229 |
| 2021-08-20 14:15:00-04:00 | 1.073 | 1.229 |
| 2021-08-20 14:20:00-04:00 | 1.075 | 1.229 |
| 2021-08-20 14:25:00-04:00 | 1.075 | 1.229 |
| 2021-08-20 14:30:00-04:00 | 1.076 | 1.229 |
| 2021-08-20 14:35:00-04:00 | 1.076 | 1.229 |
| 2021-08-20 14:40:00-04:00 | 1.076 | 1.229 |
| 2021-08-20 14:45:00-04:00 | 1.075 | 1.229 |
| 2021-08-20 14:50:00-04:00 | 1.076 | 1.229 |
| 2021-08-20 14:55:00-04:00 | 1.077 | 1.231 |
| 2021-08-20 15:00:00-04:00 | 1.078 | 1.232 |
| 2021-08-20 15:05:00-04:00 | 1.079 | 1.232 |
| 2021-08-20 15:10:00-04:00 | 1.079 | 1.232 |
| 2021-08-20 15:15:00-04:00 | 1.08 | 1.233 |
| 2021-08-20 15:20:00-04:00 | 1.08 | 1.233 |
| 2021-08-20 15:25:00-04:00 | 1.08 | 1.233 |
| 2021-08-20 15:30:00-04:00 | 1.078 | 1.231 |
| 2021-08-20 15:35:00-04:00 | 1.08 | 1.233 |
| 2021-08-20 15:40:00-04:00 | 1.079 | 1.233 |
| 2021-08-20 15:45:00-04:00 | 1.079 | 1.232 |
| 2021-08-20 15:50:00-04:00 | 1.079 | 1.232 |
| 2021-08-20 15:55:00-04:00 | 1.079 | 1.232 |
| 2021-08-23 09:30:00-04:00 | 1.079 | 1.232 |
| 2021-08-23 09:35:00-04:00 | 1.082 | 1.235 |
| 2021-08-23 09:40:00-04:00 | 1.082 | 1.235 |
| 2021-08-23 09:45:00-04:00 | 1.089 | 1.242 |
| 2021-08-23 09:50:00-04:00 | 1.097 | 1.25 |
| 2021-08-23 09:55:00-04:00 | 1.102 | 1.255 |
| 2021-08-23 10:00:00-04:00 | 1.1 | 1.253 |
| 2021-08-23 10:05:00-04:00 | 1.105 | 1.258 |
| 2021-08-23 10:10:00-04:00 | 1.105 | 1.258 |
| 2021-08-23 10:15:00-04:00 | 1.106 | 1.259 |
| 2021-08-23 10:20:00-04:00 | 1.107 | 1.26 |
| 2021-08-23 10:25:00-04:00 | 1.112 | 1.265 |
| 2021-08-23 10:30:00-04:00 | 1.112 | 1.265 |
| 2021-08-23 10:35:00-04:00 | 1.111 | 1.264 |
| 2021-08-23 10:40:00-04:00 | 1.116 | 1.269 |
| 2021-08-23 10:45:00-04:00 | 1.114 | 1.267 |
| 2021-08-23 10:50:00-04:00 | 1.114 | 1.267 |
| 2021-08-23 10:55:00-04:00 | 1.117 | 1.27 |
| 2021-08-23 11:00:00-04:00 | 1.116 | 1.269 |
| 2021-08-23 11:05:00-04:00 | 1.113 | 1.266 |
| 2021-08-23 11:10:00-04:00 | 1.111 | 1.264 |
| 2021-08-23 11:15:00-04:00 | 1.111 | 1.264 |
| 2021-08-23 11:20:00-04:00 | 1.112 | 1.265 |
| 2021-08-23 11:25:00-04:00 | 1.114 | 1.267 |
| 2021-08-23 11:30:00-04:00 | 1.115 | 1.268 |
| 2021-08-23 11:35:00-04:00 | 1.115 | 1.269 |
| 2021-08-23 11:40:00-04:00 | 1.117 | 1.27 |
| 2021-08-23 11:45:00-04:00 | 1.118 | 1.27 |
| 2021-08-23 11:50:00-04:00 | 1.118 | 1.27 |
| 2021-08-23 11:55:00-04:00 | 1.12 | 1.272 |
| 2021-08-23 12:00:00-04:00 | 1.121 | 1.273 |
| 2021-08-23 12:05:00-04:00 | 1.122 | 1.274 |
| 2021-08-23 12:10:00-04:00 | 1.123 | 1.275 |
| 2021-08-23 12:15:00-04:00 | 1.119 | 1.271 |
| 2021-08-23 12:20:00-04:00 | 1.119 | 1.271 |
| 2021-08-23 12:25:00-04:00 | 1.119 | 1.271 |
| 2021-08-23 12:30:00-04:00 | 1.119 | 1.271 |
| 2021-08-23 12:35:00-04:00 | 1.121 | 1.273 |
| 2021-08-23 12:40:00-04:00 | 1.12 | 1.272 |
| 2021-08-23 12:45:00-04:00 | 1.122 | 1.274 |
| 2021-08-23 12:50:00-04:00 | 1.12 | 1.272 |
| 2021-08-23 12:55:00-04:00 | 1.121 | 1.273 |
| 2021-08-23 13:00:00-04:00 | 1.12 | 1.272 |
| 2021-08-23 13:05:00-04:00 | 1.119 | 1.271 |
| 2021-08-23 13:10:00-04:00 | 1.119 | 1.271 |
| 2021-08-23 13:15:00-04:00 | 1.12 | 1.272 |
| 2021-08-23 13:20:00-04:00 | 1.12 | 1.272 |
| 2021-08-23 13:25:00-04:00 | 1.121 | 1.272 |
| 2021-08-23 13:30:00-04:00 | 1.123 | 1.272 |
| 2021-08-23 13:35:00-04:00 | 1.123 | 1.272 |
| 2021-08-23 13:40:00-04:00 | 1.122 | 1.271 |
| 2021-08-23 13:45:00-04:00 | 1.121 | 1.27 |
| 2021-08-23 13:50:00-04:00 | 1.122 | 1.27 |
| 2021-08-23 13:55:00-04:00 | 1.121 | 1.269 |
| 2021-08-23 14:00:00-04:00 | 1.121 | 1.27 |
| 2021-08-23 14:05:00-04:00 | 1.122 | 1.27 |
| 2021-08-23 14:10:00-04:00 | 1.122 | 1.271 |
| 2021-08-23 14:15:00-04:00 | 1.122 | 1.271 |
| 2021-08-23 14:20:00-04:00 | 1.122 | 1.271 |
| 2021-08-23 14:25:00-04:00 | 1.12 | 1.269 |
| 2021-08-23 14:30:00-04:00 | 1.121 | 1.27 |
| 2021-08-23 14:35:00-04:00 | 1.12 | 1.27 |
| 2021-08-23 14:40:00-04:00 | 1.12 | 1.27 |
| 2021-08-23 14:45:00-04:00 | 1.12 | 1.27 |
| 2021-08-23 14:50:00-04:00 | 1.121 | 1.27 |
| 2021-08-23 14:55:00-04:00 | 1.12 | 1.27 |
| 2021-08-23 15:00:00-04:00 | 1.121 | 1.27 |
| 2021-08-23 15:05:00-04:00 | 1.12 | 1.27 |
| 2021-08-23 15:10:00-04:00 | 1.119 | 1.27 |
| 2021-08-23 15:15:00-04:00 | 1.118 | 1.27 |
| 2021-08-23 15:20:00-04:00 | 1.116 | 1.27 |
| 2021-08-23 15:25:00-04:00 | 1.117 | 1.27 |
| 2021-08-23 15:30:00-04:00 | 1.115 | 1.27 |
| 2021-08-23 15:35:00-04:00 | 1.115 | 1.27 |
| 2021-08-23 15:40:00-04:00 | 1.117 | 1.27 |
| 2021-08-23 15:45:00-04:00 | 1.115 | 1.27 |
| 2021-08-23 15:50:00-04:00 | 1.117 | 1.27 |
| 2021-08-23 15:55:00-04:00 | 1.118 | 1.27 |
| 2021-08-24 09:30:00-04:00 | 1.116 | 1.27 |
| 2021-08-24 09:35:00-04:00 | 1.115 | 1.27 |
| 2021-08-24 09:40:00-04:00 | 1.116 | 1.27 |
| 2021-08-24 09:45:00-04:00 | 1.12 | 1.27 |
| 2021-08-24 09:50:00-04:00 | 1.113 | 1.27 |
| 2021-08-24 09:55:00-04:00 | 1.115 | 1.27 |
| 2021-08-24 10:00:00-04:00 | 1.114 | 1.27 |
| 2021-08-24 10:05:00-04:00 | 1.124 | 1.27 |
| 2021-08-24 10:10:00-04:00 | 1.128 | 1.274 |
| 2021-08-24 10:15:00-04:00 | 1.124 | 1.27 |
| 2021-08-24 10:20:00-04:00 | 1.123 | 1.269 |
| 2021-08-24 10:25:00-04:00 | 1.122 | 1.268 |
| 2021-08-24 10:30:00-04:00 | 1.118 | 1.265 |
| 2021-08-24 10:35:00-04:00 | 1.119 | 1.265 |
| 2021-08-24 10:40:00-04:00 | 1.119 | 1.265 |
| 2021-08-24 10:45:00-04:00 | 1.117 | 1.263 |
| 2021-08-24 10:50:00-04:00 | 1.117 | 1.263 |
| 2021-08-24 10:55:00-04:00 | 1.12 | 1.267 |
| 2021-08-24 11:00:00-04:00 | 1.118 | 1.264 |
| 2021-08-24 11:05:00-04:00 | 1.117 | 1.264 |
| 2021-08-24 11:10:00-04:00 | 1.118 | 1.264 |
| 2021-08-24 11:15:00-04:00 | 1.117 | 1.264 |
| 2021-08-24 11:20:00-04:00 | 1.117 | 1.264 |
| 2021-08-24 11:25:00-04:00 | 1.116 | 1.264 |
| 2021-08-24 11:30:00-04:00 | 1.116 | 1.264 |
| 2021-08-24 11:35:00-04:00 | 1.116 | 1.264 |
| 2021-08-24 11:40:00-04:00 | 1.117 | 1.264 |
| 2021-08-24 11:45:00-04:00 | 1.116 | 1.264 |
| 2021-08-24 11:50:00-04:00 | 1.117 | 1.264 |
| 2021-08-24 11:55:00-04:00 | 1.118 | 1.264 |
| 2021-08-24 12:00:00-04:00 | 1.119 | 1.264 |
| 2021-08-24 12:05:00-04:00 | 1.119 | 1.264 |
| 2021-08-24 12:10:00-04:00 | 1.119 | 1.264 |
| 2021-08-24 12:15:00-04:00 | 1.121 | 1.266 |
| 2021-08-24 12:20:00-04:00 | 1.119 | 1.264 |
| 2021-08-24 12:25:00-04:00 | 1.119 | 1.265 |
| 2021-08-24 12:30:00-04:00 | 1.119 | 1.265 |
| 2021-08-24 12:35:00-04:00 | 1.119 | 1.265 |
| 2021-08-24 12:40:00-04:00 | 1.12 | 1.265 |
| 2021-08-24 12:45:00-04:00 | 1.12 | 1.265 |
| 2021-08-24 12:50:00-04:00 | 1.118 | 1.264 |
| 2021-08-24 12:55:00-04:00 | 1.118 | 1.263 |
| 2021-08-24 13:00:00-04:00 | 1.118 | 1.263 |
| 2021-08-24 13:05:00-04:00 | 1.117 | 1.262 |
| 2021-08-24 13:10:00-04:00 | 1.117 | 1.262 |
| 2021-08-24 13:15:00-04:00 | 1.116 | 1.262 |
| 2021-08-24 13:20:00-04:00 | 1.118 | 1.262 |
| 2021-08-24 13:25:00-04:00 | 1.117 | 1.262 |
| 2021-08-24 13:30:00-04:00 | 1.117 | 1.262 |
| 2021-08-24 13:35:00-04:00 | 1.116 | 1.262 |
| 2021-08-24 13:40:00-04:00 | 1.118 | 1.262 |
| 2021-08-24 13:45:00-04:00 | 1.117 | 1.262 |
| 2021-08-24 13:50:00-04:00 | 1.117 | 1.262 |
| 2021-08-24 13:55:00-04:00 | 1.117 | 1.262 |
| 2021-08-24 14:00:00-04:00 | 1.117 | 1.262 |
| 2021-08-24 14:05:00-04:00 | 1.117 | 1.262 |
| 2021-08-24 14:10:00-04:00 | 1.117 | 1.262 |
| 2021-08-24 14:15:00-04:00 | 1.117 | 1.262 |
| 2021-08-24 14:20:00-04:00 | 1.118 | 1.263 |
| 2021-08-24 14:25:00-04:00 | 1.116 | 1.262 |
| 2021-08-24 14:30:00-04:00 | 1.118 | 1.263 |
| 2021-08-24 14:35:00-04:00 | 1.117 | 1.262 |
| 2021-08-24 14:40:00-04:00 | 1.116 | 1.261 |
| 2021-08-24 14:45:00-04:00 | 1.118 | 1.263 |
| 2021-08-24 14:50:00-04:00 | 1.118 | 1.263 |
| 2021-08-24 14:55:00-04:00 | 1.119 | 1.265 |
| 2021-08-24 15:00:00-04:00 | 1.119 | 1.264 |
| 2021-08-24 15:05:00-04:00 | 1.121 | 1.266 |
| 2021-08-24 15:10:00-04:00 | 1.12 | 1.265 |
| 2021-08-24 15:15:00-04:00 | 1.12 | 1.265 |
| 2021-08-24 15:20:00-04:00 | 1.12 | 1.266 |
| 2021-08-24 15:25:00-04:00 | 1.121 | 1.266 |
| 2021-08-24 15:30:00-04:00 | 1.12 | 1.265 |
| 2021-08-24 15:35:00-04:00 | 1.12 | 1.265 |
| 2021-08-24 15:40:00-04:00 | 1.12 | 1.265 |
| 2021-08-24 15:45:00-04:00 | 1.119 | 1.264 |
| 2021-08-24 15:50:00-04:00 | 1.12 | 1.265 |
| 2021-08-24 15:55:00-04:00 | 1.118 | 1.263 |
| 2021-08-24 16:00:00-04:00 | 1.12 | 1.265 |